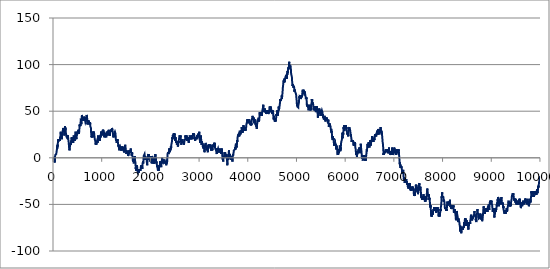
| Category | Series 0 |
|---|---|
| 0.0 | -1 |
| 1.0 | 0 |
| 2.0 | 1 |
| 3.0 | 2 |
| 4.0 | 1 |
| 5.0 | 0 |
| 6.0 | -1 |
| 7.0 | 0 |
| 8.0 | -1 |
| 9.0 | -2 |
| 10.0 | -3 |
| 11.0 | -2 |
| 12.0 | -3 |
| 13.0 | -4 |
| 14.0 | -3 |
| 15.0 | -4 |
| 16.0 | -5 |
| 17.0 | -4 |
| 18.0 | -3 |
| 19.0 | -2 |
| 20.0 | -1 |
| 21.0 | 0 |
| 22.0 | 1 |
| 23.0 | 2 |
| 24.0 | 3 |
| 25.0 | 2 |
| 26.0 | 3 |
| 27.0 | 4 |
| 28.0 | 3 |
| 29.0 | 4 |
| 30.0 | 3 |
| 31.0 | 4 |
| 32.0 | 3 |
| 33.0 | 4 |
| 34.0 | 3 |
| 35.0 | 2 |
| 36.0 | 3 |
| 37.0 | 2 |
| 38.0 | 3 |
| 39.0 | 4 |
| 40.0 | 3 |
| 41.0 | 2 |
| 42.0 | 3 |
| 43.0 | 2 |
| 44.0 | 3 |
| 45.0 | 4 |
| 46.0 | 5 |
| 47.0 | 4 |
| 48.0 | 3 |
| 49.0 | 4 |
| 50.0 | 5 |
| 51.0 | 6 |
| 52.0 | 5 |
| 53.0 | 6 |
| 54.0 | 7 |
| 55.0 | 6 |
| 56.0 | 7 |
| 57.0 | 8 |
| 58.0 | 9 |
| 59.0 | 8 |
| 60.0 | 9 |
| 61.0 | 10 |
| 62.0 | 11 |
| 63.0 | 12 |
| 64.0 | 11 |
| 65.0 | 10 |
| 66.0 | 9 |
| 67.0 | 10 |
| 68.0 | 11 |
| 69.0 | 12 |
| 70.0 | 13 |
| 71.0 | 14 |
| 72.0 | 13 |
| 73.0 | 12 |
| 74.0 | 11 |
| 75.0 | 12 |
| 76.0 | 13 |
| 77.0 | 14 |
| 78.0 | 15 |
| 79.0 | 16 |
| 80.0 | 17 |
| 81.0 | 18 |
| 82.0 | 17 |
| 83.0 | 16 |
| 84.0 | 17 |
| 85.0 | 18 |
| 86.0 | 19 |
| 87.0 | 20 |
| 88.0 | 19 |
| 89.0 | 18 |
| 90.0 | 17 |
| 91.0 | 18 |
| 92.0 | 19 |
| 93.0 | 18 |
| 94.0 | 19 |
| 95.0 | 18 |
| 96.0 | 17 |
| 97.0 | 18 |
| 98.0 | 19 |
| 99.0 | 18 |
| 100.0 | 19 |
| 101.0 | 20 |
| 102.0 | 19 |
| 103.0 | 18 |
| 104.0 | 19 |
| 105.0 | 18 |
| 106.0 | 17 |
| 107.0 | 18 |
| 108.0 | 17 |
| 109.0 | 18 |
| 110.0 | 19 |
| 111.0 | 18 |
| 112.0 | 17 |
| 113.0 | 18 |
| 114.0 | 19 |
| 115.0 | 20 |
| 116.0 | 21 |
| 117.0 | 20 |
| 118.0 | 19 |
| 119.0 | 20 |
| 120.0 | 19 |
| 121.0 | 18 |
| 122.0 | 19 |
| 123.0 | 20 |
| 124.0 | 21 |
| 125.0 | 22 |
| 126.0 | 23 |
| 127.0 | 22 |
| 128.0 | 21 |
| 129.0 | 22 |
| 130.0 | 23 |
| 131.0 | 22 |
| 132.0 | 23 |
| 133.0 | 24 |
| 134.0 | 25 |
| 135.0 | 26 |
| 136.0 | 27 |
| 137.0 | 28 |
| 138.0 | 29 |
| 139.0 | 28 |
| 140.0 | 27 |
| 141.0 | 26 |
| 142.0 | 25 |
| 143.0 | 24 |
| 144.0 | 23 |
| 145.0 | 24 |
| 146.0 | 25 |
| 147.0 | 24 |
| 148.0 | 23 |
| 149.0 | 24 |
| 150.0 | 25 |
| 151.0 | 26 |
| 152.0 | 25 |
| 153.0 | 24 |
| 154.0 | 25 |
| 155.0 | 24 |
| 156.0 | 25 |
| 157.0 | 24 |
| 158.0 | 23 |
| 159.0 | 22 |
| 160.0 | 21 |
| 161.0 | 22 |
| 162.0 | 21 |
| 163.0 | 20 |
| 164.0 | 21 |
| 165.0 | 22 |
| 166.0 | 23 |
| 167.0 | 24 |
| 168.0 | 25 |
| 169.0 | 24 |
| 170.0 | 25 |
| 171.0 | 24 |
| 172.0 | 23 |
| 173.0 | 24 |
| 174.0 | 25 |
| 175.0 | 26 |
| 176.0 | 27 |
| 177.0 | 28 |
| 178.0 | 29 |
| 179.0 | 28 |
| 180.0 | 29 |
| 181.0 | 28 |
| 182.0 | 29 |
| 183.0 | 30 |
| 184.0 | 31 |
| 185.0 | 32 |
| 186.0 | 33 |
| 187.0 | 32 |
| 188.0 | 33 |
| 189.0 | 32 |
| 190.0 | 33 |
| 191.0 | 32 |
| 192.0 | 31 |
| 193.0 | 30 |
| 194.0 | 29 |
| 195.0 | 30 |
| 196.0 | 31 |
| 197.0 | 32 |
| 198.0 | 33 |
| 199.0 | 32 |
| 200.0 | 33 |
| 201.0 | 32 |
| 202.0 | 33 |
| 203.0 | 32 |
| 204.0 | 31 |
| 205.0 | 30 |
| 206.0 | 29 |
| 207.0 | 28 |
| 208.0 | 27 |
| 209.0 | 26 |
| 210.0 | 27 |
| 211.0 | 26 |
| 212.0 | 25 |
| 213.0 | 24 |
| 214.0 | 25 |
| 215.0 | 26 |
| 216.0 | 27 |
| 217.0 | 26 |
| 218.0 | 27 |
| 219.0 | 28 |
| 220.0 | 27 |
| 221.0 | 28 |
| 222.0 | 29 |
| 223.0 | 30 |
| 224.0 | 31 |
| 225.0 | 32 |
| 226.0 | 33 |
| 227.0 | 34 |
| 228.0 | 33 |
| 229.0 | 32 |
| 230.0 | 31 |
| 231.0 | 30 |
| 232.0 | 31 |
| 233.0 | 32 |
| 234.0 | 33 |
| 235.0 | 32 |
| 236.0 | 31 |
| 237.0 | 32 |
| 238.0 | 31 |
| 239.0 | 30 |
| 240.0 | 29 |
| 241.0 | 28 |
| 242.0 | 29 |
| 243.0 | 28 |
| 244.0 | 27 |
| 245.0 | 26 |
| 246.0 | 27 |
| 247.0 | 26 |
| 248.0 | 27 |
| 249.0 | 26 |
| 250.0 | 27 |
| 251.0 | 26 |
| 252.0 | 25 |
| 253.0 | 24 |
| 254.0 | 23 |
| 255.0 | 24 |
| 256.0 | 25 |
| 257.0 | 24 |
| 258.0 | 25 |
| 259.0 | 24 |
| 260.0 | 25 |
| 261.0 | 24 |
| 262.0 | 23 |
| 263.0 | 22 |
| 264.0 | 23 |
| 265.0 | 24 |
| 266.0 | 23 |
| 267.0 | 24 |
| 268.0 | 23 |
| 269.0 | 24 |
| 270.0 | 25 |
| 271.0 | 24 |
| 272.0 | 23 |
| 273.0 | 22 |
| 274.0 | 23 |
| 275.0 | 24 |
| 276.0 | 23 |
| 277.0 | 22 |
| 278.0 | 21 |
| 279.0 | 20 |
| 280.0 | 21 |
| 281.0 | 22 |
| 282.0 | 21 |
| 283.0 | 22 |
| 284.0 | 23 |
| 285.0 | 22 |
| 286.0 | 23 |
| 287.0 | 24 |
| 288.0 | 23 |
| 289.0 | 22 |
| 290.0 | 23 |
| 291.0 | 22 |
| 292.0 | 21 |
| 293.0 | 20 |
| 294.0 | 21 |
| 295.0 | 20 |
| 296.0 | 19 |
| 297.0 | 18 |
| 298.0 | 19 |
| 299.0 | 18 |
| 300.0 | 17 |
| 301.0 | 18 |
| 302.0 | 17 |
| 303.0 | 16 |
| 304.0 | 15 |
| 305.0 | 14 |
| 306.0 | 15 |
| 307.0 | 14 |
| 308.0 | 13 |
| 309.0 | 12 |
| 310.0 | 11 |
| 311.0 | 10 |
| 312.0 | 11 |
| 313.0 | 10 |
| 314.0 | 11 |
| 315.0 | 10 |
| 316.0 | 9 |
| 317.0 | 8 |
| 318.0 | 9 |
| 319.0 | 8 |
| 320.0 | 7 |
| 321.0 | 8 |
| 322.0 | 9 |
| 323.0 | 10 |
| 324.0 | 9 |
| 325.0 | 10 |
| 326.0 | 11 |
| 327.0 | 12 |
| 328.0 | 11 |
| 329.0 | 12 |
| 330.0 | 13 |
| 331.0 | 12 |
| 332.0 | 13 |
| 333.0 | 14 |
| 334.0 | 15 |
| 335.0 | 14 |
| 336.0 | 13 |
| 337.0 | 14 |
| 338.0 | 13 |
| 339.0 | 14 |
| 340.0 | 15 |
| 341.0 | 16 |
| 342.0 | 15 |
| 343.0 | 14 |
| 344.0 | 15 |
| 345.0 | 14 |
| 346.0 | 15 |
| 347.0 | 16 |
| 348.0 | 17 |
| 349.0 | 18 |
| 350.0 | 19 |
| 351.0 | 18 |
| 352.0 | 17 |
| 353.0 | 18 |
| 354.0 | 17 |
| 355.0 | 18 |
| 356.0 | 17 |
| 357.0 | 18 |
| 358.0 | 19 |
| 359.0 | 20 |
| 360.0 | 21 |
| 361.0 | 22 |
| 362.0 | 23 |
| 363.0 | 22 |
| 364.0 | 21 |
| 365.0 | 22 |
| 366.0 | 21 |
| 367.0 | 20 |
| 368.0 | 21 |
| 369.0 | 22 |
| 370.0 | 21 |
| 371.0 | 22 |
| 372.0 | 23 |
| 373.0 | 22 |
| 374.0 | 23 |
| 375.0 | 22 |
| 376.0 | 21 |
| 377.0 | 20 |
| 378.0 | 19 |
| 379.0 | 20 |
| 380.0 | 19 |
| 381.0 | 18 |
| 382.0 | 19 |
| 383.0 | 18 |
| 384.0 | 17 |
| 385.0 | 18 |
| 386.0 | 17 |
| 387.0 | 18 |
| 388.0 | 17 |
| 389.0 | 18 |
| 390.0 | 19 |
| 391.0 | 18 |
| 392.0 | 17 |
| 393.0 | 16 |
| 394.0 | 17 |
| 395.0 | 18 |
| 396.0 | 19 |
| 397.0 | 20 |
| 398.0 | 21 |
| 399.0 | 20 |
| 400.0 | 21 |
| 401.0 | 22 |
| 402.0 | 23 |
| 403.0 | 22 |
| 404.0 | 23 |
| 405.0 | 24 |
| 406.0 | 25 |
| 407.0 | 24 |
| 408.0 | 23 |
| 409.0 | 24 |
| 410.0 | 23 |
| 411.0 | 22 |
| 412.0 | 21 |
| 413.0 | 22 |
| 414.0 | 21 |
| 415.0 | 20 |
| 416.0 | 19 |
| 417.0 | 18 |
| 418.0 | 19 |
| 419.0 | 20 |
| 420.0 | 19 |
| 421.0 | 18 |
| 422.0 | 19 |
| 423.0 | 20 |
| 424.0 | 19 |
| 425.0 | 20 |
| 426.0 | 21 |
| 427.0 | 22 |
| 428.0 | 23 |
| 429.0 | 22 |
| 430.0 | 21 |
| 431.0 | 22 |
| 432.0 | 21 |
| 433.0 | 22 |
| 434.0 | 23 |
| 435.0 | 22 |
| 436.0 | 23 |
| 437.0 | 24 |
| 438.0 | 25 |
| 439.0 | 26 |
| 440.0 | 27 |
| 441.0 | 26 |
| 442.0 | 27 |
| 443.0 | 28 |
| 444.0 | 29 |
| 445.0 | 28 |
| 446.0 | 27 |
| 447.0 | 26 |
| 448.0 | 25 |
| 449.0 | 24 |
| 450.0 | 23 |
| 451.0 | 24 |
| 452.0 | 23 |
| 453.0 | 22 |
| 454.0 | 23 |
| 455.0 | 22 |
| 456.0 | 23 |
| 457.0 | 22 |
| 458.0 | 21 |
| 459.0 | 20 |
| 460.0 | 21 |
| 461.0 | 22 |
| 462.0 | 23 |
| 463.0 | 24 |
| 464.0 | 25 |
| 465.0 | 26 |
| 466.0 | 27 |
| 467.0 | 26 |
| 468.0 | 27 |
| 469.0 | 28 |
| 470.0 | 27 |
| 471.0 | 28 |
| 472.0 | 27 |
| 473.0 | 28 |
| 474.0 | 29 |
| 475.0 | 28 |
| 476.0 | 29 |
| 477.0 | 28 |
| 478.0 | 29 |
| 479.0 | 28 |
| 480.0 | 27 |
| 481.0 | 26 |
| 482.0 | 27 |
| 483.0 | 26 |
| 484.0 | 25 |
| 485.0 | 26 |
| 486.0 | 27 |
| 487.0 | 26 |
| 488.0 | 25 |
| 489.0 | 26 |
| 490.0 | 27 |
| 491.0 | 26 |
| 492.0 | 27 |
| 493.0 | 28 |
| 494.0 | 27 |
| 495.0 | 28 |
| 496.0 | 29 |
| 497.0 | 28 |
| 498.0 | 29 |
| 499.0 | 30 |
| 500.0 | 29 |
| 501.0 | 28 |
| 502.0 | 27 |
| 503.0 | 26 |
| 504.0 | 27 |
| 505.0 | 26 |
| 506.0 | 27 |
| 507.0 | 28 |
| 508.0 | 27 |
| 509.0 | 26 |
| 510.0 | 25 |
| 511.0 | 26 |
| 512.0 | 27 |
| 513.0 | 26 |
| 514.0 | 27 |
| 515.0 | 26 |
| 516.0 | 27 |
| 517.0 | 28 |
| 518.0 | 29 |
| 519.0 | 30 |
| 520.0 | 31 |
| 521.0 | 30 |
| 522.0 | 31 |
| 523.0 | 32 |
| 524.0 | 33 |
| 525.0 | 34 |
| 526.0 | 35 |
| 527.0 | 36 |
| 528.0 | 35 |
| 529.0 | 34 |
| 530.0 | 33 |
| 531.0 | 34 |
| 532.0 | 35 |
| 533.0 | 36 |
| 534.0 | 37 |
| 535.0 | 36 |
| 536.0 | 35 |
| 537.0 | 36 |
| 538.0 | 35 |
| 539.0 | 36 |
| 540.0 | 35 |
| 541.0 | 34 |
| 542.0 | 35 |
| 543.0 | 36 |
| 544.0 | 37 |
| 545.0 | 38 |
| 546.0 | 39 |
| 547.0 | 38 |
| 548.0 | 39 |
| 549.0 | 40 |
| 550.0 | 41 |
| 551.0 | 42 |
| 552.0 | 43 |
| 553.0 | 42 |
| 554.0 | 41 |
| 555.0 | 40 |
| 556.0 | 39 |
| 557.0 | 40 |
| 558.0 | 39 |
| 559.0 | 38 |
| 560.0 | 37 |
| 561.0 | 36 |
| 562.0 | 37 |
| 563.0 | 38 |
| 564.0 | 37 |
| 565.0 | 38 |
| 566.0 | 39 |
| 567.0 | 40 |
| 568.0 | 41 |
| 569.0 | 42 |
| 570.0 | 43 |
| 571.0 | 44 |
| 572.0 | 45 |
| 573.0 | 46 |
| 574.0 | 47 |
| 575.0 | 46 |
| 576.0 | 45 |
| 577.0 | 44 |
| 578.0 | 43 |
| 579.0 | 44 |
| 580.0 | 43 |
| 581.0 | 44 |
| 582.0 | 43 |
| 583.0 | 42 |
| 584.0 | 41 |
| 585.0 | 42 |
| 586.0 | 43 |
| 587.0 | 42 |
| 588.0 | 43 |
| 589.0 | 42 |
| 590.0 | 41 |
| 591.0 | 42 |
| 592.0 | 41 |
| 593.0 | 40 |
| 594.0 | 41 |
| 595.0 | 40 |
| 596.0 | 39 |
| 597.0 | 40 |
| 598.0 | 41 |
| 599.0 | 42 |
| 600.0 | 41 |
| 601.0 | 40 |
| 602.0 | 41 |
| 603.0 | 42 |
| 604.0 | 41 |
| 605.0 | 42 |
| 606.0 | 41 |
| 607.0 | 42 |
| 608.0 | 43 |
| 609.0 | 44 |
| 610.0 | 43 |
| 611.0 | 44 |
| 612.0 | 45 |
| 613.0 | 44 |
| 614.0 | 45 |
| 615.0 | 44 |
| 616.0 | 43 |
| 617.0 | 42 |
| 618.0 | 43 |
| 619.0 | 44 |
| 620.0 | 43 |
| 621.0 | 44 |
| 622.0 | 45 |
| 623.0 | 44 |
| 624.0 | 43 |
| 625.0 | 42 |
| 626.0 | 41 |
| 627.0 | 42 |
| 628.0 | 43 |
| 629.0 | 42 |
| 630.0 | 41 |
| 631.0 | 42 |
| 632.0 | 43 |
| 633.0 | 42 |
| 634.0 | 43 |
| 635.0 | 42 |
| 636.0 | 41 |
| 637.0 | 40 |
| 638.0 | 41 |
| 639.0 | 40 |
| 640.0 | 39 |
| 641.0 | 40 |
| 642.0 | 41 |
| 643.0 | 40 |
| 644.0 | 39 |
| 645.0 | 38 |
| 646.0 | 37 |
| 647.0 | 38 |
| 648.0 | 39 |
| 649.0 | 38 |
| 650.0 | 39 |
| 651.0 | 38 |
| 652.0 | 37 |
| 653.0 | 38 |
| 654.0 | 37 |
| 655.0 | 38 |
| 656.0 | 39 |
| 657.0 | 38 |
| 658.0 | 39 |
| 659.0 | 40 |
| 660.0 | 41 |
| 661.0 | 42 |
| 662.0 | 41 |
| 663.0 | 42 |
| 664.0 | 43 |
| 665.0 | 44 |
| 666.0 | 43 |
| 667.0 | 44 |
| 668.0 | 45 |
| 669.0 | 44 |
| 670.0 | 45 |
| 671.0 | 46 |
| 672.0 | 47 |
| 673.0 | 46 |
| 674.0 | 47 |
| 675.0 | 46 |
| 676.0 | 45 |
| 677.0 | 44 |
| 678.0 | 43 |
| 679.0 | 44 |
| 680.0 | 43 |
| 681.0 | 42 |
| 682.0 | 41 |
| 683.0 | 40 |
| 684.0 | 39 |
| 685.0 | 38 |
| 686.0 | 37 |
| 687.0 | 38 |
| 688.0 | 37 |
| 689.0 | 36 |
| 690.0 | 37 |
| 691.0 | 38 |
| 692.0 | 37 |
| 693.0 | 38 |
| 694.0 | 37 |
| 695.0 | 36 |
| 696.0 | 37 |
| 697.0 | 38 |
| 698.0 | 39 |
| 699.0 | 40 |
| 700.0 | 41 |
| 701.0 | 40 |
| 702.0 | 39 |
| 703.0 | 38 |
| 704.0 | 37 |
| 705.0 | 38 |
| 706.0 | 39 |
| 707.0 | 38 |
| 708.0 | 37 |
| 709.0 | 38 |
| 710.0 | 39 |
| 711.0 | 38 |
| 712.0 | 37 |
| 713.0 | 38 |
| 714.0 | 39 |
| 715.0 | 40 |
| 716.0 | 39 |
| 717.0 | 38 |
| 718.0 | 37 |
| 719.0 | 38 |
| 720.0 | 37 |
| 721.0 | 36 |
| 722.0 | 37 |
| 723.0 | 38 |
| 724.0 | 39 |
| 725.0 | 38 |
| 726.0 | 37 |
| 727.0 | 36 |
| 728.0 | 37 |
| 729.0 | 36 |
| 730.0 | 35 |
| 731.0 | 36 |
| 732.0 | 35 |
| 733.0 | 36 |
| 734.0 | 37 |
| 735.0 | 36 |
| 736.0 | 35 |
| 737.0 | 36 |
| 738.0 | 35 |
| 739.0 | 36 |
| 740.0 | 37 |
| 741.0 | 38 |
| 742.0 | 37 |
| 743.0 | 36 |
| 744.0 | 35 |
| 745.0 | 34 |
| 746.0 | 33 |
| 747.0 | 34 |
| 748.0 | 33 |
| 749.0 | 34 |
| 750.0 | 35 |
| 751.0 | 34 |
| 752.0 | 35 |
| 753.0 | 34 |
| 754.0 | 35 |
| 755.0 | 34 |
| 756.0 | 33 |
| 757.0 | 32 |
| 758.0 | 31 |
| 759.0 | 30 |
| 760.0 | 29 |
| 761.0 | 28 |
| 762.0 | 27 |
| 763.0 | 26 |
| 764.0 | 27 |
| 765.0 | 26 |
| 766.0 | 27 |
| 767.0 | 26 |
| 768.0 | 25 |
| 769.0 | 24 |
| 770.0 | 23 |
| 771.0 | 22 |
| 772.0 | 23 |
| 773.0 | 24 |
| 774.0 | 25 |
| 775.0 | 24 |
| 776.0 | 23 |
| 777.0 | 24 |
| 778.0 | 23 |
| 779.0 | 24 |
| 780.0 | 25 |
| 781.0 | 24 |
| 782.0 | 23 |
| 783.0 | 24 |
| 784.0 | 23 |
| 785.0 | 22 |
| 786.0 | 23 |
| 787.0 | 24 |
| 788.0 | 23 |
| 789.0 | 24 |
| 790.0 | 23 |
| 791.0 | 24 |
| 792.0 | 23 |
| 793.0 | 22 |
| 794.0 | 23 |
| 795.0 | 22 |
| 796.0 | 23 |
| 797.0 | 24 |
| 798.0 | 25 |
| 799.0 | 26 |
| 800.0 | 27 |
| 801.0 | 28 |
| 802.0 | 27 |
| 803.0 | 26 |
| 804.0 | 27 |
| 805.0 | 28 |
| 806.0 | 27 |
| 807.0 | 26 |
| 808.0 | 27 |
| 809.0 | 26 |
| 810.0 | 27 |
| 811.0 | 26 |
| 812.0 | 25 |
| 813.0 | 26 |
| 814.0 | 27 |
| 815.0 | 28 |
| 816.0 | 29 |
| 817.0 | 28 |
| 818.0 | 29 |
| 819.0 | 28 |
| 820.0 | 29 |
| 821.0 | 28 |
| 822.0 | 27 |
| 823.0 | 28 |
| 824.0 | 27 |
| 825.0 | 26 |
| 826.0 | 25 |
| 827.0 | 24 |
| 828.0 | 23 |
| 829.0 | 24 |
| 830.0 | 23 |
| 831.0 | 24 |
| 832.0 | 23 |
| 833.0 | 22 |
| 834.0 | 23 |
| 835.0 | 22 |
| 836.0 | 21 |
| 837.0 | 20 |
| 838.0 | 19 |
| 839.0 | 20 |
| 840.0 | 21 |
| 841.0 | 20 |
| 842.0 | 19 |
| 843.0 | 20 |
| 844.0 | 19 |
| 845.0 | 20 |
| 846.0 | 19 |
| 847.0 | 18 |
| 848.0 | 17 |
| 849.0 | 18 |
| 850.0 | 19 |
| 851.0 | 18 |
| 852.0 | 17 |
| 853.0 | 16 |
| 854.0 | 17 |
| 855.0 | 16 |
| 856.0 | 15 |
| 857.0 | 14 |
| 858.0 | 15 |
| 859.0 | 16 |
| 860.0 | 15 |
| 861.0 | 16 |
| 862.0 | 15 |
| 863.0 | 14 |
| 864.0 | 15 |
| 865.0 | 16 |
| 866.0 | 15 |
| 867.0 | 14 |
| 868.0 | 15 |
| 869.0 | 14 |
| 870.0 | 15 |
| 871.0 | 16 |
| 872.0 | 15 |
| 873.0 | 16 |
| 874.0 | 15 |
| 875.0 | 16 |
| 876.0 | 15 |
| 877.0 | 16 |
| 878.0 | 17 |
| 879.0 | 16 |
| 880.0 | 17 |
| 881.0 | 16 |
| 882.0 | 17 |
| 883.0 | 18 |
| 884.0 | 19 |
| 885.0 | 18 |
| 886.0 | 17 |
| 887.0 | 18 |
| 888.0 | 19 |
| 889.0 | 18 |
| 890.0 | 19 |
| 891.0 | 18 |
| 892.0 | 19 |
| 893.0 | 18 |
| 894.0 | 17 |
| 895.0 | 16 |
| 896.0 | 17 |
| 897.0 | 18 |
| 898.0 | 19 |
| 899.0 | 20 |
| 900.0 | 21 |
| 901.0 | 22 |
| 902.0 | 23 |
| 903.0 | 24 |
| 904.0 | 23 |
| 905.0 | 22 |
| 906.0 | 23 |
| 907.0 | 22 |
| 908.0 | 23 |
| 909.0 | 22 |
| 910.0 | 21 |
| 911.0 | 22 |
| 912.0 | 21 |
| 913.0 | 20 |
| 914.0 | 21 |
| 915.0 | 22 |
| 916.0 | 23 |
| 917.0 | 22 |
| 918.0 | 21 |
| 919.0 | 22 |
| 920.0 | 21 |
| 921.0 | 20 |
| 922.0 | 21 |
| 923.0 | 20 |
| 924.0 | 19 |
| 925.0 | 20 |
| 926.0 | 19 |
| 927.0 | 18 |
| 928.0 | 17 |
| 929.0 | 18 |
| 930.0 | 19 |
| 931.0 | 20 |
| 932.0 | 21 |
| 933.0 | 20 |
| 934.0 | 21 |
| 935.0 | 20 |
| 936.0 | 19 |
| 937.0 | 18 |
| 938.0 | 19 |
| 939.0 | 20 |
| 940.0 | 21 |
| 941.0 | 22 |
| 942.0 | 21 |
| 943.0 | 20 |
| 944.0 | 21 |
| 945.0 | 20 |
| 946.0 | 21 |
| 947.0 | 22 |
| 948.0 | 23 |
| 949.0 | 24 |
| 950.0 | 23 |
| 951.0 | 22 |
| 952.0 | 23 |
| 953.0 | 24 |
| 954.0 | 25 |
| 955.0 | 24 |
| 956.0 | 23 |
| 957.0 | 22 |
| 958.0 | 23 |
| 959.0 | 24 |
| 960.0 | 23 |
| 961.0 | 24 |
| 962.0 | 25 |
| 963.0 | 26 |
| 964.0 | 27 |
| 965.0 | 26 |
| 966.0 | 27 |
| 967.0 | 28 |
| 968.0 | 27 |
| 969.0 | 28 |
| 970.0 | 27 |
| 971.0 | 26 |
| 972.0 | 27 |
| 973.0 | 28 |
| 974.0 | 29 |
| 975.0 | 28 |
| 976.0 | 27 |
| 977.0 | 28 |
| 978.0 | 27 |
| 979.0 | 28 |
| 980.0 | 27 |
| 981.0 | 26 |
| 982.0 | 25 |
| 983.0 | 26 |
| 984.0 | 25 |
| 985.0 | 24 |
| 986.0 | 23 |
| 987.0 | 24 |
| 988.0 | 23 |
| 989.0 | 24 |
| 990.0 | 23 |
| 991.0 | 24 |
| 992.0 | 25 |
| 993.0 | 26 |
| 994.0 | 25 |
| 995.0 | 26 |
| 996.0 | 27 |
| 997.0 | 28 |
| 998.0 | 27 |
| 999.0 | 28 |
| 1000.0 | 29 |
| 1001.0 | 30 |
| 1002.0 | 31 |
| 1003.0 | 30 |
| 1004.0 | 29 |
| 1005.0 | 30 |
| 1006.0 | 31 |
| 1007.0 | 30 |
| 1008.0 | 29 |
| 1009.0 | 28 |
| 1010.0 | 29 |
| 1011.0 | 30 |
| 1012.0 | 29 |
| 1013.0 | 28 |
| 1014.0 | 27 |
| 1015.0 | 28 |
| 1016.0 | 27 |
| 1017.0 | 28 |
| 1018.0 | 27 |
| 1019.0 | 26 |
| 1020.0 | 25 |
| 1021.0 | 26 |
| 1022.0 | 27 |
| 1023.0 | 28 |
| 1024.0 | 27 |
| 1025.0 | 26 |
| 1026.0 | 25 |
| 1027.0 | 26 |
| 1028.0 | 25 |
| 1029.0 | 24 |
| 1030.0 | 23 |
| 1031.0 | 22 |
| 1032.0 | 23 |
| 1033.0 | 22 |
| 1034.0 | 23 |
| 1035.0 | 24 |
| 1036.0 | 23 |
| 1037.0 | 24 |
| 1038.0 | 23 |
| 1039.0 | 24 |
| 1040.0 | 25 |
| 1041.0 | 24 |
| 1042.0 | 25 |
| 1043.0 | 24 |
| 1044.0 | 25 |
| 1045.0 | 26 |
| 1046.0 | 27 |
| 1047.0 | 26 |
| 1048.0 | 25 |
| 1049.0 | 24 |
| 1050.0 | 23 |
| 1051.0 | 22 |
| 1052.0 | 23 |
| 1053.0 | 24 |
| 1054.0 | 25 |
| 1055.0 | 24 |
| 1056.0 | 25 |
| 1057.0 | 26 |
| 1058.0 | 25 |
| 1059.0 | 26 |
| 1060.0 | 25 |
| 1061.0 | 24 |
| 1062.0 | 25 |
| 1063.0 | 24 |
| 1064.0 | 25 |
| 1065.0 | 24 |
| 1066.0 | 25 |
| 1067.0 | 24 |
| 1068.0 | 25 |
| 1069.0 | 24 |
| 1070.0 | 23 |
| 1071.0 | 22 |
| 1072.0 | 23 |
| 1073.0 | 22 |
| 1074.0 | 21 |
| 1075.0 | 22 |
| 1076.0 | 23 |
| 1077.0 | 24 |
| 1078.0 | 25 |
| 1079.0 | 26 |
| 1080.0 | 27 |
| 1081.0 | 28 |
| 1082.0 | 29 |
| 1083.0 | 28 |
| 1084.0 | 29 |
| 1085.0 | 28 |
| 1086.0 | 27 |
| 1087.0 | 28 |
| 1088.0 | 27 |
| 1089.0 | 26 |
| 1090.0 | 25 |
| 1091.0 | 24 |
| 1092.0 | 23 |
| 1093.0 | 24 |
| 1094.0 | 25 |
| 1095.0 | 26 |
| 1096.0 | 27 |
| 1097.0 | 28 |
| 1098.0 | 27 |
| 1099.0 | 26 |
| 1100.0 | 27 |
| 1101.0 | 26 |
| 1102.0 | 27 |
| 1103.0 | 28 |
| 1104.0 | 27 |
| 1105.0 | 26 |
| 1106.0 | 27 |
| 1107.0 | 28 |
| 1108.0 | 29 |
| 1109.0 | 28 |
| 1110.0 | 27 |
| 1111.0 | 26 |
| 1112.0 | 27 |
| 1113.0 | 26 |
| 1114.0 | 27 |
| 1115.0 | 28 |
| 1116.0 | 27 |
| 1117.0 | 28 |
| 1118.0 | 29 |
| 1119.0 | 28 |
| 1120.0 | 29 |
| 1121.0 | 30 |
| 1122.0 | 29 |
| 1123.0 | 28 |
| 1124.0 | 27 |
| 1125.0 | 28 |
| 1126.0 | 27 |
| 1127.0 | 26 |
| 1128.0 | 27 |
| 1129.0 | 26 |
| 1130.0 | 25 |
| 1131.0 | 26 |
| 1132.0 | 25 |
| 1133.0 | 24 |
| 1134.0 | 25 |
| 1135.0 | 24 |
| 1136.0 | 25 |
| 1137.0 | 24 |
| 1138.0 | 25 |
| 1139.0 | 26 |
| 1140.0 | 25 |
| 1141.0 | 26 |
| 1142.0 | 25 |
| 1143.0 | 24 |
| 1144.0 | 25 |
| 1145.0 | 26 |
| 1146.0 | 25 |
| 1147.0 | 26 |
| 1148.0 | 25 |
| 1149.0 | 24 |
| 1150.0 | 25 |
| 1151.0 | 26 |
| 1152.0 | 27 |
| 1153.0 | 28 |
| 1154.0 | 29 |
| 1155.0 | 30 |
| 1156.0 | 31 |
| 1157.0 | 30 |
| 1158.0 | 29 |
| 1159.0 | 28 |
| 1160.0 | 27 |
| 1161.0 | 28 |
| 1162.0 | 29 |
| 1163.0 | 30 |
| 1164.0 | 29 |
| 1165.0 | 30 |
| 1166.0 | 29 |
| 1167.0 | 30 |
| 1168.0 | 31 |
| 1169.0 | 30 |
| 1170.0 | 29 |
| 1171.0 | 30 |
| 1172.0 | 29 |
| 1173.0 | 28 |
| 1174.0 | 29 |
| 1175.0 | 30 |
| 1176.0 | 31 |
| 1177.0 | 30 |
| 1178.0 | 31 |
| 1179.0 | 30 |
| 1180.0 | 29 |
| 1181.0 | 28 |
| 1182.0 | 29 |
| 1183.0 | 28 |
| 1184.0 | 27 |
| 1185.0 | 28 |
| 1186.0 | 29 |
| 1187.0 | 30 |
| 1188.0 | 31 |
| 1189.0 | 32 |
| 1190.0 | 31 |
| 1191.0 | 32 |
| 1192.0 | 33 |
| 1193.0 | 32 |
| 1194.0 | 31 |
| 1195.0 | 32 |
| 1196.0 | 33 |
| 1197.0 | 32 |
| 1198.0 | 33 |
| 1199.0 | 32 |
| 1200.0 | 31 |
| 1201.0 | 30 |
| 1202.0 | 31 |
| 1203.0 | 30 |
| 1204.0 | 29 |
| 1205.0 | 28 |
| 1206.0 | 29 |
| 1207.0 | 28 |
| 1208.0 | 27 |
| 1209.0 | 26 |
| 1210.0 | 27 |
| 1211.0 | 26 |
| 1212.0 | 25 |
| 1213.0 | 24 |
| 1214.0 | 23 |
| 1215.0 | 24 |
| 1216.0 | 23 |
| 1217.0 | 24 |
| 1218.0 | 25 |
| 1219.0 | 24 |
| 1220.0 | 23 |
| 1221.0 | 22 |
| 1222.0 | 23 |
| 1223.0 | 24 |
| 1224.0 | 25 |
| 1225.0 | 26 |
| 1226.0 | 25 |
| 1227.0 | 24 |
| 1228.0 | 23 |
| 1229.0 | 22 |
| 1230.0 | 23 |
| 1231.0 | 24 |
| 1232.0 | 25 |
| 1233.0 | 24 |
| 1234.0 | 25 |
| 1235.0 | 26 |
| 1236.0 | 27 |
| 1237.0 | 26 |
| 1238.0 | 27 |
| 1239.0 | 26 |
| 1240.0 | 25 |
| 1241.0 | 26 |
| 1242.0 | 27 |
| 1243.0 | 26 |
| 1244.0 | 25 |
| 1245.0 | 26 |
| 1246.0 | 25 |
| 1247.0 | 26 |
| 1248.0 | 25 |
| 1249.0 | 26 |
| 1250.0 | 27 |
| 1251.0 | 28 |
| 1252.0 | 27 |
| 1253.0 | 28 |
| 1254.0 | 27 |
| 1255.0 | 28 |
| 1256.0 | 29 |
| 1257.0 | 28 |
| 1258.0 | 29 |
| 1259.0 | 28 |
| 1260.0 | 29 |
| 1261.0 | 28 |
| 1262.0 | 27 |
| 1263.0 | 26 |
| 1264.0 | 25 |
| 1265.0 | 24 |
| 1266.0 | 23 |
| 1267.0 | 22 |
| 1268.0 | 21 |
| 1269.0 | 20 |
| 1270.0 | 21 |
| 1271.0 | 20 |
| 1272.0 | 19 |
| 1273.0 | 20 |
| 1274.0 | 19 |
| 1275.0 | 18 |
| 1276.0 | 17 |
| 1277.0 | 18 |
| 1278.0 | 19 |
| 1279.0 | 20 |
| 1280.0 | 19 |
| 1281.0 | 18 |
| 1282.0 | 17 |
| 1283.0 | 18 |
| 1284.0 | 19 |
| 1285.0 | 18 |
| 1286.0 | 17 |
| 1287.0 | 16 |
| 1288.0 | 15 |
| 1289.0 | 16 |
| 1290.0 | 17 |
| 1291.0 | 16 |
| 1292.0 | 17 |
| 1293.0 | 16 |
| 1294.0 | 17 |
| 1295.0 | 18 |
| 1296.0 | 17 |
| 1297.0 | 18 |
| 1298.0 | 17 |
| 1299.0 | 18 |
| 1300.0 | 17 |
| 1301.0 | 18 |
| 1302.0 | 19 |
| 1303.0 | 18 |
| 1304.0 | 19 |
| 1305.0 | 20 |
| 1306.0 | 21 |
| 1307.0 | 20 |
| 1308.0 | 19 |
| 1309.0 | 18 |
| 1310.0 | 19 |
| 1311.0 | 18 |
| 1312.0 | 17 |
| 1313.0 | 18 |
| 1314.0 | 17 |
| 1315.0 | 16 |
| 1316.0 | 15 |
| 1317.0 | 14 |
| 1318.0 | 13 |
| 1319.0 | 14 |
| 1320.0 | 13 |
| 1321.0 | 14 |
| 1322.0 | 13 |
| 1323.0 | 14 |
| 1324.0 | 13 |
| 1325.0 | 12 |
| 1326.0 | 13 |
| 1327.0 | 14 |
| 1328.0 | 13 |
| 1329.0 | 12 |
| 1330.0 | 13 |
| 1331.0 | 12 |
| 1332.0 | 13 |
| 1333.0 | 12 |
| 1334.0 | 11 |
| 1335.0 | 10 |
| 1336.0 | 11 |
| 1337.0 | 12 |
| 1338.0 | 11 |
| 1339.0 | 10 |
| 1340.0 | 9 |
| 1341.0 | 8 |
| 1342.0 | 7 |
| 1343.0 | 8 |
| 1344.0 | 9 |
| 1345.0 | 10 |
| 1346.0 | 11 |
| 1347.0 | 10 |
| 1348.0 | 9 |
| 1349.0 | 10 |
| 1350.0 | 9 |
| 1351.0 | 10 |
| 1352.0 | 11 |
| 1353.0 | 10 |
| 1354.0 | 9 |
| 1355.0 | 10 |
| 1356.0 | 9 |
| 1357.0 | 10 |
| 1358.0 | 11 |
| 1359.0 | 12 |
| 1360.0 | 13 |
| 1361.0 | 12 |
| 1362.0 | 13 |
| 1363.0 | 12 |
| 1364.0 | 13 |
| 1365.0 | 12 |
| 1366.0 | 11 |
| 1367.0 | 12 |
| 1368.0 | 11 |
| 1369.0 | 12 |
| 1370.0 | 11 |
| 1371.0 | 10 |
| 1372.0 | 11 |
| 1373.0 | 10 |
| 1374.0 | 9 |
| 1375.0 | 8 |
| 1376.0 | 9 |
| 1377.0 | 10 |
| 1378.0 | 11 |
| 1379.0 | 10 |
| 1380.0 | 9 |
| 1381.0 | 10 |
| 1382.0 | 9 |
| 1383.0 | 8 |
| 1384.0 | 7 |
| 1385.0 | 8 |
| 1386.0 | 9 |
| 1387.0 | 10 |
| 1388.0 | 11 |
| 1389.0 | 12 |
| 1390.0 | 11 |
| 1391.0 | 10 |
| 1392.0 | 9 |
| 1393.0 | 8 |
| 1394.0 | 9 |
| 1395.0 | 10 |
| 1396.0 | 11 |
| 1397.0 | 12 |
| 1398.0 | 11 |
| 1399.0 | 12 |
| 1400.0 | 11 |
| 1401.0 | 10 |
| 1402.0 | 11 |
| 1403.0 | 10 |
| 1404.0 | 11 |
| 1405.0 | 10 |
| 1406.0 | 9 |
| 1407.0 | 8 |
| 1408.0 | 9 |
| 1409.0 | 10 |
| 1410.0 | 11 |
| 1411.0 | 12 |
| 1412.0 | 13 |
| 1413.0 | 12 |
| 1414.0 | 11 |
| 1415.0 | 12 |
| 1416.0 | 11 |
| 1417.0 | 12 |
| 1418.0 | 11 |
| 1419.0 | 10 |
| 1420.0 | 11 |
| 1421.0 | 10 |
| 1422.0 | 9 |
| 1423.0 | 10 |
| 1424.0 | 11 |
| 1425.0 | 10 |
| 1426.0 | 9 |
| 1427.0 | 10 |
| 1428.0 | 9 |
| 1429.0 | 10 |
| 1430.0 | 9 |
| 1431.0 | 10 |
| 1432.0 | 9 |
| 1433.0 | 8 |
| 1434.0 | 7 |
| 1435.0 | 6 |
| 1436.0 | 7 |
| 1437.0 | 8 |
| 1438.0 | 7 |
| 1439.0 | 8 |
| 1440.0 | 7 |
| 1441.0 | 6 |
| 1442.0 | 7 |
| 1443.0 | 6 |
| 1444.0 | 7 |
| 1445.0 | 8 |
| 1446.0 | 9 |
| 1447.0 | 8 |
| 1448.0 | 7 |
| 1449.0 | 8 |
| 1450.0 | 9 |
| 1451.0 | 10 |
| 1452.0 | 11 |
| 1453.0 | 10 |
| 1454.0 | 11 |
| 1455.0 | 10 |
| 1456.0 | 11 |
| 1457.0 | 12 |
| 1458.0 | 13 |
| 1459.0 | 12 |
| 1460.0 | 13 |
| 1461.0 | 14 |
| 1462.0 | 15 |
| 1463.0 | 14 |
| 1464.0 | 13 |
| 1465.0 | 12 |
| 1466.0 | 11 |
| 1467.0 | 12 |
| 1468.0 | 13 |
| 1469.0 | 12 |
| 1470.0 | 11 |
| 1471.0 | 12 |
| 1472.0 | 11 |
| 1473.0 | 10 |
| 1474.0 | 9 |
| 1475.0 | 8 |
| 1476.0 | 7 |
| 1477.0 | 8 |
| 1478.0 | 9 |
| 1479.0 | 8 |
| 1480.0 | 9 |
| 1481.0 | 8 |
| 1482.0 | 7 |
| 1483.0 | 6 |
| 1484.0 | 5 |
| 1485.0 | 4 |
| 1486.0 | 5 |
| 1487.0 | 6 |
| 1488.0 | 5 |
| 1489.0 | 6 |
| 1490.0 | 7 |
| 1491.0 | 8 |
| 1492.0 | 7 |
| 1493.0 | 8 |
| 1494.0 | 7 |
| 1495.0 | 8 |
| 1496.0 | 9 |
| 1497.0 | 8 |
| 1498.0 | 7 |
| 1499.0 | 6 |
| 1500.0 | 7 |
| 1501.0 | 6 |
| 1502.0 | 5 |
| 1503.0 | 4 |
| 1504.0 | 5 |
| 1505.0 | 6 |
| 1506.0 | 5 |
| 1507.0 | 4 |
| 1508.0 | 5 |
| 1509.0 | 4 |
| 1510.0 | 3 |
| 1511.0 | 4 |
| 1512.0 | 5 |
| 1513.0 | 4 |
| 1514.0 | 5 |
| 1515.0 | 6 |
| 1516.0 | 7 |
| 1517.0 | 6 |
| 1518.0 | 5 |
| 1519.0 | 4 |
| 1520.0 | 3 |
| 1521.0 | 2 |
| 1522.0 | 3 |
| 1523.0 | 2 |
| 1524.0 | 3 |
| 1525.0 | 2 |
| 1526.0 | 3 |
| 1527.0 | 2 |
| 1528.0 | 3 |
| 1529.0 | 2 |
| 1530.0 | 3 |
| 1531.0 | 2 |
| 1532.0 | 3 |
| 1533.0 | 2 |
| 1534.0 | 3 |
| 1535.0 | 2 |
| 1536.0 | 3 |
| 1537.0 | 4 |
| 1538.0 | 5 |
| 1539.0 | 4 |
| 1540.0 | 5 |
| 1541.0 | 6 |
| 1542.0 | 7 |
| 1543.0 | 8 |
| 1544.0 | 9 |
| 1545.0 | 8 |
| 1546.0 | 7 |
| 1547.0 | 6 |
| 1548.0 | 7 |
| 1549.0 | 6 |
| 1550.0 | 7 |
| 1551.0 | 6 |
| 1552.0 | 5 |
| 1553.0 | 6 |
| 1554.0 | 7 |
| 1555.0 | 8 |
| 1556.0 | 7 |
| 1557.0 | 6 |
| 1558.0 | 5 |
| 1559.0 | 6 |
| 1560.0 | 5 |
| 1561.0 | 6 |
| 1562.0 | 5 |
| 1563.0 | 6 |
| 1564.0 | 7 |
| 1565.0 | 6 |
| 1566.0 | 7 |
| 1567.0 | 8 |
| 1568.0 | 7 |
| 1569.0 | 6 |
| 1570.0 | 5 |
| 1571.0 | 6 |
| 1572.0 | 7 |
| 1573.0 | 8 |
| 1574.0 | 9 |
| 1575.0 | 10 |
| 1576.0 | 9 |
| 1577.0 | 8 |
| 1578.0 | 7 |
| 1579.0 | 8 |
| 1580.0 | 7 |
| 1581.0 | 6 |
| 1582.0 | 5 |
| 1583.0 | 6 |
| 1584.0 | 5 |
| 1585.0 | 6 |
| 1586.0 | 7 |
| 1587.0 | 6 |
| 1588.0 | 7 |
| 1589.0 | 6 |
| 1590.0 | 5 |
| 1591.0 | 6 |
| 1592.0 | 5 |
| 1593.0 | 4 |
| 1594.0 | 3 |
| 1595.0 | 2 |
| 1596.0 | 1 |
| 1597.0 | 2 |
| 1598.0 | 3 |
| 1599.0 | 4 |
| 1600.0 | 5 |
| 1601.0 | 4 |
| 1602.0 | 5 |
| 1603.0 | 6 |
| 1604.0 | 5 |
| 1605.0 | 6 |
| 1606.0 | 5 |
| 1607.0 | 4 |
| 1608.0 | 3 |
| 1609.0 | 2 |
| 1610.0 | 1 |
| 1611.0 | 2 |
| 1612.0 | 1 |
| 1613.0 | 2 |
| 1614.0 | 1 |
| 1615.0 | 0 |
| 1616.0 | -1 |
| 1617.0 | -2 |
| 1618.0 | -3 |
| 1619.0 | -2 |
| 1620.0 | -3 |
| 1621.0 | -4 |
| 1622.0 | -3 |
| 1623.0 | -4 |
| 1624.0 | -5 |
| 1625.0 | -4 |
| 1626.0 | -5 |
| 1627.0 | -4 |
| 1628.0 | -3 |
| 1629.0 | -2 |
| 1630.0 | -3 |
| 1631.0 | -4 |
| 1632.0 | -5 |
| 1633.0 | -4 |
| 1634.0 | -5 |
| 1635.0 | -4 |
| 1636.0 | -5 |
| 1637.0 | -4 |
| 1638.0 | -5 |
| 1639.0 | -6 |
| 1640.0 | -7 |
| 1641.0 | -6 |
| 1642.0 | -5 |
| 1643.0 | -4 |
| 1644.0 | -3 |
| 1645.0 | -2 |
| 1646.0 | -3 |
| 1647.0 | -2 |
| 1648.0 | -1 |
| 1649.0 | 0 |
| 1650.0 | -1 |
| 1651.0 | -2 |
| 1652.0 | -1 |
| 1653.0 | 0 |
| 1654.0 | 1 |
| 1655.0 | 2 |
| 1656.0 | 1 |
| 1657.0 | 0 |
| 1658.0 | -1 |
| 1659.0 | -2 |
| 1660.0 | -1 |
| 1661.0 | -2 |
| 1662.0 | -1 |
| 1663.0 | -2 |
| 1664.0 | -1 |
| 1665.0 | -2 |
| 1666.0 | -3 |
| 1667.0 | -2 |
| 1668.0 | -3 |
| 1669.0 | -4 |
| 1670.0 | -3 |
| 1671.0 | -4 |
| 1672.0 | -5 |
| 1673.0 | -6 |
| 1674.0 | -7 |
| 1675.0 | -8 |
| 1676.0 | -9 |
| 1677.0 | -10 |
| 1678.0 | -11 |
| 1679.0 | -12 |
| 1680.0 | -11 |
| 1681.0 | -10 |
| 1682.0 | -11 |
| 1683.0 | -12 |
| 1684.0 | -11 |
| 1685.0 | -12 |
| 1686.0 | -13 |
| 1687.0 | -14 |
| 1688.0 | -15 |
| 1689.0 | -14 |
| 1690.0 | -13 |
| 1691.0 | -12 |
| 1692.0 | -11 |
| 1693.0 | -12 |
| 1694.0 | -11 |
| 1695.0 | -10 |
| 1696.0 | -11 |
| 1697.0 | -10 |
| 1698.0 | -11 |
| 1699.0 | -10 |
| 1700.0 | -11 |
| 1701.0 | -10 |
| 1702.0 | -9 |
| 1703.0 | -10 |
| 1704.0 | -9 |
| 1705.0 | -8 |
| 1706.0 | -9 |
| 1707.0 | -10 |
| 1708.0 | -11 |
| 1709.0 | -12 |
| 1710.0 | -13 |
| 1711.0 | -12 |
| 1712.0 | -13 |
| 1713.0 | -14 |
| 1714.0 | -15 |
| 1715.0 | -14 |
| 1716.0 | -13 |
| 1717.0 | -14 |
| 1718.0 | -13 |
| 1719.0 | -14 |
| 1720.0 | -15 |
| 1721.0 | -14 |
| 1722.0 | -15 |
| 1723.0 | -16 |
| 1724.0 | -15 |
| 1725.0 | -16 |
| 1726.0 | -17 |
| 1727.0 | -16 |
| 1728.0 | -17 |
| 1729.0 | -16 |
| 1730.0 | -17 |
| 1731.0 | -16 |
| 1732.0 | -17 |
| 1733.0 | -16 |
| 1734.0 | -17 |
| 1735.0 | -16 |
| 1736.0 | -15 |
| 1737.0 | -14 |
| 1738.0 | -15 |
| 1739.0 | -16 |
| 1740.0 | -17 |
| 1741.0 | -16 |
| 1742.0 | -17 |
| 1743.0 | -16 |
| 1744.0 | -15 |
| 1745.0 | -14 |
| 1746.0 | -13 |
| 1747.0 | -12 |
| 1748.0 | -11 |
| 1749.0 | -12 |
| 1750.0 | -13 |
| 1751.0 | -14 |
| 1752.0 | -15 |
| 1753.0 | -14 |
| 1754.0 | -13 |
| 1755.0 | -12 |
| 1756.0 | -13 |
| 1757.0 | -12 |
| 1758.0 | -13 |
| 1759.0 | -14 |
| 1760.0 | -13 |
| 1761.0 | -14 |
| 1762.0 | -13 |
| 1763.0 | -12 |
| 1764.0 | -13 |
| 1765.0 | -12 |
| 1766.0 | -13 |
| 1767.0 | -12 |
| 1768.0 | -11 |
| 1769.0 | -12 |
| 1770.0 | -13 |
| 1771.0 | -14 |
| 1772.0 | -13 |
| 1773.0 | -14 |
| 1774.0 | -15 |
| 1775.0 | -14 |
| 1776.0 | -15 |
| 1777.0 | -14 |
| 1778.0 | -13 |
| 1779.0 | -12 |
| 1780.0 | -11 |
| 1781.0 | -10 |
| 1782.0 | -9 |
| 1783.0 | -10 |
| 1784.0 | -9 |
| 1785.0 | -10 |
| 1786.0 | -11 |
| 1787.0 | -10 |
| 1788.0 | -9 |
| 1789.0 | -8 |
| 1790.0 | -7 |
| 1791.0 | -8 |
| 1792.0 | -9 |
| 1793.0 | -8 |
| 1794.0 | -9 |
| 1795.0 | -8 |
| 1796.0 | -9 |
| 1797.0 | -8 |
| 1798.0 | -9 |
| 1799.0 | -10 |
| 1800.0 | -11 |
| 1801.0 | -12 |
| 1802.0 | -11 |
| 1803.0 | -12 |
| 1804.0 | -11 |
| 1805.0 | -10 |
| 1806.0 | -9 |
| 1807.0 | -10 |
| 1808.0 | -9 |
| 1809.0 | -10 |
| 1810.0 | -11 |
| 1811.0 | -10 |
| 1812.0 | -11 |
| 1813.0 | -12 |
| 1814.0 | -11 |
| 1815.0 | -10 |
| 1816.0 | -9 |
| 1817.0 | -8 |
| 1818.0 | -7 |
| 1819.0 | -6 |
| 1820.0 | -5 |
| 1821.0 | -6 |
| 1822.0 | -7 |
| 1823.0 | -6 |
| 1824.0 | -5 |
| 1825.0 | -6 |
| 1826.0 | -5 |
| 1827.0 | -4 |
| 1828.0 | -5 |
| 1829.0 | -4 |
| 1830.0 | -5 |
| 1831.0 | -6 |
| 1832.0 | -5 |
| 1833.0 | -6 |
| 1834.0 | -5 |
| 1835.0 | -4 |
| 1836.0 | -3 |
| 1837.0 | -2 |
| 1838.0 | -1 |
| 1839.0 | 0 |
| 1840.0 | 1 |
| 1841.0 | 2 |
| 1842.0 | 1 |
| 1843.0 | 2 |
| 1844.0 | 3 |
| 1845.0 | 2 |
| 1846.0 | 1 |
| 1847.0 | 2 |
| 1848.0 | 1 |
| 1849.0 | 2 |
| 1850.0 | 3 |
| 1851.0 | 2 |
| 1852.0 | 1 |
| 1853.0 | 2 |
| 1854.0 | 3 |
| 1855.0 | 2 |
| 1856.0 | 1 |
| 1857.0 | 2 |
| 1858.0 | 3 |
| 1859.0 | 4 |
| 1860.0 | 5 |
| 1861.0 | 4 |
| 1862.0 | 3 |
| 1863.0 | 2 |
| 1864.0 | 1 |
| 1865.0 | 0 |
| 1866.0 | -1 |
| 1867.0 | 0 |
| 1868.0 | -1 |
| 1869.0 | -2 |
| 1870.0 | -1 |
| 1871.0 | 0 |
| 1872.0 | 1 |
| 1873.0 | 0 |
| 1874.0 | 1 |
| 1875.0 | 2 |
| 1876.0 | 1 |
| 1877.0 | 0 |
| 1878.0 | 1 |
| 1879.0 | 0 |
| 1880.0 | -1 |
| 1881.0 | 0 |
| 1882.0 | -1 |
| 1883.0 | -2 |
| 1884.0 | -3 |
| 1885.0 | -2 |
| 1886.0 | -1 |
| 1887.0 | -2 |
| 1888.0 | -1 |
| 1889.0 | 0 |
| 1890.0 | 1 |
| 1891.0 | 0 |
| 1892.0 | 1 |
| 1893.0 | 0 |
| 1894.0 | -1 |
| 1895.0 | 0 |
| 1896.0 | 1 |
| 1897.0 | 0 |
| 1898.0 | -1 |
| 1899.0 | 0 |
| 1900.0 | -1 |
| 1901.0 | -2 |
| 1902.0 | -3 |
| 1903.0 | -2 |
| 1904.0 | -3 |
| 1905.0 | -4 |
| 1906.0 | -3 |
| 1907.0 | -4 |
| 1908.0 | -5 |
| 1909.0 | -6 |
| 1910.0 | -5 |
| 1911.0 | -6 |
| 1912.0 | -7 |
| 1913.0 | -8 |
| 1914.0 | -7 |
| 1915.0 | -6 |
| 1916.0 | -5 |
| 1917.0 | -6 |
| 1918.0 | -5 |
| 1919.0 | -4 |
| 1920.0 | -3 |
| 1921.0 | -2 |
| 1922.0 | -1 |
| 1923.0 | 0 |
| 1924.0 | -1 |
| 1925.0 | -2 |
| 1926.0 | -1 |
| 1927.0 | -2 |
| 1928.0 | -1 |
| 1929.0 | 0 |
| 1930.0 | 1 |
| 1931.0 | 2 |
| 1932.0 | 1 |
| 1933.0 | 2 |
| 1934.0 | 3 |
| 1935.0 | 4 |
| 1936.0 | 3 |
| 1937.0 | 2 |
| 1938.0 | 3 |
| 1939.0 | 2 |
| 1940.0 | 3 |
| 1941.0 | 2 |
| 1942.0 | 1 |
| 1943.0 | 2 |
| 1944.0 | 3 |
| 1945.0 | 2 |
| 1946.0 | 3 |
| 1947.0 | 4 |
| 1948.0 | 5 |
| 1949.0 | 4 |
| 1950.0 | 3 |
| 1951.0 | 2 |
| 1952.0 | 1 |
| 1953.0 | 2 |
| 1954.0 | 3 |
| 1955.0 | 2 |
| 1956.0 | 3 |
| 1957.0 | 2 |
| 1958.0 | 1 |
| 1959.0 | 0 |
| 1960.0 | 1 |
| 1961.0 | 0 |
| 1962.0 | 1 |
| 1963.0 | 2 |
| 1964.0 | 1 |
| 1965.0 | 0 |
| 1966.0 | 1 |
| 1967.0 | 2 |
| 1968.0 | 1 |
| 1969.0 | 0 |
| 1970.0 | -1 |
| 1971.0 | -2 |
| 1972.0 | -3 |
| 1973.0 | -2 |
| 1974.0 | -3 |
| 1975.0 | -4 |
| 1976.0 | -3 |
| 1977.0 | -2 |
| 1978.0 | -1 |
| 1979.0 | -2 |
| 1980.0 | -3 |
| 1981.0 | -2 |
| 1982.0 | -3 |
| 1983.0 | -2 |
| 1984.0 | -3 |
| 1985.0 | -2 |
| 1986.0 | -3 |
| 1987.0 | -2 |
| 1988.0 | -3 |
| 1989.0 | -4 |
| 1990.0 | -3 |
| 1991.0 | -2 |
| 1992.0 | -1 |
| 1993.0 | -2 |
| 1994.0 | -3 |
| 1995.0 | -2 |
| 1996.0 | -3 |
| 1997.0 | -2 |
| 1998.0 | -1 |
| 1999.0 | -2 |
| 2000.0 | -1 |
| 2001.0 | -2 |
| 2002.0 | -3 |
| 2003.0 | -4 |
| 2004.0 | -5 |
| 2005.0 | -6 |
| 2006.0 | -5 |
| 2007.0 | -4 |
| 2008.0 | -3 |
| 2009.0 | -2 |
| 2010.0 | -1 |
| 2011.0 | 0 |
| 2012.0 | 1 |
| 2013.0 | 2 |
| 2014.0 | 1 |
| 2015.0 | 2 |
| 2016.0 | 3 |
| 2017.0 | 2 |
| 2018.0 | 1 |
| 2019.0 | 0 |
| 2020.0 | 1 |
| 2021.0 | 0 |
| 2022.0 | -1 |
| 2023.0 | -2 |
| 2024.0 | -3 |
| 2025.0 | -2 |
| 2026.0 | -3 |
| 2027.0 | -2 |
| 2028.0 | -1 |
| 2029.0 | -2 |
| 2030.0 | -1 |
| 2031.0 | 0 |
| 2032.0 | -1 |
| 2033.0 | -2 |
| 2034.0 | -3 |
| 2035.0 | -4 |
| 2036.0 | -3 |
| 2037.0 | -4 |
| 2038.0 | -3 |
| 2039.0 | -4 |
| 2040.0 | -5 |
| 2041.0 | -6 |
| 2042.0 | -5 |
| 2043.0 | -4 |
| 2044.0 | -5 |
| 2045.0 | -6 |
| 2046.0 | -7 |
| 2047.0 | -6 |
| 2048.0 | -5 |
| 2049.0 | -4 |
| 2050.0 | -5 |
| 2051.0 | -6 |
| 2052.0 | -5 |
| 2053.0 | -4 |
| 2054.0 | -3 |
| 2055.0 | -4 |
| 2056.0 | -3 |
| 2057.0 | -2 |
| 2058.0 | -1 |
| 2059.0 | -2 |
| 2060.0 | -1 |
| 2061.0 | 0 |
| 2062.0 | -1 |
| 2063.0 | 0 |
| 2064.0 | -1 |
| 2065.0 | -2 |
| 2066.0 | -1 |
| 2067.0 | -2 |
| 2068.0 | -1 |
| 2069.0 | 0 |
| 2070.0 | 1 |
| 2071.0 | 2 |
| 2072.0 | 1 |
| 2073.0 | 2 |
| 2074.0 | 3 |
| 2075.0 | 2 |
| 2076.0 | 1 |
| 2077.0 | 0 |
| 2078.0 | 1 |
| 2079.0 | 2 |
| 2080.0 | 3 |
| 2081.0 | 4 |
| 2082.0 | 3 |
| 2083.0 | 2 |
| 2084.0 | 1 |
| 2085.0 | 0 |
| 2086.0 | -1 |
| 2087.0 | -2 |
| 2088.0 | -1 |
| 2089.0 | -2 |
| 2090.0 | -1 |
| 2091.0 | 0 |
| 2092.0 | -1 |
| 2093.0 | -2 |
| 2094.0 | -3 |
| 2095.0 | -2 |
| 2096.0 | -3 |
| 2097.0 | -4 |
| 2098.0 | -5 |
| 2099.0 | -6 |
| 2100.0 | -7 |
| 2101.0 | -6 |
| 2102.0 | -5 |
| 2103.0 | -6 |
| 2104.0 | -5 |
| 2105.0 | -4 |
| 2106.0 | -5 |
| 2107.0 | -6 |
| 2108.0 | -7 |
| 2109.0 | -6 |
| 2110.0 | -5 |
| 2111.0 | -6 |
| 2112.0 | -7 |
| 2113.0 | -6 |
| 2114.0 | -7 |
| 2115.0 | -8 |
| 2116.0 | -9 |
| 2117.0 | -10 |
| 2118.0 | -11 |
| 2119.0 | -10 |
| 2120.0 | -9 |
| 2121.0 | -10 |
| 2122.0 | -9 |
| 2123.0 | -8 |
| 2124.0 | -9 |
| 2125.0 | -10 |
| 2126.0 | -9 |
| 2127.0 | -10 |
| 2128.0 | -11 |
| 2129.0 | -12 |
| 2130.0 | -13 |
| 2131.0 | -12 |
| 2132.0 | -11 |
| 2133.0 | -12 |
| 2134.0 | -13 |
| 2135.0 | -14 |
| 2136.0 | -13 |
| 2137.0 | -14 |
| 2138.0 | -13 |
| 2139.0 | -12 |
| 2140.0 | -13 |
| 2141.0 | -14 |
| 2142.0 | -13 |
| 2143.0 | -12 |
| 2144.0 | -13 |
| 2145.0 | -14 |
| 2146.0 | -15 |
| 2147.0 | -14 |
| 2148.0 | -15 |
| 2149.0 | -14 |
| 2150.0 | -13 |
| 2151.0 | -12 |
| 2152.0 | -11 |
| 2153.0 | -10 |
| 2154.0 | -11 |
| 2155.0 | -12 |
| 2156.0 | -11 |
| 2157.0 | -12 |
| 2158.0 | -11 |
| 2159.0 | -10 |
| 2160.0 | -9 |
| 2161.0 | -8 |
| 2162.0 | -9 |
| 2163.0 | -10 |
| 2164.0 | -9 |
| 2165.0 | -10 |
| 2166.0 | -9 |
| 2167.0 | -10 |
| 2168.0 | -9 |
| 2169.0 | -10 |
| 2170.0 | -9 |
| 2171.0 | -10 |
| 2172.0 | -9 |
| 2173.0 | -8 |
| 2174.0 | -7 |
| 2175.0 | -6 |
| 2176.0 | -5 |
| 2177.0 | -6 |
| 2178.0 | -5 |
| 2179.0 | -4 |
| 2180.0 | -5 |
| 2181.0 | -6 |
| 2182.0 | -5 |
| 2183.0 | -4 |
| 2184.0 | -5 |
| 2185.0 | -6 |
| 2186.0 | -7 |
| 2187.0 | -6 |
| 2188.0 | -5 |
| 2189.0 | -6 |
| 2190.0 | -7 |
| 2191.0 | -8 |
| 2192.0 | -7 |
| 2193.0 | -8 |
| 2194.0 | -7 |
| 2195.0 | -8 |
| 2196.0 | -9 |
| 2197.0 | -8 |
| 2198.0 | -9 |
| 2199.0 | -8 |
| 2200.0 | -9 |
| 2201.0 | -10 |
| 2202.0 | -9 |
| 2203.0 | -8 |
| 2204.0 | -7 |
| 2205.0 | -8 |
| 2206.0 | -7 |
| 2207.0 | -6 |
| 2208.0 | -5 |
| 2209.0 | -6 |
| 2210.0 | -5 |
| 2211.0 | -4 |
| 2212.0 | -5 |
| 2213.0 | -4 |
| 2214.0 | -5 |
| 2215.0 | -4 |
| 2216.0 | -3 |
| 2217.0 | -2 |
| 2218.0 | -1 |
| 2219.0 | 0 |
| 2220.0 | 1 |
| 2221.0 | 0 |
| 2222.0 | -1 |
| 2223.0 | -2 |
| 2224.0 | -1 |
| 2225.0 | -2 |
| 2226.0 | -3 |
| 2227.0 | -4 |
| 2228.0 | -5 |
| 2229.0 | -4 |
| 2230.0 | -5 |
| 2231.0 | -6 |
| 2232.0 | -5 |
| 2233.0 | -4 |
| 2234.0 | -3 |
| 2235.0 | -2 |
| 2236.0 | -1 |
| 2237.0 | -2 |
| 2238.0 | -1 |
| 2239.0 | -2 |
| 2240.0 | -3 |
| 2241.0 | -2 |
| 2242.0 | -3 |
| 2243.0 | -2 |
| 2244.0 | -1 |
| 2245.0 | -2 |
| 2246.0 | -1 |
| 2247.0 | -2 |
| 2248.0 | -3 |
| 2249.0 | -4 |
| 2250.0 | -5 |
| 2251.0 | -4 |
| 2252.0 | -5 |
| 2253.0 | -4 |
| 2254.0 | -3 |
| 2255.0 | -4 |
| 2256.0 | -3 |
| 2257.0 | -2 |
| 2258.0 | -1 |
| 2259.0 | -2 |
| 2260.0 | -3 |
| 2261.0 | -4 |
| 2262.0 | -3 |
| 2263.0 | -4 |
| 2264.0 | -3 |
| 2265.0 | -2 |
| 2266.0 | -3 |
| 2267.0 | -4 |
| 2268.0 | -3 |
| 2269.0 | -4 |
| 2270.0 | -3 |
| 2271.0 | -4 |
| 2272.0 | -3 |
| 2273.0 | -4 |
| 2274.0 | -3 |
| 2275.0 | -4 |
| 2276.0 | -5 |
| 2277.0 | -6 |
| 2278.0 | -5 |
| 2279.0 | -6 |
| 2280.0 | -5 |
| 2281.0 | -4 |
| 2282.0 | -5 |
| 2283.0 | -4 |
| 2284.0 | -5 |
| 2285.0 | -4 |
| 2286.0 | -3 |
| 2287.0 | -4 |
| 2288.0 | -5 |
| 2289.0 | -6 |
| 2290.0 | -7 |
| 2291.0 | -6 |
| 2292.0 | -7 |
| 2293.0 | -6 |
| 2294.0 | -7 |
| 2295.0 | -6 |
| 2296.0 | -7 |
| 2297.0 | -6 |
| 2298.0 | -5 |
| 2299.0 | -4 |
| 2300.0 | -5 |
| 2301.0 | -6 |
| 2302.0 | -7 |
| 2303.0 | -6 |
| 2304.0 | -7 |
| 2305.0 | -8 |
| 2306.0 | -7 |
| 2307.0 | -6 |
| 2308.0 | -7 |
| 2309.0 | -6 |
| 2310.0 | -5 |
| 2311.0 | -6 |
| 2312.0 | -7 |
| 2313.0 | -6 |
| 2314.0 | -5 |
| 2315.0 | -4 |
| 2316.0 | -3 |
| 2317.0 | -2 |
| 2318.0 | -3 |
| 2319.0 | -4 |
| 2320.0 | -5 |
| 2321.0 | -6 |
| 2322.0 | -5 |
| 2323.0 | -4 |
| 2324.0 | -3 |
| 2325.0 | -2 |
| 2326.0 | -1 |
| 2327.0 | 0 |
| 2328.0 | 1 |
| 2329.0 | 2 |
| 2330.0 | 3 |
| 2331.0 | 4 |
| 2332.0 | 3 |
| 2333.0 | 4 |
| 2334.0 | 3 |
| 2335.0 | 4 |
| 2336.0 | 3 |
| 2337.0 | 4 |
| 2338.0 | 5 |
| 2339.0 | 4 |
| 2340.0 | 5 |
| 2341.0 | 4 |
| 2342.0 | 5 |
| 2343.0 | 6 |
| 2344.0 | 7 |
| 2345.0 | 6 |
| 2346.0 | 5 |
| 2347.0 | 6 |
| 2348.0 | 5 |
| 2349.0 | 6 |
| 2350.0 | 5 |
| 2351.0 | 4 |
| 2352.0 | 3 |
| 2353.0 | 4 |
| 2354.0 | 5 |
| 2355.0 | 6 |
| 2356.0 | 5 |
| 2357.0 | 6 |
| 2358.0 | 7 |
| 2359.0 | 6 |
| 2360.0 | 5 |
| 2361.0 | 6 |
| 2362.0 | 7 |
| 2363.0 | 6 |
| 2364.0 | 7 |
| 2365.0 | 8 |
| 2366.0 | 9 |
| 2367.0 | 10 |
| 2368.0 | 9 |
| 2369.0 | 10 |
| 2370.0 | 11 |
| 2371.0 | 10 |
| 2372.0 | 9 |
| 2373.0 | 8 |
| 2374.0 | 9 |
| 2375.0 | 10 |
| 2376.0 | 9 |
| 2377.0 | 8 |
| 2378.0 | 7 |
| 2379.0 | 6 |
| 2380.0 | 7 |
| 2381.0 | 8 |
| 2382.0 | 9 |
| 2383.0 | 8 |
| 2384.0 | 7 |
| 2385.0 | 8 |
| 2386.0 | 9 |
| 2387.0 | 10 |
| 2388.0 | 9 |
| 2389.0 | 8 |
| 2390.0 | 7 |
| 2391.0 | 8 |
| 2392.0 | 7 |
| 2393.0 | 8 |
| 2394.0 | 9 |
| 2395.0 | 10 |
| 2396.0 | 11 |
| 2397.0 | 10 |
| 2398.0 | 11 |
| 2399.0 | 12 |
| 2400.0 | 13 |
| 2401.0 | 12 |
| 2402.0 | 11 |
| 2403.0 | 10 |
| 2404.0 | 11 |
| 2405.0 | 10 |
| 2406.0 | 11 |
| 2407.0 | 12 |
| 2408.0 | 13 |
| 2409.0 | 14 |
| 2410.0 | 13 |
| 2411.0 | 14 |
| 2412.0 | 15 |
| 2413.0 | 14 |
| 2414.0 | 13 |
| 2415.0 | 14 |
| 2416.0 | 15 |
| 2417.0 | 16 |
| 2418.0 | 15 |
| 2419.0 | 16 |
| 2420.0 | 17 |
| 2421.0 | 16 |
| 2422.0 | 17 |
| 2423.0 | 18 |
| 2424.0 | 17 |
| 2425.0 | 18 |
| 2426.0 | 19 |
| 2427.0 | 20 |
| 2428.0 | 21 |
| 2429.0 | 22 |
| 2430.0 | 21 |
| 2431.0 | 22 |
| 2432.0 | 21 |
| 2433.0 | 20 |
| 2434.0 | 19 |
| 2435.0 | 20 |
| 2436.0 | 21 |
| 2437.0 | 22 |
| 2438.0 | 23 |
| 2439.0 | 24 |
| 2440.0 | 23 |
| 2441.0 | 24 |
| 2442.0 | 23 |
| 2443.0 | 24 |
| 2444.0 | 23 |
| 2445.0 | 24 |
| 2446.0 | 23 |
| 2447.0 | 22 |
| 2448.0 | 23 |
| 2449.0 | 24 |
| 2450.0 | 25 |
| 2451.0 | 24 |
| 2452.0 | 25 |
| 2453.0 | 26 |
| 2454.0 | 27 |
| 2455.0 | 26 |
| 2456.0 | 27 |
| 2457.0 | 26 |
| 2458.0 | 25 |
| 2459.0 | 26 |
| 2460.0 | 27 |
| 2461.0 | 26 |
| 2462.0 | 25 |
| 2463.0 | 24 |
| 2464.0 | 25 |
| 2465.0 | 26 |
| 2466.0 | 27 |
| 2467.0 | 26 |
| 2468.0 | 25 |
| 2469.0 | 24 |
| 2470.0 | 25 |
| 2471.0 | 24 |
| 2472.0 | 25 |
| 2473.0 | 24 |
| 2474.0 | 23 |
| 2475.0 | 24 |
| 2476.0 | 25 |
| 2477.0 | 26 |
| 2478.0 | 27 |
| 2479.0 | 26 |
| 2480.0 | 25 |
| 2481.0 | 24 |
| 2482.0 | 23 |
| 2483.0 | 22 |
| 2484.0 | 21 |
| 2485.0 | 20 |
| 2486.0 | 19 |
| 2487.0 | 20 |
| 2488.0 | 19 |
| 2489.0 | 18 |
| 2490.0 | 17 |
| 2491.0 | 18 |
| 2492.0 | 19 |
| 2493.0 | 18 |
| 2494.0 | 19 |
| 2495.0 | 20 |
| 2496.0 | 21 |
| 2497.0 | 20 |
| 2498.0 | 21 |
| 2499.0 | 22 |
| 2500.0 | 21 |
| 2501.0 | 20 |
| 2502.0 | 19 |
| 2503.0 | 18 |
| 2504.0 | 17 |
| 2505.0 | 16 |
| 2506.0 | 17 |
| 2507.0 | 18 |
| 2508.0 | 17 |
| 2509.0 | 16 |
| 2510.0 | 17 |
| 2511.0 | 16 |
| 2512.0 | 17 |
| 2513.0 | 18 |
| 2514.0 | 17 |
| 2515.0 | 18 |
| 2516.0 | 19 |
| 2517.0 | 18 |
| 2518.0 | 17 |
| 2519.0 | 18 |
| 2520.0 | 17 |
| 2521.0 | 16 |
| 2522.0 | 15 |
| 2523.0 | 14 |
| 2524.0 | 15 |
| 2525.0 | 16 |
| 2526.0 | 17 |
| 2527.0 | 18 |
| 2528.0 | 17 |
| 2529.0 | 16 |
| 2530.0 | 17 |
| 2531.0 | 16 |
| 2532.0 | 15 |
| 2533.0 | 14 |
| 2534.0 | 15 |
| 2535.0 | 16 |
| 2536.0 | 17 |
| 2537.0 | 16 |
| 2538.0 | 15 |
| 2539.0 | 16 |
| 2540.0 | 15 |
| 2541.0 | 14 |
| 2542.0 | 13 |
| 2543.0 | 12 |
| 2544.0 | 13 |
| 2545.0 | 12 |
| 2546.0 | 11 |
| 2547.0 | 12 |
| 2548.0 | 11 |
| 2549.0 | 12 |
| 2550.0 | 13 |
| 2551.0 | 14 |
| 2552.0 | 13 |
| 2553.0 | 14 |
| 2554.0 | 15 |
| 2555.0 | 16 |
| 2556.0 | 17 |
| 2557.0 | 18 |
| 2558.0 | 19 |
| 2559.0 | 18 |
| 2560.0 | 17 |
| 2561.0 | 16 |
| 2562.0 | 17 |
| 2563.0 | 18 |
| 2564.0 | 19 |
| 2565.0 | 20 |
| 2566.0 | 21 |
| 2567.0 | 20 |
| 2568.0 | 21 |
| 2569.0 | 20 |
| 2570.0 | 21 |
| 2571.0 | 20 |
| 2572.0 | 19 |
| 2573.0 | 20 |
| 2574.0 | 21 |
| 2575.0 | 22 |
| 2576.0 | 23 |
| 2577.0 | 22 |
| 2578.0 | 23 |
| 2579.0 | 24 |
| 2580.0 | 23 |
| 2581.0 | 22 |
| 2582.0 | 23 |
| 2583.0 | 22 |
| 2584.0 | 21 |
| 2585.0 | 22 |
| 2586.0 | 21 |
| 2587.0 | 20 |
| 2588.0 | 21 |
| 2589.0 | 22 |
| 2590.0 | 23 |
| 2591.0 | 22 |
| 2592.0 | 21 |
| 2593.0 | 22 |
| 2594.0 | 21 |
| 2595.0 | 22 |
| 2596.0 | 21 |
| 2597.0 | 22 |
| 2598.0 | 23 |
| 2599.0 | 24 |
| 2600.0 | 25 |
| 2601.0 | 24 |
| 2602.0 | 23 |
| 2603.0 | 22 |
| 2604.0 | 21 |
| 2605.0 | 20 |
| 2606.0 | 19 |
| 2607.0 | 20 |
| 2608.0 | 19 |
| 2609.0 | 18 |
| 2610.0 | 17 |
| 2611.0 | 16 |
| 2612.0 | 15 |
| 2613.0 | 14 |
| 2614.0 | 13 |
| 2615.0 | 14 |
| 2616.0 | 15 |
| 2617.0 | 16 |
| 2618.0 | 15 |
| 2619.0 | 16 |
| 2620.0 | 17 |
| 2621.0 | 18 |
| 2622.0 | 19 |
| 2623.0 | 20 |
| 2624.0 | 19 |
| 2625.0 | 20 |
| 2626.0 | 21 |
| 2627.0 | 20 |
| 2628.0 | 19 |
| 2629.0 | 20 |
| 2630.0 | 19 |
| 2631.0 | 18 |
| 2632.0 | 17 |
| 2633.0 | 18 |
| 2634.0 | 17 |
| 2635.0 | 18 |
| 2636.0 | 19 |
| 2637.0 | 20 |
| 2638.0 | 19 |
| 2639.0 | 18 |
| 2640.0 | 17 |
| 2641.0 | 16 |
| 2642.0 | 15 |
| 2643.0 | 16 |
| 2644.0 | 17 |
| 2645.0 | 18 |
| 2646.0 | 17 |
| 2647.0 | 18 |
| 2648.0 | 19 |
| 2649.0 | 18 |
| 2650.0 | 17 |
| 2651.0 | 16 |
| 2652.0 | 17 |
| 2653.0 | 18 |
| 2654.0 | 17 |
| 2655.0 | 16 |
| 2656.0 | 17 |
| 2657.0 | 16 |
| 2658.0 | 17 |
| 2659.0 | 18 |
| 2660.0 | 17 |
| 2661.0 | 16 |
| 2662.0 | 15 |
| 2663.0 | 16 |
| 2664.0 | 15 |
| 2665.0 | 14 |
| 2666.0 | 15 |
| 2667.0 | 14 |
| 2668.0 | 15 |
| 2669.0 | 14 |
| 2670.0 | 13 |
| 2671.0 | 14 |
| 2672.0 | 15 |
| 2673.0 | 16 |
| 2674.0 | 15 |
| 2675.0 | 16 |
| 2676.0 | 17 |
| 2677.0 | 16 |
| 2678.0 | 17 |
| 2679.0 | 18 |
| 2680.0 | 19 |
| 2681.0 | 18 |
| 2682.0 | 17 |
| 2683.0 | 18 |
| 2684.0 | 17 |
| 2685.0 | 18 |
| 2686.0 | 19 |
| 2687.0 | 18 |
| 2688.0 | 17 |
| 2689.0 | 18 |
| 2690.0 | 19 |
| 2691.0 | 18 |
| 2692.0 | 19 |
| 2693.0 | 20 |
| 2694.0 | 19 |
| 2695.0 | 20 |
| 2696.0 | 21 |
| 2697.0 | 22 |
| 2698.0 | 23 |
| 2699.0 | 24 |
| 2700.0 | 25 |
| 2701.0 | 24 |
| 2702.0 | 23 |
| 2703.0 | 22 |
| 2704.0 | 23 |
| 2705.0 | 24 |
| 2706.0 | 25 |
| 2707.0 | 24 |
| 2708.0 | 25 |
| 2709.0 | 24 |
| 2710.0 | 23 |
| 2711.0 | 22 |
| 2712.0 | 21 |
| 2713.0 | 20 |
| 2714.0 | 19 |
| 2715.0 | 20 |
| 2716.0 | 21 |
| 2717.0 | 22 |
| 2718.0 | 21 |
| 2719.0 | 20 |
| 2720.0 | 21 |
| 2721.0 | 22 |
| 2722.0 | 23 |
| 2723.0 | 24 |
| 2724.0 | 23 |
| 2725.0 | 24 |
| 2726.0 | 23 |
| 2727.0 | 22 |
| 2728.0 | 21 |
| 2729.0 | 20 |
| 2730.0 | 19 |
| 2731.0 | 20 |
| 2732.0 | 19 |
| 2733.0 | 18 |
| 2734.0 | 17 |
| 2735.0 | 18 |
| 2736.0 | 19 |
| 2737.0 | 18 |
| 2738.0 | 19 |
| 2739.0 | 20 |
| 2740.0 | 21 |
| 2741.0 | 20 |
| 2742.0 | 19 |
| 2743.0 | 20 |
| 2744.0 | 21 |
| 2745.0 | 22 |
| 2746.0 | 21 |
| 2747.0 | 22 |
| 2748.0 | 21 |
| 2749.0 | 22 |
| 2750.0 | 21 |
| 2751.0 | 20 |
| 2752.0 | 19 |
| 2753.0 | 20 |
| 2754.0 | 21 |
| 2755.0 | 20 |
| 2756.0 | 19 |
| 2757.0 | 20 |
| 2758.0 | 19 |
| 2759.0 | 20 |
| 2760.0 | 19 |
| 2761.0 | 20 |
| 2762.0 | 19 |
| 2763.0 | 20 |
| 2764.0 | 19 |
| 2765.0 | 18 |
| 2766.0 | 17 |
| 2767.0 | 16 |
| 2768.0 | 17 |
| 2769.0 | 18 |
| 2770.0 | 19 |
| 2771.0 | 20 |
| 2772.0 | 21 |
| 2773.0 | 20 |
| 2774.0 | 21 |
| 2775.0 | 20 |
| 2776.0 | 21 |
| 2777.0 | 22 |
| 2778.0 | 23 |
| 2779.0 | 22 |
| 2780.0 | 21 |
| 2781.0 | 20 |
| 2782.0 | 21 |
| 2783.0 | 22 |
| 2784.0 | 21 |
| 2785.0 | 22 |
| 2786.0 | 23 |
| 2787.0 | 22 |
| 2788.0 | 23 |
| 2789.0 | 24 |
| 2790.0 | 25 |
| 2791.0 | 24 |
| 2792.0 | 23 |
| 2793.0 | 22 |
| 2794.0 | 21 |
| 2795.0 | 22 |
| 2796.0 | 23 |
| 2797.0 | 22 |
| 2798.0 | 21 |
| 2799.0 | 20 |
| 2800.0 | 21 |
| 2801.0 | 20 |
| 2802.0 | 21 |
| 2803.0 | 20 |
| 2804.0 | 19 |
| 2805.0 | 20 |
| 2806.0 | 21 |
| 2807.0 | 22 |
| 2808.0 | 21 |
| 2809.0 | 22 |
| 2810.0 | 21 |
| 2811.0 | 20 |
| 2812.0 | 19 |
| 2813.0 | 20 |
| 2814.0 | 21 |
| 2815.0 | 22 |
| 2816.0 | 21 |
| 2817.0 | 20 |
| 2818.0 | 19 |
| 2819.0 | 20 |
| 2820.0 | 19 |
| 2821.0 | 20 |
| 2822.0 | 21 |
| 2823.0 | 22 |
| 2824.0 | 23 |
| 2825.0 | 22 |
| 2826.0 | 23 |
| 2827.0 | 24 |
| 2828.0 | 25 |
| 2829.0 | 24 |
| 2830.0 | 25 |
| 2831.0 | 24 |
| 2832.0 | 23 |
| 2833.0 | 22 |
| 2834.0 | 23 |
| 2835.0 | 22 |
| 2836.0 | 23 |
| 2837.0 | 24 |
| 2838.0 | 23 |
| 2839.0 | 22 |
| 2840.0 | 21 |
| 2841.0 | 22 |
| 2842.0 | 21 |
| 2843.0 | 20 |
| 2844.0 | 21 |
| 2845.0 | 22 |
| 2846.0 | 21 |
| 2847.0 | 22 |
| 2848.0 | 23 |
| 2849.0 | 24 |
| 2850.0 | 25 |
| 2851.0 | 24 |
| 2852.0 | 23 |
| 2853.0 | 24 |
| 2854.0 | 25 |
| 2855.0 | 24 |
| 2856.0 | 25 |
| 2857.0 | 26 |
| 2858.0 | 25 |
| 2859.0 | 24 |
| 2860.0 | 25 |
| 2861.0 | 26 |
| 2862.0 | 25 |
| 2863.0 | 24 |
| 2864.0 | 25 |
| 2865.0 | 24 |
| 2866.0 | 23 |
| 2867.0 | 24 |
| 2868.0 | 25 |
| 2869.0 | 24 |
| 2870.0 | 23 |
| 2871.0 | 24 |
| 2872.0 | 25 |
| 2873.0 | 26 |
| 2874.0 | 27 |
| 2875.0 | 26 |
| 2876.0 | 27 |
| 2877.0 | 26 |
| 2878.0 | 27 |
| 2879.0 | 26 |
| 2880.0 | 25 |
| 2881.0 | 24 |
| 2882.0 | 23 |
| 2883.0 | 24 |
| 2884.0 | 23 |
| 2885.0 | 22 |
| 2886.0 | 21 |
| 2887.0 | 20 |
| 2888.0 | 21 |
| 2889.0 | 22 |
| 2890.0 | 21 |
| 2891.0 | 22 |
| 2892.0 | 21 |
| 2893.0 | 20 |
| 2894.0 | 19 |
| 2895.0 | 20 |
| 2896.0 | 19 |
| 2897.0 | 18 |
| 2898.0 | 19 |
| 2899.0 | 18 |
| 2900.0 | 19 |
| 2901.0 | 20 |
| 2902.0 | 19 |
| 2903.0 | 20 |
| 2904.0 | 21 |
| 2905.0 | 20 |
| 2906.0 | 19 |
| 2907.0 | 20 |
| 2908.0 | 21 |
| 2909.0 | 20 |
| 2910.0 | 21 |
| 2911.0 | 20 |
| 2912.0 | 21 |
| 2913.0 | 22 |
| 2914.0 | 21 |
| 2915.0 | 20 |
| 2916.0 | 21 |
| 2917.0 | 20 |
| 2918.0 | 21 |
| 2919.0 | 20 |
| 2920.0 | 21 |
| 2921.0 | 20 |
| 2922.0 | 21 |
| 2923.0 | 20 |
| 2924.0 | 19 |
| 2925.0 | 20 |
| 2926.0 | 21 |
| 2927.0 | 20 |
| 2928.0 | 21 |
| 2929.0 | 20 |
| 2930.0 | 21 |
| 2931.0 | 22 |
| 2932.0 | 23 |
| 2933.0 | 22 |
| 2934.0 | 23 |
| 2935.0 | 22 |
| 2936.0 | 21 |
| 2937.0 | 22 |
| 2938.0 | 21 |
| 2939.0 | 20 |
| 2940.0 | 21 |
| 2941.0 | 22 |
| 2942.0 | 23 |
| 2943.0 | 24 |
| 2944.0 | 23 |
| 2945.0 | 22 |
| 2946.0 | 23 |
| 2947.0 | 24 |
| 2948.0 | 23 |
| 2949.0 | 22 |
| 2950.0 | 23 |
| 2951.0 | 22 |
| 2952.0 | 23 |
| 2953.0 | 24 |
| 2954.0 | 23 |
| 2955.0 | 24 |
| 2956.0 | 23 |
| 2957.0 | 24 |
| 2958.0 | 23 |
| 2959.0 | 24 |
| 2960.0 | 23 |
| 2961.0 | 24 |
| 2962.0 | 25 |
| 2963.0 | 24 |
| 2964.0 | 25 |
| 2965.0 | 26 |
| 2966.0 | 25 |
| 2967.0 | 26 |
| 2968.0 | 27 |
| 2969.0 | 26 |
| 2970.0 | 25 |
| 2971.0 | 24 |
| 2972.0 | 25 |
| 2973.0 | 26 |
| 2974.0 | 27 |
| 2975.0 | 26 |
| 2976.0 | 25 |
| 2977.0 | 24 |
| 2978.0 | 25 |
| 2979.0 | 26 |
| 2980.0 | 25 |
| 2981.0 | 26 |
| 2982.0 | 27 |
| 2983.0 | 28 |
| 2984.0 | 27 |
| 2985.0 | 26 |
| 2986.0 | 25 |
| 2987.0 | 24 |
| 2988.0 | 23 |
| 2989.0 | 22 |
| 2990.0 | 21 |
| 2991.0 | 20 |
| 2992.0 | 21 |
| 2993.0 | 20 |
| 2994.0 | 19 |
| 2995.0 | 20 |
| 2996.0 | 19 |
| 2997.0 | 18 |
| 2998.0 | 17 |
| 2999.0 | 18 |
| 3000.0 | 17 |
| 3001.0 | 16 |
| 3002.0 | 17 |
| 3003.0 | 18 |
| 3004.0 | 17 |
| 3005.0 | 18 |
| 3006.0 | 19 |
| 3007.0 | 20 |
| 3008.0 | 19 |
| 3009.0 | 20 |
| 3010.0 | 19 |
| 3011.0 | 20 |
| 3012.0 | 19 |
| 3013.0 | 20 |
| 3014.0 | 21 |
| 3015.0 | 22 |
| 3016.0 | 23 |
| 3017.0 | 24 |
| 3018.0 | 23 |
| 3019.0 | 22 |
| 3020.0 | 21 |
| 3021.0 | 20 |
| 3022.0 | 19 |
| 3023.0 | 20 |
| 3024.0 | 19 |
| 3025.0 | 18 |
| 3026.0 | 17 |
| 3027.0 | 16 |
| 3028.0 | 15 |
| 3029.0 | 14 |
| 3030.0 | 15 |
| 3031.0 | 14 |
| 3032.0 | 15 |
| 3033.0 | 16 |
| 3034.0 | 17 |
| 3035.0 | 18 |
| 3036.0 | 17 |
| 3037.0 | 16 |
| 3038.0 | 17 |
| 3039.0 | 16 |
| 3040.0 | 15 |
| 3041.0 | 16 |
| 3042.0 | 15 |
| 3043.0 | 14 |
| 3044.0 | 15 |
| 3045.0 | 16 |
| 3046.0 | 17 |
| 3047.0 | 16 |
| 3048.0 | 17 |
| 3049.0 | 16 |
| 3050.0 | 17 |
| 3051.0 | 16 |
| 3052.0 | 15 |
| 3053.0 | 14 |
| 3054.0 | 13 |
| 3055.0 | 12 |
| 3056.0 | 13 |
| 3057.0 | 12 |
| 3058.0 | 11 |
| 3059.0 | 12 |
| 3060.0 | 11 |
| 3061.0 | 12 |
| 3062.0 | 11 |
| 3063.0 | 12 |
| 3064.0 | 13 |
| 3065.0 | 12 |
| 3066.0 | 11 |
| 3067.0 | 12 |
| 3068.0 | 13 |
| 3069.0 | 12 |
| 3070.0 | 11 |
| 3071.0 | 10 |
| 3072.0 | 11 |
| 3073.0 | 10 |
| 3074.0 | 11 |
| 3075.0 | 12 |
| 3076.0 | 13 |
| 3077.0 | 14 |
| 3078.0 | 13 |
| 3079.0 | 12 |
| 3080.0 | 11 |
| 3081.0 | 10 |
| 3082.0 | 11 |
| 3083.0 | 10 |
| 3084.0 | 11 |
| 3085.0 | 10 |
| 3086.0 | 9 |
| 3087.0 | 8 |
| 3088.0 | 7 |
| 3089.0 | 6 |
| 3090.0 | 7 |
| 3091.0 | 6 |
| 3092.0 | 7 |
| 3093.0 | 8 |
| 3094.0 | 9 |
| 3095.0 | 10 |
| 3096.0 | 11 |
| 3097.0 | 10 |
| 3098.0 | 9 |
| 3099.0 | 10 |
| 3100.0 | 9 |
| 3101.0 | 10 |
| 3102.0 | 11 |
| 3103.0 | 12 |
| 3104.0 | 13 |
| 3105.0 | 14 |
| 3106.0 | 15 |
| 3107.0 | 14 |
| 3108.0 | 13 |
| 3109.0 | 14 |
| 3110.0 | 15 |
| 3111.0 | 14 |
| 3112.0 | 15 |
| 3113.0 | 14 |
| 3114.0 | 15 |
| 3115.0 | 16 |
| 3116.0 | 15 |
| 3117.0 | 14 |
| 3118.0 | 13 |
| 3119.0 | 14 |
| 3120.0 | 13 |
| 3121.0 | 12 |
| 3122.0 | 13 |
| 3123.0 | 12 |
| 3124.0 | 11 |
| 3125.0 | 10 |
| 3126.0 | 9 |
| 3127.0 | 10 |
| 3128.0 | 11 |
| 3129.0 | 10 |
| 3130.0 | 11 |
| 3131.0 | 10 |
| 3132.0 | 9 |
| 3133.0 | 8 |
| 3134.0 | 9 |
| 3135.0 | 10 |
| 3136.0 | 9 |
| 3137.0 | 10 |
| 3138.0 | 9 |
| 3139.0 | 10 |
| 3140.0 | 9 |
| 3141.0 | 10 |
| 3142.0 | 11 |
| 3143.0 | 12 |
| 3144.0 | 13 |
| 3145.0 | 12 |
| 3146.0 | 11 |
| 3147.0 | 10 |
| 3148.0 | 11 |
| 3149.0 | 10 |
| 3150.0 | 9 |
| 3151.0 | 10 |
| 3152.0 | 9 |
| 3153.0 | 8 |
| 3154.0 | 9 |
| 3155.0 | 8 |
| 3156.0 | 9 |
| 3157.0 | 8 |
| 3158.0 | 7 |
| 3159.0 | 6 |
| 3160.0 | 7 |
| 3161.0 | 8 |
| 3162.0 | 9 |
| 3163.0 | 8 |
| 3164.0 | 9 |
| 3165.0 | 10 |
| 3166.0 | 11 |
| 3167.0 | 12 |
| 3168.0 | 11 |
| 3169.0 | 10 |
| 3170.0 | 11 |
| 3171.0 | 12 |
| 3172.0 | 13 |
| 3173.0 | 14 |
| 3174.0 | 13 |
| 3175.0 | 12 |
| 3176.0 | 13 |
| 3177.0 | 14 |
| 3178.0 | 13 |
| 3179.0 | 14 |
| 3180.0 | 13 |
| 3181.0 | 12 |
| 3182.0 | 11 |
| 3183.0 | 12 |
| 3184.0 | 13 |
| 3185.0 | 14 |
| 3186.0 | 15 |
| 3187.0 | 14 |
| 3188.0 | 13 |
| 3189.0 | 12 |
| 3190.0 | 11 |
| 3191.0 | 12 |
| 3192.0 | 13 |
| 3193.0 | 14 |
| 3194.0 | 15 |
| 3195.0 | 14 |
| 3196.0 | 13 |
| 3197.0 | 12 |
| 3198.0 | 13 |
| 3199.0 | 12 |
| 3200.0 | 13 |
| 3201.0 | 12 |
| 3202.0 | 11 |
| 3203.0 | 12 |
| 3204.0 | 13 |
| 3205.0 | 12 |
| 3206.0 | 13 |
| 3207.0 | 14 |
| 3208.0 | 13 |
| 3209.0 | 12 |
| 3210.0 | 13 |
| 3211.0 | 12 |
| 3212.0 | 13 |
| 3213.0 | 14 |
| 3214.0 | 15 |
| 3215.0 | 14 |
| 3216.0 | 13 |
| 3217.0 | 14 |
| 3218.0 | 13 |
| 3219.0 | 12 |
| 3220.0 | 11 |
| 3221.0 | 10 |
| 3222.0 | 9 |
| 3223.0 | 8 |
| 3224.0 | 7 |
| 3225.0 | 8 |
| 3226.0 | 9 |
| 3227.0 | 10 |
| 3228.0 | 9 |
| 3229.0 | 10 |
| 3230.0 | 9 |
| 3231.0 | 8 |
| 3232.0 | 9 |
| 3233.0 | 8 |
| 3234.0 | 9 |
| 3235.0 | 8 |
| 3236.0 | 9 |
| 3237.0 | 10 |
| 3238.0 | 9 |
| 3239.0 | 8 |
| 3240.0 | 9 |
| 3241.0 | 10 |
| 3242.0 | 11 |
| 3243.0 | 10 |
| 3244.0 | 9 |
| 3245.0 | 10 |
| 3246.0 | 11 |
| 3247.0 | 12 |
| 3248.0 | 11 |
| 3249.0 | 10 |
| 3250.0 | 9 |
| 3251.0 | 8 |
| 3252.0 | 9 |
| 3253.0 | 8 |
| 3254.0 | 9 |
| 3255.0 | 10 |
| 3256.0 | 11 |
| 3257.0 | 10 |
| 3258.0 | 11 |
| 3259.0 | 12 |
| 3260.0 | 13 |
| 3261.0 | 12 |
| 3262.0 | 13 |
| 3263.0 | 14 |
| 3264.0 | 15 |
| 3265.0 | 14 |
| 3266.0 | 13 |
| 3267.0 | 12 |
| 3268.0 | 13 |
| 3269.0 | 12 |
| 3270.0 | 13 |
| 3271.0 | 12 |
| 3272.0 | 11 |
| 3273.0 | 12 |
| 3274.0 | 13 |
| 3275.0 | 14 |
| 3276.0 | 13 |
| 3277.0 | 14 |
| 3278.0 | 13 |
| 3279.0 | 12 |
| 3280.0 | 11 |
| 3281.0 | 12 |
| 3282.0 | 13 |
| 3283.0 | 14 |
| 3284.0 | 15 |
| 3285.0 | 16 |
| 3286.0 | 15 |
| 3287.0 | 16 |
| 3288.0 | 15 |
| 3289.0 | 14 |
| 3290.0 | 15 |
| 3291.0 | 16 |
| 3292.0 | 17 |
| 3293.0 | 16 |
| 3294.0 | 15 |
| 3295.0 | 14 |
| 3296.0 | 13 |
| 3297.0 | 14 |
| 3298.0 | 15 |
| 3299.0 | 16 |
| 3300.0 | 17 |
| 3301.0 | 16 |
| 3302.0 | 15 |
| 3303.0 | 16 |
| 3304.0 | 15 |
| 3305.0 | 14 |
| 3306.0 | 13 |
| 3307.0 | 12 |
| 3308.0 | 11 |
| 3309.0 | 10 |
| 3310.0 | 9 |
| 3311.0 | 10 |
| 3312.0 | 9 |
| 3313.0 | 10 |
| 3314.0 | 9 |
| 3315.0 | 10 |
| 3316.0 | 9 |
| 3317.0 | 10 |
| 3318.0 | 9 |
| 3319.0 | 10 |
| 3320.0 | 9 |
| 3321.0 | 10 |
| 3322.0 | 9 |
| 3323.0 | 10 |
| 3324.0 | 9 |
| 3325.0 | 10 |
| 3326.0 | 9 |
| 3327.0 | 10 |
| 3328.0 | 9 |
| 3329.0 | 8 |
| 3330.0 | 9 |
| 3331.0 | 10 |
| 3332.0 | 9 |
| 3333.0 | 8 |
| 3334.0 | 7 |
| 3335.0 | 6 |
| 3336.0 | 7 |
| 3337.0 | 6 |
| 3338.0 | 5 |
| 3339.0 | 6 |
| 3340.0 | 5 |
| 3341.0 | 6 |
| 3342.0 | 5 |
| 3343.0 | 4 |
| 3344.0 | 5 |
| 3345.0 | 6 |
| 3346.0 | 5 |
| 3347.0 | 6 |
| 3348.0 | 7 |
| 3349.0 | 8 |
| 3350.0 | 9 |
| 3351.0 | 10 |
| 3352.0 | 11 |
| 3353.0 | 10 |
| 3354.0 | 9 |
| 3355.0 | 8 |
| 3356.0 | 7 |
| 3357.0 | 8 |
| 3358.0 | 7 |
| 3359.0 | 8 |
| 3360.0 | 9 |
| 3361.0 | 8 |
| 3362.0 | 7 |
| 3363.0 | 8 |
| 3364.0 | 9 |
| 3365.0 | 8 |
| 3366.0 | 7 |
| 3367.0 | 8 |
| 3368.0 | 9 |
| 3369.0 | 10 |
| 3370.0 | 9 |
| 3371.0 | 10 |
| 3372.0 | 11 |
| 3373.0 | 10 |
| 3374.0 | 9 |
| 3375.0 | 10 |
| 3376.0 | 9 |
| 3377.0 | 8 |
| 3378.0 | 9 |
| 3379.0 | 8 |
| 3380.0 | 9 |
| 3381.0 | 8 |
| 3382.0 | 7 |
| 3383.0 | 6 |
| 3384.0 | 5 |
| 3385.0 | 6 |
| 3386.0 | 7 |
| 3387.0 | 8 |
| 3388.0 | 7 |
| 3389.0 | 6 |
| 3390.0 | 7 |
| 3391.0 | 6 |
| 3392.0 | 7 |
| 3393.0 | 8 |
| 3394.0 | 7 |
| 3395.0 | 6 |
| 3396.0 | 5 |
| 3397.0 | 6 |
| 3398.0 | 7 |
| 3399.0 | 8 |
| 3400.0 | 7 |
| 3401.0 | 8 |
| 3402.0 | 7 |
| 3403.0 | 8 |
| 3404.0 | 7 |
| 3405.0 | 8 |
| 3406.0 | 7 |
| 3407.0 | 8 |
| 3408.0 | 7 |
| 3409.0 | 8 |
| 3410.0 | 9 |
| 3411.0 | 8 |
| 3412.0 | 9 |
| 3413.0 | 10 |
| 3414.0 | 9 |
| 3415.0 | 8 |
| 3416.0 | 7 |
| 3417.0 | 8 |
| 3418.0 | 9 |
| 3419.0 | 8 |
| 3420.0 | 7 |
| 3421.0 | 6 |
| 3422.0 | 7 |
| 3423.0 | 6 |
| 3424.0 | 7 |
| 3425.0 | 8 |
| 3426.0 | 9 |
| 3427.0 | 8 |
| 3428.0 | 7 |
| 3429.0 | 6 |
| 3430.0 | 5 |
| 3431.0 | 4 |
| 3432.0 | 5 |
| 3433.0 | 6 |
| 3434.0 | 7 |
| 3435.0 | 8 |
| 3436.0 | 9 |
| 3437.0 | 8 |
| 3438.0 | 9 |
| 3439.0 | 8 |
| 3440.0 | 7 |
| 3441.0 | 8 |
| 3442.0 | 9 |
| 3443.0 | 8 |
| 3444.0 | 7 |
| 3445.0 | 8 |
| 3446.0 | 9 |
| 3447.0 | 10 |
| 3448.0 | 9 |
| 3449.0 | 8 |
| 3450.0 | 7 |
| 3451.0 | 6 |
| 3452.0 | 5 |
| 3453.0 | 4 |
| 3454.0 | 3 |
| 3455.0 | 2 |
| 3456.0 | 1 |
| 3457.0 | 2 |
| 3458.0 | 1 |
| 3459.0 | 2 |
| 3460.0 | 1 |
| 3461.0 | 2 |
| 3462.0 | 1 |
| 3463.0 | 0 |
| 3464.0 | -1 |
| 3465.0 | -2 |
| 3466.0 | -1 |
| 3467.0 | 0 |
| 3468.0 | -1 |
| 3469.0 | -2 |
| 3470.0 | -3 |
| 3471.0 | -2 |
| 3472.0 | -3 |
| 3473.0 | -4 |
| 3474.0 | -3 |
| 3475.0 | -4 |
| 3476.0 | -3 |
| 3477.0 | -2 |
| 3478.0 | -3 |
| 3479.0 | -2 |
| 3480.0 | -1 |
| 3481.0 | 0 |
| 3482.0 | 1 |
| 3483.0 | 0 |
| 3484.0 | 1 |
| 3485.0 | 2 |
| 3486.0 | 1 |
| 3487.0 | 0 |
| 3488.0 | 1 |
| 3489.0 | 0 |
| 3490.0 | 1 |
| 3491.0 | 0 |
| 3492.0 | -1 |
| 3493.0 | 0 |
| 3494.0 | 1 |
| 3495.0 | 2 |
| 3496.0 | 3 |
| 3497.0 | 2 |
| 3498.0 | 3 |
| 3499.0 | 4 |
| 3500.0 | 5 |
| 3501.0 | 6 |
| 3502.0 | 7 |
| 3503.0 | 6 |
| 3504.0 | 5 |
| 3505.0 | 4 |
| 3506.0 | 3 |
| 3507.0 | 2 |
| 3508.0 | 3 |
| 3509.0 | 2 |
| 3510.0 | 3 |
| 3511.0 | 4 |
| 3512.0 | 5 |
| 3513.0 | 6 |
| 3514.0 | 7 |
| 3515.0 | 6 |
| 3516.0 | 5 |
| 3517.0 | 6 |
| 3518.0 | 5 |
| 3519.0 | 4 |
| 3520.0 | 5 |
| 3521.0 | 4 |
| 3522.0 | 3 |
| 3523.0 | 2 |
| 3524.0 | 3 |
| 3525.0 | 4 |
| 3526.0 | 3 |
| 3527.0 | 4 |
| 3528.0 | 3 |
| 3529.0 | 4 |
| 3530.0 | 3 |
| 3531.0 | 4 |
| 3532.0 | 3 |
| 3533.0 | 4 |
| 3534.0 | 3 |
| 3535.0 | 2 |
| 3536.0 | 1 |
| 3537.0 | 0 |
| 3538.0 | 1 |
| 3539.0 | 0 |
| 3540.0 | 1 |
| 3541.0 | 2 |
| 3542.0 | 3 |
| 3543.0 | 4 |
| 3544.0 | 3 |
| 3545.0 | 2 |
| 3546.0 | 1 |
| 3547.0 | 0 |
| 3548.0 | -1 |
| 3549.0 | 0 |
| 3550.0 | -1 |
| 3551.0 | -2 |
| 3552.0 | -3 |
| 3553.0 | -2 |
| 3554.0 | -3 |
| 3555.0 | -4 |
| 3556.0 | -5 |
| 3557.0 | -6 |
| 3558.0 | -7 |
| 3559.0 | -8 |
| 3560.0 | -7 |
| 3561.0 | -6 |
| 3562.0 | -5 |
| 3563.0 | -4 |
| 3564.0 | -5 |
| 3565.0 | -4 |
| 3566.0 | -3 |
| 3567.0 | -2 |
| 3568.0 | -1 |
| 3569.0 | -2 |
| 3570.0 | -1 |
| 3571.0 | 0 |
| 3572.0 | -1 |
| 3573.0 | -2 |
| 3574.0 | -1 |
| 3575.0 | -2 |
| 3576.0 | -1 |
| 3577.0 | -2 |
| 3578.0 | -1 |
| 3579.0 | -2 |
| 3580.0 | -1 |
| 3581.0 | 0 |
| 3582.0 | 1 |
| 3583.0 | 0 |
| 3584.0 | 1 |
| 3585.0 | 2 |
| 3586.0 | 3 |
| 3587.0 | 4 |
| 3588.0 | 5 |
| 3589.0 | 6 |
| 3590.0 | 7 |
| 3591.0 | 6 |
| 3592.0 | 7 |
| 3593.0 | 8 |
| 3594.0 | 7 |
| 3595.0 | 6 |
| 3596.0 | 5 |
| 3597.0 | 4 |
| 3598.0 | 3 |
| 3599.0 | 2 |
| 3600.0 | 1 |
| 3601.0 | 0 |
| 3602.0 | 1 |
| 3603.0 | 2 |
| 3604.0 | 1 |
| 3605.0 | 0 |
| 3606.0 | 1 |
| 3607.0 | 0 |
| 3608.0 | 1 |
| 3609.0 | 2 |
| 3610.0 | 3 |
| 3611.0 | 4 |
| 3612.0 | 5 |
| 3613.0 | 4 |
| 3614.0 | 5 |
| 3615.0 | 4 |
| 3616.0 | 3 |
| 3617.0 | 4 |
| 3618.0 | 3 |
| 3619.0 | 4 |
| 3620.0 | 3 |
| 3621.0 | 2 |
| 3622.0 | 1 |
| 3623.0 | 0 |
| 3624.0 | 1 |
| 3625.0 | 0 |
| 3626.0 | -1 |
| 3627.0 | -2 |
| 3628.0 | -1 |
| 3629.0 | -2 |
| 3630.0 | -1 |
| 3631.0 | 0 |
| 3632.0 | -1 |
| 3633.0 | -2 |
| 3634.0 | -1 |
| 3635.0 | -2 |
| 3636.0 | -1 |
| 3637.0 | 0 |
| 3638.0 | -1 |
| 3639.0 | -2 |
| 3640.0 | -1 |
| 3641.0 | 0 |
| 3642.0 | 1 |
| 3643.0 | 0 |
| 3644.0 | 1 |
| 3645.0 | 0 |
| 3646.0 | 1 |
| 3647.0 | 0 |
| 3648.0 | 1 |
| 3649.0 | 2 |
| 3650.0 | 1 |
| 3651.0 | 0 |
| 3652.0 | -1 |
| 3653.0 | 0 |
| 3654.0 | -1 |
| 3655.0 | -2 |
| 3656.0 | -1 |
| 3657.0 | -2 |
| 3658.0 | -1 |
| 3659.0 | -2 |
| 3660.0 | -1 |
| 3661.0 | -2 |
| 3662.0 | -3 |
| 3663.0 | -4 |
| 3664.0 | -3 |
| 3665.0 | -4 |
| 3666.0 | -5 |
| 3667.0 | -4 |
| 3668.0 | -3 |
| 3669.0 | -2 |
| 3670.0 | -1 |
| 3671.0 | 0 |
| 3672.0 | 1 |
| 3673.0 | 2 |
| 3674.0 | 3 |
| 3675.0 | 4 |
| 3676.0 | 3 |
| 3677.0 | 2 |
| 3678.0 | 1 |
| 3679.0 | 2 |
| 3680.0 | 3 |
| 3681.0 | 4 |
| 3682.0 | 3 |
| 3683.0 | 4 |
| 3684.0 | 5 |
| 3685.0 | 4 |
| 3686.0 | 5 |
| 3687.0 | 4 |
| 3688.0 | 5 |
| 3689.0 | 6 |
| 3690.0 | 5 |
| 3691.0 | 6 |
| 3692.0 | 7 |
| 3693.0 | 8 |
| 3694.0 | 9 |
| 3695.0 | 8 |
| 3696.0 | 7 |
| 3697.0 | 8 |
| 3698.0 | 9 |
| 3699.0 | 8 |
| 3700.0 | 7 |
| 3701.0 | 8 |
| 3702.0 | 7 |
| 3703.0 | 8 |
| 3704.0 | 9 |
| 3705.0 | 8 |
| 3706.0 | 7 |
| 3707.0 | 8 |
| 3708.0 | 7 |
| 3709.0 | 8 |
| 3710.0 | 7 |
| 3711.0 | 8 |
| 3712.0 | 7 |
| 3713.0 | 8 |
| 3714.0 | 9 |
| 3715.0 | 10 |
| 3716.0 | 11 |
| 3717.0 | 12 |
| 3718.0 | 11 |
| 3719.0 | 10 |
| 3720.0 | 9 |
| 3721.0 | 10 |
| 3722.0 | 11 |
| 3723.0 | 10 |
| 3724.0 | 9 |
| 3725.0 | 10 |
| 3726.0 | 11 |
| 3727.0 | 12 |
| 3728.0 | 13 |
| 3729.0 | 12 |
| 3730.0 | 13 |
| 3731.0 | 14 |
| 3732.0 | 13 |
| 3733.0 | 14 |
| 3734.0 | 15 |
| 3735.0 | 14 |
| 3736.0 | 15 |
| 3737.0 | 14 |
| 3738.0 | 13 |
| 3739.0 | 14 |
| 3740.0 | 15 |
| 3741.0 | 14 |
| 3742.0 | 15 |
| 3743.0 | 14 |
| 3744.0 | 13 |
| 3745.0 | 14 |
| 3746.0 | 13 |
| 3747.0 | 12 |
| 3748.0 | 11 |
| 3749.0 | 10 |
| 3750.0 | 11 |
| 3751.0 | 12 |
| 3752.0 | 11 |
| 3753.0 | 12 |
| 3754.0 | 13 |
| 3755.0 | 14 |
| 3756.0 | 15 |
| 3757.0 | 16 |
| 3758.0 | 17 |
| 3759.0 | 18 |
| 3760.0 | 19 |
| 3761.0 | 18 |
| 3762.0 | 17 |
| 3763.0 | 16 |
| 3764.0 | 17 |
| 3765.0 | 18 |
| 3766.0 | 19 |
| 3767.0 | 20 |
| 3768.0 | 21 |
| 3769.0 | 22 |
| 3770.0 | 21 |
| 3771.0 | 22 |
| 3772.0 | 21 |
| 3773.0 | 22 |
| 3774.0 | 23 |
| 3775.0 | 22 |
| 3776.0 | 23 |
| 3777.0 | 24 |
| 3778.0 | 23 |
| 3779.0 | 22 |
| 3780.0 | 23 |
| 3781.0 | 24 |
| 3782.0 | 25 |
| 3783.0 | 26 |
| 3784.0 | 25 |
| 3785.0 | 24 |
| 3786.0 | 23 |
| 3787.0 | 24 |
| 3788.0 | 23 |
| 3789.0 | 22 |
| 3790.0 | 23 |
| 3791.0 | 24 |
| 3792.0 | 25 |
| 3793.0 | 26 |
| 3794.0 | 25 |
| 3795.0 | 26 |
| 3796.0 | 25 |
| 3797.0 | 26 |
| 3798.0 | 27 |
| 3799.0 | 26 |
| 3800.0 | 25 |
| 3801.0 | 26 |
| 3802.0 | 25 |
| 3803.0 | 24 |
| 3804.0 | 23 |
| 3805.0 | 24 |
| 3806.0 | 23 |
| 3807.0 | 22 |
| 3808.0 | 23 |
| 3809.0 | 24 |
| 3810.0 | 25 |
| 3811.0 | 24 |
| 3812.0 | 25 |
| 3813.0 | 26 |
| 3814.0 | 27 |
| 3815.0 | 28 |
| 3816.0 | 29 |
| 3817.0 | 28 |
| 3818.0 | 27 |
| 3819.0 | 26 |
| 3820.0 | 27 |
| 3821.0 | 28 |
| 3822.0 | 27 |
| 3823.0 | 28 |
| 3824.0 | 27 |
| 3825.0 | 26 |
| 3826.0 | 27 |
| 3827.0 | 26 |
| 3828.0 | 27 |
| 3829.0 | 26 |
| 3830.0 | 25 |
| 3831.0 | 26 |
| 3832.0 | 25 |
| 3833.0 | 26 |
| 3834.0 | 27 |
| 3835.0 | 28 |
| 3836.0 | 27 |
| 3837.0 | 26 |
| 3838.0 | 27 |
| 3839.0 | 28 |
| 3840.0 | 29 |
| 3841.0 | 28 |
| 3842.0 | 27 |
| 3843.0 | 28 |
| 3844.0 | 29 |
| 3845.0 | 30 |
| 3846.0 | 29 |
| 3847.0 | 28 |
| 3848.0 | 27 |
| 3849.0 | 28 |
| 3850.0 | 29 |
| 3851.0 | 30 |
| 3852.0 | 29 |
| 3853.0 | 30 |
| 3854.0 | 31 |
| 3855.0 | 32 |
| 3856.0 | 33 |
| 3857.0 | 32 |
| 3858.0 | 31 |
| 3859.0 | 30 |
| 3860.0 | 29 |
| 3861.0 | 28 |
| 3862.0 | 29 |
| 3863.0 | 28 |
| 3864.0 | 27 |
| 3865.0 | 28 |
| 3866.0 | 29 |
| 3867.0 | 30 |
| 3868.0 | 31 |
| 3869.0 | 30 |
| 3870.0 | 29 |
| 3871.0 | 28 |
| 3872.0 | 27 |
| 3873.0 | 26 |
| 3874.0 | 27 |
| 3875.0 | 28 |
| 3876.0 | 29 |
| 3877.0 | 30 |
| 3878.0 | 31 |
| 3879.0 | 30 |
| 3880.0 | 29 |
| 3881.0 | 30 |
| 3882.0 | 31 |
| 3883.0 | 32 |
| 3884.0 | 33 |
| 3885.0 | 34 |
| 3886.0 | 33 |
| 3887.0 | 34 |
| 3888.0 | 35 |
| 3889.0 | 34 |
| 3890.0 | 35 |
| 3891.0 | 34 |
| 3892.0 | 35 |
| 3893.0 | 36 |
| 3894.0 | 35 |
| 3895.0 | 36 |
| 3896.0 | 35 |
| 3897.0 | 34 |
| 3898.0 | 35 |
| 3899.0 | 34 |
| 3900.0 | 33 |
| 3901.0 | 32 |
| 3902.0 | 31 |
| 3903.0 | 30 |
| 3904.0 | 29 |
| 3905.0 | 28 |
| 3906.0 | 29 |
| 3907.0 | 28 |
| 3908.0 | 29 |
| 3909.0 | 30 |
| 3910.0 | 31 |
| 3911.0 | 30 |
| 3912.0 | 29 |
| 3913.0 | 30 |
| 3914.0 | 31 |
| 3915.0 | 30 |
| 3916.0 | 31 |
| 3917.0 | 30 |
| 3918.0 | 31 |
| 3919.0 | 32 |
| 3920.0 | 33 |
| 3921.0 | 32 |
| 3922.0 | 33 |
| 3923.0 | 34 |
| 3924.0 | 33 |
| 3925.0 | 32 |
| 3926.0 | 33 |
| 3927.0 | 32 |
| 3928.0 | 33 |
| 3929.0 | 32 |
| 3930.0 | 31 |
| 3931.0 | 30 |
| 3932.0 | 31 |
| 3933.0 | 30 |
| 3934.0 | 29 |
| 3935.0 | 28 |
| 3936.0 | 29 |
| 3937.0 | 30 |
| 3938.0 | 31 |
| 3939.0 | 32 |
| 3940.0 | 31 |
| 3941.0 | 30 |
| 3942.0 | 31 |
| 3943.0 | 32 |
| 3944.0 | 31 |
| 3945.0 | 32 |
| 3946.0 | 33 |
| 3947.0 | 34 |
| 3948.0 | 35 |
| 3949.0 | 34 |
| 3950.0 | 35 |
| 3951.0 | 34 |
| 3952.0 | 35 |
| 3953.0 | 36 |
| 3954.0 | 35 |
| 3955.0 | 36 |
| 3956.0 | 37 |
| 3957.0 | 36 |
| 3958.0 | 37 |
| 3959.0 | 36 |
| 3960.0 | 37 |
| 3961.0 | 36 |
| 3962.0 | 37 |
| 3963.0 | 38 |
| 3964.0 | 37 |
| 3965.0 | 38 |
| 3966.0 | 39 |
| 3967.0 | 40 |
| 3968.0 | 41 |
| 3969.0 | 40 |
| 3970.0 | 41 |
| 3971.0 | 40 |
| 3972.0 | 39 |
| 3973.0 | 40 |
| 3974.0 | 41 |
| 3975.0 | 40 |
| 3976.0 | 39 |
| 3977.0 | 40 |
| 3978.0 | 41 |
| 3979.0 | 40 |
| 3980.0 | 39 |
| 3981.0 | 38 |
| 3982.0 | 39 |
| 3983.0 | 38 |
| 3984.0 | 39 |
| 3985.0 | 40 |
| 3986.0 | 39 |
| 3987.0 | 38 |
| 3988.0 | 39 |
| 3989.0 | 38 |
| 3990.0 | 37 |
| 3991.0 | 38 |
| 3992.0 | 37 |
| 3993.0 | 38 |
| 3994.0 | 39 |
| 3995.0 | 40 |
| 3996.0 | 41 |
| 3997.0 | 40 |
| 3998.0 | 39 |
| 3999.0 | 40 |
| 4000.0 | 41 |
| 4001.0 | 40 |
| 4002.0 | 41 |
| 4003.0 | 40 |
| 4004.0 | 39 |
| 4005.0 | 38 |
| 4006.0 | 39 |
| 4007.0 | 38 |
| 4008.0 | 39 |
| 4009.0 | 40 |
| 4010.0 | 41 |
| 4011.0 | 42 |
| 4012.0 | 41 |
| 4013.0 | 40 |
| 4014.0 | 39 |
| 4015.0 | 38 |
| 4016.0 | 37 |
| 4017.0 | 38 |
| 4018.0 | 37 |
| 4019.0 | 38 |
| 4020.0 | 37 |
| 4021.0 | 36 |
| 4022.0 | 37 |
| 4023.0 | 38 |
| 4024.0 | 39 |
| 4025.0 | 38 |
| 4026.0 | 37 |
| 4027.0 | 38 |
| 4028.0 | 37 |
| 4029.0 | 38 |
| 4030.0 | 39 |
| 4031.0 | 38 |
| 4032.0 | 37 |
| 4033.0 | 38 |
| 4034.0 | 37 |
| 4035.0 | 36 |
| 4036.0 | 35 |
| 4037.0 | 36 |
| 4038.0 | 35 |
| 4039.0 | 36 |
| 4040.0 | 37 |
| 4041.0 | 36 |
| 4042.0 | 35 |
| 4043.0 | 36 |
| 4044.0 | 35 |
| 4045.0 | 34 |
| 4046.0 | 35 |
| 4047.0 | 36 |
| 4048.0 | 35 |
| 4049.0 | 36 |
| 4050.0 | 37 |
| 4051.0 | 36 |
| 4052.0 | 37 |
| 4053.0 | 36 |
| 4054.0 | 35 |
| 4055.0 | 36 |
| 4056.0 | 37 |
| 4057.0 | 38 |
| 4058.0 | 39 |
| 4059.0 | 40 |
| 4060.0 | 41 |
| 4061.0 | 42 |
| 4062.0 | 41 |
| 4063.0 | 40 |
| 4064.0 | 41 |
| 4065.0 | 42 |
| 4066.0 | 41 |
| 4067.0 | 40 |
| 4068.0 | 41 |
| 4069.0 | 40 |
| 4070.0 | 41 |
| 4071.0 | 42 |
| 4072.0 | 41 |
| 4073.0 | 42 |
| 4074.0 | 43 |
| 4075.0 | 44 |
| 4076.0 | 45 |
| 4077.0 | 46 |
| 4078.0 | 45 |
| 4079.0 | 46 |
| 4080.0 | 45 |
| 4081.0 | 44 |
| 4082.0 | 43 |
| 4083.0 | 42 |
| 4084.0 | 41 |
| 4085.0 | 42 |
| 4086.0 | 41 |
| 4087.0 | 42 |
| 4088.0 | 41 |
| 4089.0 | 40 |
| 4090.0 | 41 |
| 4091.0 | 42 |
| 4092.0 | 43 |
| 4093.0 | 42 |
| 4094.0 | 43 |
| 4095.0 | 42 |
| 4096.0 | 43 |
| 4097.0 | 42 |
| 4098.0 | 41 |
| 4099.0 | 42 |
| 4100.0 | 41 |
| 4101.0 | 40 |
| 4102.0 | 41 |
| 4103.0 | 42 |
| 4104.0 | 43 |
| 4105.0 | 42 |
| 4106.0 | 41 |
| 4107.0 | 40 |
| 4108.0 | 39 |
| 4109.0 | 38 |
| 4110.0 | 37 |
| 4111.0 | 36 |
| 4112.0 | 37 |
| 4113.0 | 38 |
| 4114.0 | 39 |
| 4115.0 | 40 |
| 4116.0 | 41 |
| 4117.0 | 40 |
| 4118.0 | 41 |
| 4119.0 | 42 |
| 4120.0 | 41 |
| 4121.0 | 42 |
| 4122.0 | 41 |
| 4123.0 | 40 |
| 4124.0 | 39 |
| 4125.0 | 38 |
| 4126.0 | 37 |
| 4127.0 | 38 |
| 4128.0 | 37 |
| 4129.0 | 38 |
| 4130.0 | 39 |
| 4131.0 | 40 |
| 4132.0 | 41 |
| 4133.0 | 40 |
| 4134.0 | 41 |
| 4135.0 | 40 |
| 4136.0 | 39 |
| 4137.0 | 38 |
| 4138.0 | 37 |
| 4139.0 | 36 |
| 4140.0 | 35 |
| 4141.0 | 34 |
| 4142.0 | 35 |
| 4143.0 | 34 |
| 4144.0 | 35 |
| 4145.0 | 36 |
| 4146.0 | 35 |
| 4147.0 | 36 |
| 4148.0 | 37 |
| 4149.0 | 38 |
| 4150.0 | 37 |
| 4151.0 | 36 |
| 4152.0 | 35 |
| 4153.0 | 34 |
| 4154.0 | 35 |
| 4155.0 | 34 |
| 4156.0 | 35 |
| 4157.0 | 34 |
| 4158.0 | 33 |
| 4159.0 | 34 |
| 4160.0 | 35 |
| 4161.0 | 34 |
| 4162.0 | 33 |
| 4163.0 | 32 |
| 4164.0 | 31 |
| 4165.0 | 32 |
| 4166.0 | 33 |
| 4167.0 | 32 |
| 4168.0 | 33 |
| 4169.0 | 34 |
| 4170.0 | 35 |
| 4171.0 | 36 |
| 4172.0 | 37 |
| 4173.0 | 38 |
| 4174.0 | 37 |
| 4175.0 | 36 |
| 4176.0 | 37 |
| 4177.0 | 38 |
| 4178.0 | 37 |
| 4179.0 | 38 |
| 4180.0 | 39 |
| 4181.0 | 40 |
| 4182.0 | 39 |
| 4183.0 | 38 |
| 4184.0 | 39 |
| 4185.0 | 40 |
| 4186.0 | 39 |
| 4187.0 | 38 |
| 4188.0 | 39 |
| 4189.0 | 38 |
| 4190.0 | 39 |
| 4191.0 | 40 |
| 4192.0 | 41 |
| 4193.0 | 40 |
| 4194.0 | 39 |
| 4195.0 | 40 |
| 4196.0 | 41 |
| 4197.0 | 40 |
| 4198.0 | 41 |
| 4199.0 | 42 |
| 4200.0 | 43 |
| 4201.0 | 42 |
| 4202.0 | 43 |
| 4203.0 | 42 |
| 4204.0 | 41 |
| 4205.0 | 40 |
| 4206.0 | 41 |
| 4207.0 | 40 |
| 4208.0 | 41 |
| 4209.0 | 40 |
| 4210.0 | 39 |
| 4211.0 | 40 |
| 4212.0 | 39 |
| 4213.0 | 40 |
| 4214.0 | 41 |
| 4215.0 | 40 |
| 4216.0 | 41 |
| 4217.0 | 42 |
| 4218.0 | 43 |
| 4219.0 | 44 |
| 4220.0 | 45 |
| 4221.0 | 46 |
| 4222.0 | 47 |
| 4223.0 | 48 |
| 4224.0 | 49 |
| 4225.0 | 48 |
| 4226.0 | 47 |
| 4227.0 | 46 |
| 4228.0 | 47 |
| 4229.0 | 46 |
| 4230.0 | 47 |
| 4231.0 | 48 |
| 4232.0 | 47 |
| 4233.0 | 46 |
| 4234.0 | 45 |
| 4235.0 | 46 |
| 4236.0 | 47 |
| 4237.0 | 48 |
| 4238.0 | 49 |
| 4239.0 | 48 |
| 4240.0 | 47 |
| 4241.0 | 46 |
| 4242.0 | 47 |
| 4243.0 | 48 |
| 4244.0 | 47 |
| 4245.0 | 46 |
| 4246.0 | 47 |
| 4247.0 | 48 |
| 4248.0 | 49 |
| 4249.0 | 50 |
| 4250.0 | 49 |
| 4251.0 | 50 |
| 4252.0 | 49 |
| 4253.0 | 48 |
| 4254.0 | 47 |
| 4255.0 | 46 |
| 4256.0 | 47 |
| 4257.0 | 46 |
| 4258.0 | 45 |
| 4259.0 | 44 |
| 4260.0 | 45 |
| 4261.0 | 46 |
| 4262.0 | 47 |
| 4263.0 | 46 |
| 4264.0 | 47 |
| 4265.0 | 46 |
| 4266.0 | 45 |
| 4267.0 | 46 |
| 4268.0 | 45 |
| 4269.0 | 46 |
| 4270.0 | 45 |
| 4271.0 | 46 |
| 4272.0 | 47 |
| 4273.0 | 48 |
| 4274.0 | 49 |
| 4275.0 | 48 |
| 4276.0 | 49 |
| 4277.0 | 48 |
| 4278.0 | 49 |
| 4279.0 | 50 |
| 4280.0 | 51 |
| 4281.0 | 50 |
| 4282.0 | 51 |
| 4283.0 | 52 |
| 4284.0 | 51 |
| 4285.0 | 52 |
| 4286.0 | 51 |
| 4287.0 | 52 |
| 4288.0 | 53 |
| 4289.0 | 54 |
| 4290.0 | 53 |
| 4291.0 | 54 |
| 4292.0 | 55 |
| 4293.0 | 54 |
| 4294.0 | 55 |
| 4295.0 | 56 |
| 4296.0 | 55 |
| 4297.0 | 56 |
| 4298.0 | 57 |
| 4299.0 | 56 |
| 4300.0 | 55 |
| 4301.0 | 54 |
| 4302.0 | 53 |
| 4303.0 | 54 |
| 4304.0 | 53 |
| 4305.0 | 54 |
| 4306.0 | 53 |
| 4307.0 | 54 |
| 4308.0 | 53 |
| 4309.0 | 52 |
| 4310.0 | 51 |
| 4311.0 | 50 |
| 4312.0 | 49 |
| 4313.0 | 48 |
| 4314.0 | 49 |
| 4315.0 | 48 |
| 4316.0 | 49 |
| 4317.0 | 50 |
| 4318.0 | 51 |
| 4319.0 | 52 |
| 4320.0 | 51 |
| 4321.0 | 50 |
| 4322.0 | 51 |
| 4323.0 | 52 |
| 4324.0 | 51 |
| 4325.0 | 52 |
| 4326.0 | 53 |
| 4327.0 | 52 |
| 4328.0 | 53 |
| 4329.0 | 52 |
| 4330.0 | 53 |
| 4331.0 | 52 |
| 4332.0 | 51 |
| 4333.0 | 50 |
| 4334.0 | 49 |
| 4335.0 | 48 |
| 4336.0 | 49 |
| 4337.0 | 50 |
| 4338.0 | 51 |
| 4339.0 | 50 |
| 4340.0 | 49 |
| 4341.0 | 50 |
| 4342.0 | 49 |
| 4343.0 | 50 |
| 4344.0 | 51 |
| 4345.0 | 50 |
| 4346.0 | 51 |
| 4347.0 | 52 |
| 4348.0 | 51 |
| 4349.0 | 50 |
| 4350.0 | 49 |
| 4351.0 | 50 |
| 4352.0 | 49 |
| 4353.0 | 48 |
| 4354.0 | 47 |
| 4355.0 | 46 |
| 4356.0 | 47 |
| 4357.0 | 46 |
| 4358.0 | 47 |
| 4359.0 | 48 |
| 4360.0 | 47 |
| 4361.0 | 48 |
| 4362.0 | 49 |
| 4363.0 | 48 |
| 4364.0 | 47 |
| 4365.0 | 48 |
| 4366.0 | 49 |
| 4367.0 | 48 |
| 4368.0 | 49 |
| 4369.0 | 48 |
| 4370.0 | 47 |
| 4371.0 | 48 |
| 4372.0 | 49 |
| 4373.0 | 50 |
| 4374.0 | 49 |
| 4375.0 | 48 |
| 4376.0 | 49 |
| 4377.0 | 48 |
| 4378.0 | 47 |
| 4379.0 | 48 |
| 4380.0 | 49 |
| 4381.0 | 50 |
| 4382.0 | 49 |
| 4383.0 | 50 |
| 4384.0 | 51 |
| 4385.0 | 50 |
| 4386.0 | 51 |
| 4387.0 | 50 |
| 4388.0 | 49 |
| 4389.0 | 50 |
| 4390.0 | 51 |
| 4391.0 | 52 |
| 4392.0 | 51 |
| 4393.0 | 50 |
| 4394.0 | 51 |
| 4395.0 | 52 |
| 4396.0 | 51 |
| 4397.0 | 50 |
| 4398.0 | 49 |
| 4399.0 | 48 |
| 4400.0 | 47 |
| 4401.0 | 48 |
| 4402.0 | 47 |
| 4403.0 | 46 |
| 4404.0 | 47 |
| 4405.0 | 48 |
| 4406.0 | 47 |
| 4407.0 | 48 |
| 4408.0 | 47 |
| 4409.0 | 48 |
| 4410.0 | 47 |
| 4411.0 | 46 |
| 4412.0 | 47 |
| 4413.0 | 46 |
| 4414.0 | 47 |
| 4415.0 | 48 |
| 4416.0 | 49 |
| 4417.0 | 50 |
| 4418.0 | 49 |
| 4419.0 | 50 |
| 4420.0 | 51 |
| 4421.0 | 50 |
| 4422.0 | 51 |
| 4423.0 | 52 |
| 4424.0 | 51 |
| 4425.0 | 52 |
| 4426.0 | 51 |
| 4427.0 | 52 |
| 4428.0 | 53 |
| 4429.0 | 54 |
| 4430.0 | 55 |
| 4431.0 | 54 |
| 4432.0 | 53 |
| 4433.0 | 52 |
| 4434.0 | 51 |
| 4435.0 | 50 |
| 4436.0 | 49 |
| 4437.0 | 50 |
| 4438.0 | 49 |
| 4439.0 | 50 |
| 4440.0 | 51 |
| 4441.0 | 52 |
| 4442.0 | 53 |
| 4443.0 | 54 |
| 4444.0 | 53 |
| 4445.0 | 54 |
| 4446.0 | 53 |
| 4447.0 | 54 |
| 4448.0 | 53 |
| 4449.0 | 54 |
| 4450.0 | 55 |
| 4451.0 | 54 |
| 4452.0 | 55 |
| 4453.0 | 54 |
| 4454.0 | 55 |
| 4455.0 | 54 |
| 4456.0 | 55 |
| 4457.0 | 54 |
| 4458.0 | 53 |
| 4459.0 | 52 |
| 4460.0 | 51 |
| 4461.0 | 50 |
| 4462.0 | 51 |
| 4463.0 | 52 |
| 4464.0 | 51 |
| 4465.0 | 52 |
| 4466.0 | 51 |
| 4467.0 | 52 |
| 4468.0 | 51 |
| 4469.0 | 50 |
| 4470.0 | 49 |
| 4471.0 | 48 |
| 4472.0 | 49 |
| 4473.0 | 48 |
| 4474.0 | 49 |
| 4475.0 | 50 |
| 4476.0 | 49 |
| 4477.0 | 48 |
| 4478.0 | 47 |
| 4479.0 | 46 |
| 4480.0 | 47 |
| 4481.0 | 46 |
| 4482.0 | 47 |
| 4483.0 | 48 |
| 4484.0 | 47 |
| 4485.0 | 48 |
| 4486.0 | 49 |
| 4487.0 | 50 |
| 4488.0 | 49 |
| 4489.0 | 48 |
| 4490.0 | 49 |
| 4491.0 | 50 |
| 4492.0 | 51 |
| 4493.0 | 50 |
| 4494.0 | 51 |
| 4495.0 | 52 |
| 4496.0 | 51 |
| 4497.0 | 50 |
| 4498.0 | 49 |
| 4499.0 | 48 |
| 4500.0 | 49 |
| 4501.0 | 48 |
| 4502.0 | 47 |
| 4503.0 | 46 |
| 4504.0 | 45 |
| 4505.0 | 46 |
| 4506.0 | 45 |
| 4507.0 | 44 |
| 4508.0 | 43 |
| 4509.0 | 42 |
| 4510.0 | 41 |
| 4511.0 | 42 |
| 4512.0 | 43 |
| 4513.0 | 42 |
| 4514.0 | 43 |
| 4515.0 | 44 |
| 4516.0 | 43 |
| 4517.0 | 44 |
| 4518.0 | 45 |
| 4519.0 | 44 |
| 4520.0 | 43 |
| 4521.0 | 42 |
| 4522.0 | 41 |
| 4523.0 | 40 |
| 4524.0 | 41 |
| 4525.0 | 42 |
| 4526.0 | 41 |
| 4527.0 | 40 |
| 4528.0 | 41 |
| 4529.0 | 40 |
| 4530.0 | 41 |
| 4531.0 | 42 |
| 4532.0 | 41 |
| 4533.0 | 40 |
| 4534.0 | 39 |
| 4535.0 | 40 |
| 4536.0 | 39 |
| 4537.0 | 40 |
| 4538.0 | 39 |
| 4539.0 | 40 |
| 4540.0 | 41 |
| 4541.0 | 42 |
| 4542.0 | 41 |
| 4543.0 | 40 |
| 4544.0 | 39 |
| 4545.0 | 40 |
| 4546.0 | 41 |
| 4547.0 | 40 |
| 4548.0 | 41 |
| 4549.0 | 40 |
| 4550.0 | 39 |
| 4551.0 | 40 |
| 4552.0 | 39 |
| 4553.0 | 40 |
| 4554.0 | 41 |
| 4555.0 | 40 |
| 4556.0 | 41 |
| 4557.0 | 40 |
| 4558.0 | 41 |
| 4559.0 | 42 |
| 4560.0 | 41 |
| 4561.0 | 42 |
| 4562.0 | 43 |
| 4563.0 | 42 |
| 4564.0 | 43 |
| 4565.0 | 44 |
| 4566.0 | 45 |
| 4567.0 | 46 |
| 4568.0 | 47 |
| 4569.0 | 46 |
| 4570.0 | 45 |
| 4571.0 | 44 |
| 4572.0 | 45 |
| 4573.0 | 46 |
| 4574.0 | 47 |
| 4575.0 | 46 |
| 4576.0 | 45 |
| 4577.0 | 46 |
| 4578.0 | 47 |
| 4579.0 | 48 |
| 4580.0 | 47 |
| 4581.0 | 48 |
| 4582.0 | 49 |
| 4583.0 | 50 |
| 4584.0 | 51 |
| 4585.0 | 50 |
| 4586.0 | 51 |
| 4587.0 | 50 |
| 4588.0 | 49 |
| 4589.0 | 48 |
| 4590.0 | 49 |
| 4591.0 | 48 |
| 4592.0 | 47 |
| 4593.0 | 48 |
| 4594.0 | 47 |
| 4595.0 | 46 |
| 4596.0 | 45 |
| 4597.0 | 46 |
| 4598.0 | 47 |
| 4599.0 | 48 |
| 4600.0 | 47 |
| 4601.0 | 48 |
| 4602.0 | 47 |
| 4603.0 | 48 |
| 4604.0 | 49 |
| 4605.0 | 48 |
| 4606.0 | 49 |
| 4607.0 | 50 |
| 4608.0 | 51 |
| 4609.0 | 52 |
| 4610.0 | 53 |
| 4611.0 | 54 |
| 4612.0 | 53 |
| 4613.0 | 54 |
| 4614.0 | 55 |
| 4615.0 | 56 |
| 4616.0 | 55 |
| 4617.0 | 54 |
| 4618.0 | 53 |
| 4619.0 | 52 |
| 4620.0 | 51 |
| 4621.0 | 52 |
| 4622.0 | 51 |
| 4623.0 | 52 |
| 4624.0 | 53 |
| 4625.0 | 54 |
| 4626.0 | 53 |
| 4627.0 | 52 |
| 4628.0 | 53 |
| 4629.0 | 54 |
| 4630.0 | 53 |
| 4631.0 | 54 |
| 4632.0 | 55 |
| 4633.0 | 56 |
| 4634.0 | 57 |
| 4635.0 | 58 |
| 4636.0 | 57 |
| 4637.0 | 56 |
| 4638.0 | 57 |
| 4639.0 | 56 |
| 4640.0 | 57 |
| 4641.0 | 58 |
| 4642.0 | 59 |
| 4643.0 | 60 |
| 4644.0 | 61 |
| 4645.0 | 62 |
| 4646.0 | 61 |
| 4647.0 | 62 |
| 4648.0 | 63 |
| 4649.0 | 62 |
| 4650.0 | 61 |
| 4651.0 | 60 |
| 4652.0 | 61 |
| 4653.0 | 62 |
| 4654.0 | 63 |
| 4655.0 | 62 |
| 4656.0 | 61 |
| 4657.0 | 62 |
| 4658.0 | 63 |
| 4659.0 | 62 |
| 4660.0 | 61 |
| 4661.0 | 62 |
| 4662.0 | 61 |
| 4663.0 | 62 |
| 4664.0 | 63 |
| 4665.0 | 62 |
| 4666.0 | 63 |
| 4667.0 | 62 |
| 4668.0 | 63 |
| 4669.0 | 62 |
| 4670.0 | 63 |
| 4671.0 | 62 |
| 4672.0 | 63 |
| 4673.0 | 64 |
| 4674.0 | 65 |
| 4675.0 | 66 |
| 4676.0 | 67 |
| 4677.0 | 66 |
| 4678.0 | 67 |
| 4679.0 | 66 |
| 4680.0 | 65 |
| 4681.0 | 64 |
| 4682.0 | 63 |
| 4683.0 | 64 |
| 4684.0 | 65 |
| 4685.0 | 66 |
| 4686.0 | 65 |
| 4687.0 | 66 |
| 4688.0 | 67 |
| 4689.0 | 68 |
| 4690.0 | 69 |
| 4691.0 | 70 |
| 4692.0 | 69 |
| 4693.0 | 70 |
| 4694.0 | 71 |
| 4695.0 | 72 |
| 4696.0 | 73 |
| 4697.0 | 74 |
| 4698.0 | 75 |
| 4699.0 | 76 |
| 4700.0 | 75 |
| 4701.0 | 76 |
| 4702.0 | 75 |
| 4703.0 | 76 |
| 4704.0 | 77 |
| 4705.0 | 78 |
| 4706.0 | 79 |
| 4707.0 | 78 |
| 4708.0 | 79 |
| 4709.0 | 78 |
| 4710.0 | 79 |
| 4711.0 | 80 |
| 4712.0 | 81 |
| 4713.0 | 82 |
| 4714.0 | 83 |
| 4715.0 | 84 |
| 4716.0 | 83 |
| 4717.0 | 84 |
| 4718.0 | 83 |
| 4719.0 | 82 |
| 4720.0 | 81 |
| 4721.0 | 82 |
| 4722.0 | 81 |
| 4723.0 | 80 |
| 4724.0 | 81 |
| 4725.0 | 82 |
| 4726.0 | 83 |
| 4727.0 | 84 |
| 4728.0 | 85 |
| 4729.0 | 86 |
| 4730.0 | 85 |
| 4731.0 | 84 |
| 4732.0 | 85 |
| 4733.0 | 84 |
| 4734.0 | 83 |
| 4735.0 | 82 |
| 4736.0 | 81 |
| 4737.0 | 82 |
| 4738.0 | 83 |
| 4739.0 | 82 |
| 4740.0 | 83 |
| 4741.0 | 82 |
| 4742.0 | 83 |
| 4743.0 | 84 |
| 4744.0 | 83 |
| 4745.0 | 84 |
| 4746.0 | 85 |
| 4747.0 | 86 |
| 4748.0 | 85 |
| 4749.0 | 84 |
| 4750.0 | 85 |
| 4751.0 | 84 |
| 4752.0 | 85 |
| 4753.0 | 86 |
| 4754.0 | 87 |
| 4755.0 | 88 |
| 4756.0 | 87 |
| 4757.0 | 88 |
| 4758.0 | 87 |
| 4759.0 | 86 |
| 4760.0 | 87 |
| 4761.0 | 88 |
| 4762.0 | 87 |
| 4763.0 | 86 |
| 4764.0 | 87 |
| 4765.0 | 86 |
| 4766.0 | 87 |
| 4767.0 | 88 |
| 4768.0 | 87 |
| 4769.0 | 88 |
| 4770.0 | 89 |
| 4771.0 | 88 |
| 4772.0 | 87 |
| 4773.0 | 86 |
| 4774.0 | 85 |
| 4775.0 | 86 |
| 4776.0 | 85 |
| 4777.0 | 86 |
| 4778.0 | 87 |
| 4779.0 | 86 |
| 4780.0 | 85 |
| 4781.0 | 86 |
| 4782.0 | 85 |
| 4783.0 | 86 |
| 4784.0 | 87 |
| 4785.0 | 88 |
| 4786.0 | 89 |
| 4787.0 | 90 |
| 4788.0 | 91 |
| 4789.0 | 90 |
| 4790.0 | 89 |
| 4791.0 | 90 |
| 4792.0 | 91 |
| 4793.0 | 90 |
| 4794.0 | 91 |
| 4795.0 | 92 |
| 4796.0 | 93 |
| 4797.0 | 92 |
| 4798.0 | 91 |
| 4799.0 | 92 |
| 4800.0 | 93 |
| 4801.0 | 92 |
| 4802.0 | 93 |
| 4803.0 | 94 |
| 4804.0 | 93 |
| 4805.0 | 94 |
| 4806.0 | 93 |
| 4807.0 | 94 |
| 4808.0 | 95 |
| 4809.0 | 94 |
| 4810.0 | 95 |
| 4811.0 | 96 |
| 4812.0 | 97 |
| 4813.0 | 98 |
| 4814.0 | 97 |
| 4815.0 | 96 |
| 4816.0 | 97 |
| 4817.0 | 96 |
| 4818.0 | 95 |
| 4819.0 | 96 |
| 4820.0 | 95 |
| 4821.0 | 96 |
| 4822.0 | 97 |
| 4823.0 | 98 |
| 4824.0 | 99 |
| 4825.0 | 100 |
| 4826.0 | 101 |
| 4827.0 | 100 |
| 4828.0 | 101 |
| 4829.0 | 102 |
| 4830.0 | 103 |
| 4831.0 | 102 |
| 4832.0 | 101 |
| 4833.0 | 100 |
| 4834.0 | 101 |
| 4835.0 | 100 |
| 4836.0 | 101 |
| 4837.0 | 100 |
| 4838.0 | 99 |
| 4839.0 | 98 |
| 4840.0 | 99 |
| 4841.0 | 98 |
| 4842.0 | 99 |
| 4843.0 | 98 |
| 4844.0 | 97 |
| 4845.0 | 96 |
| 4846.0 | 97 |
| 4847.0 | 96 |
| 4848.0 | 97 |
| 4849.0 | 98 |
| 4850.0 | 99 |
| 4851.0 | 100 |
| 4852.0 | 99 |
| 4853.0 | 100 |
| 4854.0 | 99 |
| 4855.0 | 100 |
| 4856.0 | 99 |
| 4857.0 | 98 |
| 4858.0 | 97 |
| 4859.0 | 98 |
| 4860.0 | 97 |
| 4861.0 | 98 |
| 4862.0 | 97 |
| 4863.0 | 96 |
| 4864.0 | 95 |
| 4865.0 | 94 |
| 4866.0 | 93 |
| 4867.0 | 92 |
| 4868.0 | 91 |
| 4869.0 | 90 |
| 4870.0 | 91 |
| 4871.0 | 92 |
| 4872.0 | 91 |
| 4873.0 | 90 |
| 4874.0 | 89 |
| 4875.0 | 90 |
| 4876.0 | 89 |
| 4877.0 | 90 |
| 4878.0 | 89 |
| 4879.0 | 90 |
| 4880.0 | 89 |
| 4881.0 | 88 |
| 4882.0 | 89 |
| 4883.0 | 88 |
| 4884.0 | 87 |
| 4885.0 | 86 |
| 4886.0 | 85 |
| 4887.0 | 84 |
| 4888.0 | 83 |
| 4889.0 | 84 |
| 4890.0 | 83 |
| 4891.0 | 82 |
| 4892.0 | 81 |
| 4893.0 | 82 |
| 4894.0 | 81 |
| 4895.0 | 80 |
| 4896.0 | 79 |
| 4897.0 | 78 |
| 4898.0 | 77 |
| 4899.0 | 76 |
| 4900.0 | 77 |
| 4901.0 | 78 |
| 4902.0 | 79 |
| 4903.0 | 78 |
| 4904.0 | 79 |
| 4905.0 | 80 |
| 4906.0 | 79 |
| 4907.0 | 78 |
| 4908.0 | 79 |
| 4909.0 | 80 |
| 4910.0 | 79 |
| 4911.0 | 80 |
| 4912.0 | 79 |
| 4913.0 | 78 |
| 4914.0 | 77 |
| 4915.0 | 76 |
| 4916.0 | 75 |
| 4917.0 | 74 |
| 4918.0 | 75 |
| 4919.0 | 76 |
| 4920.0 | 75 |
| 4921.0 | 76 |
| 4922.0 | 77 |
| 4923.0 | 78 |
| 4924.0 | 77 |
| 4925.0 | 78 |
| 4926.0 | 77 |
| 4927.0 | 76 |
| 4928.0 | 77 |
| 4929.0 | 78 |
| 4930.0 | 77 |
| 4931.0 | 76 |
| 4932.0 | 75 |
| 4933.0 | 74 |
| 4934.0 | 75 |
| 4935.0 | 74 |
| 4936.0 | 73 |
| 4937.0 | 72 |
| 4938.0 | 71 |
| 4939.0 | 72 |
| 4940.0 | 71 |
| 4941.0 | 72 |
| 4942.0 | 73 |
| 4943.0 | 72 |
| 4944.0 | 71 |
| 4945.0 | 72 |
| 4946.0 | 73 |
| 4947.0 | 72 |
| 4948.0 | 73 |
| 4949.0 | 72 |
| 4950.0 | 71 |
| 4951.0 | 70 |
| 4952.0 | 71 |
| 4953.0 | 72 |
| 4954.0 | 71 |
| 4955.0 | 70 |
| 4956.0 | 71 |
| 4957.0 | 70 |
| 4958.0 | 71 |
| 4959.0 | 70 |
| 4960.0 | 71 |
| 4961.0 | 70 |
| 4962.0 | 71 |
| 4963.0 | 72 |
| 4964.0 | 71 |
| 4965.0 | 70 |
| 4966.0 | 69 |
| 4967.0 | 70 |
| 4968.0 | 69 |
| 4969.0 | 70 |
| 4970.0 | 69 |
| 4971.0 | 70 |
| 4972.0 | 69 |
| 4973.0 | 68 |
| 4974.0 | 67 |
| 4975.0 | 66 |
| 4976.0 | 65 |
| 4977.0 | 66 |
| 4978.0 | 65 |
| 4979.0 | 64 |
| 4980.0 | 63 |
| 4981.0 | 62 |
| 4982.0 | 63 |
| 4983.0 | 62 |
| 4984.0 | 61 |
| 4985.0 | 60 |
| 4986.0 | 59 |
| 4987.0 | 58 |
| 4988.0 | 57 |
| 4989.0 | 56 |
| 4990.0 | 57 |
| 4991.0 | 56 |
| 4992.0 | 57 |
| 4993.0 | 56 |
| 4994.0 | 55 |
| 4995.0 | 54 |
| 4996.0 | 55 |
| 4997.0 | 54 |
| 4998.0 | 55 |
| 4999.0 | 56 |
| 5000.0 | 55 |
| 5001.0 | 54 |
| 5002.0 | 55 |
| 5003.0 | 54 |
| 5004.0 | 55 |
| 5005.0 | 54 |
| 5006.0 | 55 |
| 5007.0 | 56 |
| 5008.0 | 55 |
| 5009.0 | 54 |
| 5010.0 | 55 |
| 5011.0 | 54 |
| 5012.0 | 55 |
| 5013.0 | 56 |
| 5014.0 | 55 |
| 5015.0 | 54 |
| 5016.0 | 55 |
| 5017.0 | 56 |
| 5018.0 | 55 |
| 5019.0 | 56 |
| 5020.0 | 55 |
| 5021.0 | 56 |
| 5022.0 | 55 |
| 5023.0 | 56 |
| 5024.0 | 57 |
| 5025.0 | 58 |
| 5026.0 | 57 |
| 5027.0 | 58 |
| 5028.0 | 57 |
| 5029.0 | 58 |
| 5030.0 | 59 |
| 5031.0 | 60 |
| 5032.0 | 61 |
| 5033.0 | 62 |
| 5034.0 | 63 |
| 5035.0 | 64 |
| 5036.0 | 63 |
| 5037.0 | 64 |
| 5038.0 | 65 |
| 5039.0 | 66 |
| 5040.0 | 67 |
| 5041.0 | 66 |
| 5042.0 | 65 |
| 5043.0 | 64 |
| 5044.0 | 65 |
| 5045.0 | 66 |
| 5046.0 | 67 |
| 5047.0 | 66 |
| 5048.0 | 67 |
| 5049.0 | 66 |
| 5050.0 | 65 |
| 5051.0 | 66 |
| 5052.0 | 67 |
| 5053.0 | 66 |
| 5054.0 | 65 |
| 5055.0 | 66 |
| 5056.0 | 67 |
| 5057.0 | 66 |
| 5058.0 | 67 |
| 5059.0 | 66 |
| 5060.0 | 65 |
| 5061.0 | 66 |
| 5062.0 | 65 |
| 5063.0 | 66 |
| 5064.0 | 65 |
| 5065.0 | 66 |
| 5066.0 | 65 |
| 5067.0 | 64 |
| 5068.0 | 63 |
| 5069.0 | 62 |
| 5070.0 | 63 |
| 5071.0 | 64 |
| 5072.0 | 65 |
| 5073.0 | 66 |
| 5074.0 | 65 |
| 5075.0 | 66 |
| 5076.0 | 67 |
| 5077.0 | 68 |
| 5078.0 | 67 |
| 5079.0 | 66 |
| 5080.0 | 67 |
| 5081.0 | 66 |
| 5082.0 | 65 |
| 5083.0 | 66 |
| 5084.0 | 67 |
| 5085.0 | 66 |
| 5086.0 | 67 |
| 5087.0 | 66 |
| 5088.0 | 67 |
| 5089.0 | 66 |
| 5090.0 | 67 |
| 5091.0 | 66 |
| 5092.0 | 65 |
| 5093.0 | 64 |
| 5094.0 | 65 |
| 5095.0 | 66 |
| 5096.0 | 67 |
| 5097.0 | 68 |
| 5098.0 | 69 |
| 5099.0 | 68 |
| 5100.0 | 69 |
| 5101.0 | 68 |
| 5102.0 | 69 |
| 5103.0 | 70 |
| 5104.0 | 71 |
| 5105.0 | 72 |
| 5106.0 | 71 |
| 5107.0 | 72 |
| 5108.0 | 73 |
| 5109.0 | 72 |
| 5110.0 | 71 |
| 5111.0 | 70 |
| 5112.0 | 69 |
| 5113.0 | 68 |
| 5114.0 | 69 |
| 5115.0 | 70 |
| 5116.0 | 69 |
| 5117.0 | 70 |
| 5118.0 | 69 |
| 5119.0 | 70 |
| 5120.0 | 69 |
| 5121.0 | 70 |
| 5122.0 | 71 |
| 5123.0 | 70 |
| 5124.0 | 71 |
| 5125.0 | 72 |
| 5126.0 | 71 |
| 5127.0 | 72 |
| 5128.0 | 73 |
| 5129.0 | 72 |
| 5130.0 | 73 |
| 5131.0 | 72 |
| 5132.0 | 71 |
| 5133.0 | 72 |
| 5134.0 | 71 |
| 5135.0 | 72 |
| 5136.0 | 71 |
| 5137.0 | 70 |
| 5138.0 | 69 |
| 5139.0 | 70 |
| 5140.0 | 71 |
| 5141.0 | 70 |
| 5142.0 | 71 |
| 5143.0 | 70 |
| 5144.0 | 69 |
| 5145.0 | 70 |
| 5146.0 | 69 |
| 5147.0 | 68 |
| 5148.0 | 67 |
| 5149.0 | 68 |
| 5150.0 | 67 |
| 5151.0 | 68 |
| 5152.0 | 69 |
| 5153.0 | 70 |
| 5154.0 | 71 |
| 5155.0 | 70 |
| 5156.0 | 69 |
| 5157.0 | 70 |
| 5158.0 | 69 |
| 5159.0 | 68 |
| 5160.0 | 67 |
| 5161.0 | 68 |
| 5162.0 | 67 |
| 5163.0 | 68 |
| 5164.0 | 67 |
| 5165.0 | 66 |
| 5166.0 | 67 |
| 5167.0 | 68 |
| 5168.0 | 67 |
| 5169.0 | 66 |
| 5170.0 | 65 |
| 5171.0 | 64 |
| 5172.0 | 63 |
| 5173.0 | 62 |
| 5174.0 | 63 |
| 5175.0 | 64 |
| 5176.0 | 65 |
| 5177.0 | 64 |
| 5178.0 | 63 |
| 5179.0 | 64 |
| 5180.0 | 65 |
| 5181.0 | 66 |
| 5182.0 | 65 |
| 5183.0 | 66 |
| 5184.0 | 65 |
| 5185.0 | 64 |
| 5186.0 | 63 |
| 5187.0 | 62 |
| 5188.0 | 61 |
| 5189.0 | 60 |
| 5190.0 | 59 |
| 5191.0 | 58 |
| 5192.0 | 57 |
| 5193.0 | 56 |
| 5194.0 | 55 |
| 5195.0 | 56 |
| 5196.0 | 57 |
| 5197.0 | 58 |
| 5198.0 | 57 |
| 5199.0 | 58 |
| 5200.0 | 57 |
| 5201.0 | 56 |
| 5202.0 | 57 |
| 5203.0 | 58 |
| 5204.0 | 57 |
| 5205.0 | 56 |
| 5206.0 | 57 |
| 5207.0 | 58 |
| 5208.0 | 57 |
| 5209.0 | 58 |
| 5210.0 | 57 |
| 5211.0 | 56 |
| 5212.0 | 57 |
| 5213.0 | 56 |
| 5214.0 | 57 |
| 5215.0 | 56 |
| 5216.0 | 55 |
| 5217.0 | 56 |
| 5218.0 | 55 |
| 5219.0 | 56 |
| 5220.0 | 57 |
| 5221.0 | 56 |
| 5222.0 | 55 |
| 5223.0 | 54 |
| 5224.0 | 53 |
| 5225.0 | 52 |
| 5226.0 | 53 |
| 5227.0 | 52 |
| 5228.0 | 51 |
| 5229.0 | 52 |
| 5230.0 | 53 |
| 5231.0 | 54 |
| 5232.0 | 55 |
| 5233.0 | 54 |
| 5234.0 | 53 |
| 5235.0 | 52 |
| 5236.0 | 53 |
| 5237.0 | 52 |
| 5238.0 | 53 |
| 5239.0 | 52 |
| 5240.0 | 53 |
| 5241.0 | 54 |
| 5242.0 | 55 |
| 5243.0 | 56 |
| 5244.0 | 55 |
| 5245.0 | 54 |
| 5246.0 | 53 |
| 5247.0 | 54 |
| 5248.0 | 55 |
| 5249.0 | 56 |
| 5250.0 | 57 |
| 5251.0 | 56 |
| 5252.0 | 55 |
| 5253.0 | 54 |
| 5254.0 | 53 |
| 5255.0 | 52 |
| 5256.0 | 53 |
| 5257.0 | 54 |
| 5258.0 | 55 |
| 5259.0 | 54 |
| 5260.0 | 53 |
| 5261.0 | 52 |
| 5262.0 | 51 |
| 5263.0 | 52 |
| 5264.0 | 53 |
| 5265.0 | 54 |
| 5266.0 | 53 |
| 5267.0 | 52 |
| 5268.0 | 53 |
| 5269.0 | 54 |
| 5270.0 | 53 |
| 5271.0 | 52 |
| 5272.0 | 51 |
| 5273.0 | 50 |
| 5274.0 | 51 |
| 5275.0 | 52 |
| 5276.0 | 51 |
| 5277.0 | 52 |
| 5278.0 | 53 |
| 5279.0 | 54 |
| 5280.0 | 55 |
| 5281.0 | 56 |
| 5282.0 | 57 |
| 5283.0 | 56 |
| 5284.0 | 57 |
| 5285.0 | 56 |
| 5286.0 | 57 |
| 5287.0 | 56 |
| 5288.0 | 57 |
| 5289.0 | 58 |
| 5290.0 | 59 |
| 5291.0 | 60 |
| 5292.0 | 61 |
| 5293.0 | 62 |
| 5294.0 | 63 |
| 5295.0 | 62 |
| 5296.0 | 61 |
| 5297.0 | 60 |
| 5298.0 | 61 |
| 5299.0 | 62 |
| 5300.0 | 63 |
| 5301.0 | 62 |
| 5302.0 | 63 |
| 5303.0 | 62 |
| 5304.0 | 61 |
| 5305.0 | 60 |
| 5306.0 | 59 |
| 5307.0 | 58 |
| 5308.0 | 57 |
| 5309.0 | 58 |
| 5310.0 | 59 |
| 5311.0 | 58 |
| 5312.0 | 59 |
| 5313.0 | 58 |
| 5314.0 | 57 |
| 5315.0 | 58 |
| 5316.0 | 59 |
| 5317.0 | 60 |
| 5318.0 | 59 |
| 5319.0 | 58 |
| 5320.0 | 59 |
| 5321.0 | 58 |
| 5322.0 | 57 |
| 5323.0 | 56 |
| 5324.0 | 57 |
| 5325.0 | 56 |
| 5326.0 | 55 |
| 5327.0 | 56 |
| 5328.0 | 55 |
| 5329.0 | 54 |
| 5330.0 | 53 |
| 5331.0 | 52 |
| 5332.0 | 51 |
| 5333.0 | 52 |
| 5334.0 | 53 |
| 5335.0 | 52 |
| 5336.0 | 53 |
| 5337.0 | 54 |
| 5338.0 | 53 |
| 5339.0 | 54 |
| 5340.0 | 55 |
| 5341.0 | 54 |
| 5342.0 | 53 |
| 5343.0 | 52 |
| 5344.0 | 53 |
| 5345.0 | 54 |
| 5346.0 | 55 |
| 5347.0 | 54 |
| 5348.0 | 55 |
| 5349.0 | 56 |
| 5350.0 | 55 |
| 5351.0 | 56 |
| 5352.0 | 55 |
| 5353.0 | 54 |
| 5354.0 | 53 |
| 5355.0 | 52 |
| 5356.0 | 51 |
| 5357.0 | 52 |
| 5358.0 | 53 |
| 5359.0 | 54 |
| 5360.0 | 55 |
| 5361.0 | 54 |
| 5362.0 | 53 |
| 5363.0 | 52 |
| 5364.0 | 51 |
| 5365.0 | 52 |
| 5366.0 | 53 |
| 5367.0 | 52 |
| 5368.0 | 51 |
| 5369.0 | 52 |
| 5370.0 | 51 |
| 5371.0 | 52 |
| 5372.0 | 51 |
| 5373.0 | 52 |
| 5374.0 | 51 |
| 5375.0 | 50 |
| 5376.0 | 51 |
| 5377.0 | 50 |
| 5378.0 | 49 |
| 5379.0 | 50 |
| 5380.0 | 51 |
| 5381.0 | 52 |
| 5382.0 | 53 |
| 5383.0 | 54 |
| 5384.0 | 55 |
| 5385.0 | 54 |
| 5386.0 | 53 |
| 5387.0 | 52 |
| 5388.0 | 53 |
| 5389.0 | 54 |
| 5390.0 | 55 |
| 5391.0 | 56 |
| 5392.0 | 55 |
| 5393.0 | 54 |
| 5394.0 | 53 |
| 5395.0 | 52 |
| 5396.0 | 51 |
| 5397.0 | 52 |
| 5398.0 | 53 |
| 5399.0 | 54 |
| 5400.0 | 55 |
| 5401.0 | 54 |
| 5402.0 | 53 |
| 5403.0 | 54 |
| 5404.0 | 53 |
| 5405.0 | 54 |
| 5406.0 | 53 |
| 5407.0 | 52 |
| 5408.0 | 51 |
| 5409.0 | 50 |
| 5410.0 | 49 |
| 5411.0 | 48 |
| 5412.0 | 49 |
| 5413.0 | 48 |
| 5414.0 | 47 |
| 5415.0 | 46 |
| 5416.0 | 45 |
| 5417.0 | 44 |
| 5418.0 | 43 |
| 5419.0 | 44 |
| 5420.0 | 43 |
| 5421.0 | 44 |
| 5422.0 | 45 |
| 5423.0 | 44 |
| 5424.0 | 45 |
| 5425.0 | 44 |
| 5426.0 | 45 |
| 5427.0 | 46 |
| 5428.0 | 47 |
| 5429.0 | 46 |
| 5430.0 | 47 |
| 5431.0 | 48 |
| 5432.0 | 49 |
| 5433.0 | 48 |
| 5434.0 | 49 |
| 5435.0 | 48 |
| 5436.0 | 47 |
| 5437.0 | 48 |
| 5438.0 | 49 |
| 5439.0 | 50 |
| 5440.0 | 51 |
| 5441.0 | 52 |
| 5442.0 | 51 |
| 5443.0 | 50 |
| 5444.0 | 51 |
| 5445.0 | 52 |
| 5446.0 | 53 |
| 5447.0 | 52 |
| 5448.0 | 53 |
| 5449.0 | 52 |
| 5450.0 | 53 |
| 5451.0 | 54 |
| 5452.0 | 53 |
| 5453.0 | 52 |
| 5454.0 | 53 |
| 5455.0 | 52 |
| 5456.0 | 51 |
| 5457.0 | 50 |
| 5458.0 | 49 |
| 5459.0 | 50 |
| 5460.0 | 51 |
| 5461.0 | 50 |
| 5462.0 | 49 |
| 5463.0 | 50 |
| 5464.0 | 51 |
| 5465.0 | 50 |
| 5466.0 | 51 |
| 5467.0 | 50 |
| 5468.0 | 49 |
| 5469.0 | 48 |
| 5470.0 | 49 |
| 5471.0 | 48 |
| 5472.0 | 47 |
| 5473.0 | 46 |
| 5474.0 | 45 |
| 5475.0 | 44 |
| 5476.0 | 45 |
| 5477.0 | 46 |
| 5478.0 | 47 |
| 5479.0 | 46 |
| 5480.0 | 45 |
| 5481.0 | 46 |
| 5482.0 | 45 |
| 5483.0 | 46 |
| 5484.0 | 47 |
| 5485.0 | 48 |
| 5486.0 | 47 |
| 5487.0 | 48 |
| 5488.0 | 49 |
| 5489.0 | 50 |
| 5490.0 | 49 |
| 5491.0 | 50 |
| 5492.0 | 49 |
| 5493.0 | 50 |
| 5494.0 | 49 |
| 5495.0 | 48 |
| 5496.0 | 49 |
| 5497.0 | 50 |
| 5498.0 | 49 |
| 5499.0 | 50 |
| 5500.0 | 51 |
| 5501.0 | 52 |
| 5502.0 | 51 |
| 5503.0 | 50 |
| 5504.0 | 51 |
| 5505.0 | 52 |
| 5506.0 | 51 |
| 5507.0 | 52 |
| 5508.0 | 51 |
| 5509.0 | 52 |
| 5510.0 | 51 |
| 5511.0 | 50 |
| 5512.0 | 49 |
| 5513.0 | 48 |
| 5514.0 | 47 |
| 5515.0 | 46 |
| 5516.0 | 47 |
| 5517.0 | 48 |
| 5518.0 | 47 |
| 5519.0 | 46 |
| 5520.0 | 47 |
| 5521.0 | 46 |
| 5522.0 | 45 |
| 5523.0 | 46 |
| 5524.0 | 47 |
| 5525.0 | 46 |
| 5526.0 | 45 |
| 5527.0 | 44 |
| 5528.0 | 43 |
| 5529.0 | 44 |
| 5530.0 | 45 |
| 5531.0 | 44 |
| 5532.0 | 43 |
| 5533.0 | 42 |
| 5534.0 | 43 |
| 5535.0 | 44 |
| 5536.0 | 43 |
| 5537.0 | 42 |
| 5538.0 | 43 |
| 5539.0 | 42 |
| 5540.0 | 41 |
| 5541.0 | 42 |
| 5542.0 | 41 |
| 5543.0 | 40 |
| 5544.0 | 41 |
| 5545.0 | 42 |
| 5546.0 | 41 |
| 5547.0 | 42 |
| 5548.0 | 41 |
| 5549.0 | 42 |
| 5550.0 | 43 |
| 5551.0 | 44 |
| 5552.0 | 43 |
| 5553.0 | 44 |
| 5554.0 | 45 |
| 5555.0 | 46 |
| 5556.0 | 45 |
| 5557.0 | 44 |
| 5558.0 | 45 |
| 5559.0 | 46 |
| 5560.0 | 45 |
| 5561.0 | 46 |
| 5562.0 | 45 |
| 5563.0 | 44 |
| 5564.0 | 43 |
| 5565.0 | 42 |
| 5566.0 | 43 |
| 5567.0 | 44 |
| 5568.0 | 43 |
| 5569.0 | 42 |
| 5570.0 | 41 |
| 5571.0 | 40 |
| 5572.0 | 41 |
| 5573.0 | 40 |
| 5574.0 | 39 |
| 5575.0 | 40 |
| 5576.0 | 41 |
| 5577.0 | 42 |
| 5578.0 | 41 |
| 5579.0 | 42 |
| 5580.0 | 41 |
| 5581.0 | 40 |
| 5582.0 | 41 |
| 5583.0 | 40 |
| 5584.0 | 41 |
| 5585.0 | 42 |
| 5586.0 | 41 |
| 5587.0 | 42 |
| 5588.0 | 43 |
| 5589.0 | 42 |
| 5590.0 | 41 |
| 5591.0 | 42 |
| 5592.0 | 43 |
| 5593.0 | 44 |
| 5594.0 | 43 |
| 5595.0 | 42 |
| 5596.0 | 43 |
| 5597.0 | 42 |
| 5598.0 | 43 |
| 5599.0 | 42 |
| 5600.0 | 41 |
| 5601.0 | 42 |
| 5602.0 | 43 |
| 5603.0 | 42 |
| 5604.0 | 41 |
| 5605.0 | 40 |
| 5606.0 | 41 |
| 5607.0 | 40 |
| 5608.0 | 41 |
| 5609.0 | 40 |
| 5610.0 | 41 |
| 5611.0 | 42 |
| 5612.0 | 41 |
| 5613.0 | 40 |
| 5614.0 | 41 |
| 5615.0 | 42 |
| 5616.0 | 41 |
| 5617.0 | 42 |
| 5618.0 | 41 |
| 5619.0 | 40 |
| 5620.0 | 39 |
| 5621.0 | 40 |
| 5622.0 | 39 |
| 5623.0 | 40 |
| 5624.0 | 39 |
| 5625.0 | 38 |
| 5626.0 | 37 |
| 5627.0 | 38 |
| 5628.0 | 39 |
| 5629.0 | 38 |
| 5630.0 | 39 |
| 5631.0 | 40 |
| 5632.0 | 41 |
| 5633.0 | 40 |
| 5634.0 | 41 |
| 5635.0 | 40 |
| 5636.0 | 39 |
| 5637.0 | 38 |
| 5638.0 | 37 |
| 5639.0 | 38 |
| 5640.0 | 37 |
| 5641.0 | 36 |
| 5642.0 | 35 |
| 5643.0 | 34 |
| 5644.0 | 33 |
| 5645.0 | 34 |
| 5646.0 | 35 |
| 5647.0 | 36 |
| 5648.0 | 37 |
| 5649.0 | 38 |
| 5650.0 | 37 |
| 5651.0 | 38 |
| 5652.0 | 37 |
| 5653.0 | 36 |
| 5654.0 | 35 |
| 5655.0 | 34 |
| 5656.0 | 35 |
| 5657.0 | 36 |
| 5658.0 | 37 |
| 5659.0 | 36 |
| 5660.0 | 37 |
| 5661.0 | 36 |
| 5662.0 | 37 |
| 5663.0 | 36 |
| 5664.0 | 35 |
| 5665.0 | 34 |
| 5666.0 | 33 |
| 5667.0 | 34 |
| 5668.0 | 35 |
| 5669.0 | 36 |
| 5670.0 | 35 |
| 5671.0 | 36 |
| 5672.0 | 35 |
| 5673.0 | 36 |
| 5674.0 | 35 |
| 5675.0 | 36 |
| 5676.0 | 35 |
| 5677.0 | 34 |
| 5678.0 | 33 |
| 5679.0 | 34 |
| 5680.0 | 33 |
| 5681.0 | 32 |
| 5682.0 | 33 |
| 5683.0 | 32 |
| 5684.0 | 31 |
| 5685.0 | 32 |
| 5686.0 | 31 |
| 5687.0 | 30 |
| 5688.0 | 29 |
| 5689.0 | 28 |
| 5690.0 | 29 |
| 5691.0 | 30 |
| 5692.0 | 31 |
| 5693.0 | 30 |
| 5694.0 | 29 |
| 5695.0 | 28 |
| 5696.0 | 27 |
| 5697.0 | 28 |
| 5698.0 | 27 |
| 5699.0 | 28 |
| 5700.0 | 27 |
| 5701.0 | 28 |
| 5702.0 | 29 |
| 5703.0 | 28 |
| 5704.0 | 27 |
| 5705.0 | 28 |
| 5706.0 | 27 |
| 5707.0 | 26 |
| 5708.0 | 25 |
| 5709.0 | 24 |
| 5710.0 | 23 |
| 5711.0 | 22 |
| 5712.0 | 21 |
| 5713.0 | 20 |
| 5714.0 | 21 |
| 5715.0 | 22 |
| 5716.0 | 23 |
| 5717.0 | 22 |
| 5718.0 | 21 |
| 5719.0 | 20 |
| 5720.0 | 21 |
| 5721.0 | 20 |
| 5722.0 | 19 |
| 5723.0 | 18 |
| 5724.0 | 19 |
| 5725.0 | 20 |
| 5726.0 | 19 |
| 5727.0 | 20 |
| 5728.0 | 21 |
| 5729.0 | 22 |
| 5730.0 | 23 |
| 5731.0 | 22 |
| 5732.0 | 21 |
| 5733.0 | 22 |
| 5734.0 | 21 |
| 5735.0 | 20 |
| 5736.0 | 21 |
| 5737.0 | 20 |
| 5738.0 | 19 |
| 5739.0 | 20 |
| 5740.0 | 21 |
| 5741.0 | 20 |
| 5742.0 | 19 |
| 5743.0 | 18 |
| 5744.0 | 17 |
| 5745.0 | 16 |
| 5746.0 | 17 |
| 5747.0 | 18 |
| 5748.0 | 17 |
| 5749.0 | 16 |
| 5750.0 | 15 |
| 5751.0 | 14 |
| 5752.0 | 13 |
| 5753.0 | 14 |
| 5754.0 | 15 |
| 5755.0 | 14 |
| 5756.0 | 15 |
| 5757.0 | 14 |
| 5758.0 | 15 |
| 5759.0 | 16 |
| 5760.0 | 15 |
| 5761.0 | 14 |
| 5762.0 | 15 |
| 5763.0 | 16 |
| 5764.0 | 15 |
| 5765.0 | 16 |
| 5766.0 | 15 |
| 5767.0 | 16 |
| 5768.0 | 15 |
| 5769.0 | 14 |
| 5770.0 | 15 |
| 5771.0 | 16 |
| 5772.0 | 17 |
| 5773.0 | 18 |
| 5774.0 | 17 |
| 5775.0 | 16 |
| 5776.0 | 15 |
| 5777.0 | 16 |
| 5778.0 | 15 |
| 5779.0 | 16 |
| 5780.0 | 15 |
| 5781.0 | 14 |
| 5782.0 | 13 |
| 5783.0 | 12 |
| 5784.0 | 13 |
| 5785.0 | 14 |
| 5786.0 | 15 |
| 5787.0 | 14 |
| 5788.0 | 13 |
| 5789.0 | 12 |
| 5790.0 | 11 |
| 5791.0 | 12 |
| 5792.0 | 11 |
| 5793.0 | 10 |
| 5794.0 | 9 |
| 5795.0 | 10 |
| 5796.0 | 11 |
| 5797.0 | 12 |
| 5798.0 | 13 |
| 5799.0 | 12 |
| 5800.0 | 11 |
| 5801.0 | 12 |
| 5802.0 | 13 |
| 5803.0 | 12 |
| 5804.0 | 13 |
| 5805.0 | 12 |
| 5806.0 | 13 |
| 5807.0 | 12 |
| 5808.0 | 11 |
| 5809.0 | 12 |
| 5810.0 | 11 |
| 5811.0 | 12 |
| 5812.0 | 11 |
| 5813.0 | 10 |
| 5814.0 | 9 |
| 5815.0 | 8 |
| 5816.0 | 7 |
| 5817.0 | 8 |
| 5818.0 | 7 |
| 5819.0 | 6 |
| 5820.0 | 5 |
| 5821.0 | 4 |
| 5822.0 | 5 |
| 5823.0 | 4 |
| 5824.0 | 5 |
| 5825.0 | 4 |
| 5826.0 | 3 |
| 5827.0 | 4 |
| 5828.0 | 5 |
| 5829.0 | 6 |
| 5830.0 | 7 |
| 5831.0 | 6 |
| 5832.0 | 5 |
| 5833.0 | 4 |
| 5834.0 | 3 |
| 5835.0 | 4 |
| 5836.0 | 5 |
| 5837.0 | 6 |
| 5838.0 | 5 |
| 5839.0 | 6 |
| 5840.0 | 7 |
| 5841.0 | 8 |
| 5842.0 | 9 |
| 5843.0 | 8 |
| 5844.0 | 9 |
| 5845.0 | 8 |
| 5846.0 | 7 |
| 5847.0 | 8 |
| 5848.0 | 9 |
| 5849.0 | 8 |
| 5850.0 | 7 |
| 5851.0 | 6 |
| 5852.0 | 5 |
| 5853.0 | 6 |
| 5854.0 | 7 |
| 5855.0 | 6 |
| 5856.0 | 7 |
| 5857.0 | 8 |
| 5858.0 | 7 |
| 5859.0 | 8 |
| 5860.0 | 9 |
| 5861.0 | 8 |
| 5862.0 | 9 |
| 5863.0 | 10 |
| 5864.0 | 9 |
| 5865.0 | 10 |
| 5866.0 | 11 |
| 5867.0 | 12 |
| 5868.0 | 11 |
| 5869.0 | 12 |
| 5870.0 | 13 |
| 5871.0 | 12 |
| 5872.0 | 11 |
| 5873.0 | 12 |
| 5874.0 | 13 |
| 5875.0 | 12 |
| 5876.0 | 11 |
| 5877.0 | 10 |
| 5878.0 | 9 |
| 5879.0 | 8 |
| 5880.0 | 7 |
| 5881.0 | 8 |
| 5882.0 | 9 |
| 5883.0 | 10 |
| 5884.0 | 11 |
| 5885.0 | 10 |
| 5886.0 | 9 |
| 5887.0 | 10 |
| 5888.0 | 11 |
| 5889.0 | 12 |
| 5890.0 | 11 |
| 5891.0 | 12 |
| 5892.0 | 13 |
| 5893.0 | 14 |
| 5894.0 | 15 |
| 5895.0 | 14 |
| 5896.0 | 15 |
| 5897.0 | 16 |
| 5898.0 | 17 |
| 5899.0 | 18 |
| 5900.0 | 17 |
| 5901.0 | 16 |
| 5902.0 | 17 |
| 5903.0 | 18 |
| 5904.0 | 17 |
| 5905.0 | 18 |
| 5906.0 | 17 |
| 5907.0 | 18 |
| 5908.0 | 17 |
| 5909.0 | 18 |
| 5910.0 | 19 |
| 5911.0 | 20 |
| 5912.0 | 19 |
| 5913.0 | 20 |
| 5914.0 | 21 |
| 5915.0 | 22 |
| 5916.0 | 23 |
| 5917.0 | 22 |
| 5918.0 | 23 |
| 5919.0 | 24 |
| 5920.0 | 25 |
| 5921.0 | 26 |
| 5922.0 | 27 |
| 5923.0 | 26 |
| 5924.0 | 25 |
| 5925.0 | 24 |
| 5926.0 | 23 |
| 5927.0 | 22 |
| 5928.0 | 21 |
| 5929.0 | 22 |
| 5930.0 | 23 |
| 5931.0 | 24 |
| 5932.0 | 23 |
| 5933.0 | 24 |
| 5934.0 | 25 |
| 5935.0 | 26 |
| 5936.0 | 27 |
| 5937.0 | 26 |
| 5938.0 | 25 |
| 5939.0 | 26 |
| 5940.0 | 27 |
| 5941.0 | 26 |
| 5942.0 | 27 |
| 5943.0 | 28 |
| 5944.0 | 29 |
| 5945.0 | 30 |
| 5946.0 | 31 |
| 5947.0 | 32 |
| 5948.0 | 33 |
| 5949.0 | 32 |
| 5950.0 | 31 |
| 5951.0 | 32 |
| 5952.0 | 33 |
| 5953.0 | 34 |
| 5954.0 | 33 |
| 5955.0 | 34 |
| 5956.0 | 35 |
| 5957.0 | 34 |
| 5958.0 | 33 |
| 5959.0 | 34 |
| 5960.0 | 33 |
| 5961.0 | 32 |
| 5962.0 | 33 |
| 5963.0 | 32 |
| 5964.0 | 31 |
| 5965.0 | 30 |
| 5966.0 | 29 |
| 5967.0 | 30 |
| 5968.0 | 31 |
| 5969.0 | 32 |
| 5970.0 | 31 |
| 5971.0 | 32 |
| 5972.0 | 33 |
| 5973.0 | 34 |
| 5974.0 | 33 |
| 5975.0 | 34 |
| 5976.0 | 35 |
| 5977.0 | 36 |
| 5978.0 | 35 |
| 5979.0 | 34 |
| 5980.0 | 33 |
| 5981.0 | 34 |
| 5982.0 | 33 |
| 5983.0 | 34 |
| 5984.0 | 33 |
| 5985.0 | 34 |
| 5986.0 | 35 |
| 5987.0 | 34 |
| 5988.0 | 33 |
| 5989.0 | 34 |
| 5990.0 | 35 |
| 5991.0 | 34 |
| 5992.0 | 35 |
| 5993.0 | 34 |
| 5994.0 | 33 |
| 5995.0 | 32 |
| 5996.0 | 33 |
| 5997.0 | 32 |
| 5998.0 | 33 |
| 5999.0 | 34 |
| 6000.0 | 33 |
| 6001.0 | 32 |
| 6002.0 | 31 |
| 6003.0 | 32 |
| 6004.0 | 33 |
| 6005.0 | 34 |
| 6006.0 | 33 |
| 6007.0 | 32 |
| 6008.0 | 31 |
| 6009.0 | 30 |
| 6010.0 | 29 |
| 6011.0 | 28 |
| 6012.0 | 29 |
| 6013.0 | 30 |
| 6014.0 | 29 |
| 6015.0 | 30 |
| 6016.0 | 29 |
| 6017.0 | 30 |
| 6018.0 | 29 |
| 6019.0 | 28 |
| 6020.0 | 27 |
| 6021.0 | 28 |
| 6022.0 | 27 |
| 6023.0 | 26 |
| 6024.0 | 25 |
| 6025.0 | 26 |
| 6026.0 | 27 |
| 6027.0 | 26 |
| 6028.0 | 27 |
| 6029.0 | 26 |
| 6030.0 | 27 |
| 6031.0 | 28 |
| 6032.0 | 27 |
| 6033.0 | 26 |
| 6034.0 | 25 |
| 6035.0 | 26 |
| 6036.0 | 25 |
| 6037.0 | 24 |
| 6038.0 | 23 |
| 6039.0 | 22 |
| 6040.0 | 23 |
| 6041.0 | 24 |
| 6042.0 | 25 |
| 6043.0 | 26 |
| 6044.0 | 25 |
| 6045.0 | 26 |
| 6046.0 | 27 |
| 6047.0 | 28 |
| 6048.0 | 29 |
| 6049.0 | 28 |
| 6050.0 | 29 |
| 6051.0 | 30 |
| 6052.0 | 31 |
| 6053.0 | 30 |
| 6054.0 | 31 |
| 6055.0 | 30 |
| 6056.0 | 31 |
| 6057.0 | 32 |
| 6058.0 | 31 |
| 6059.0 | 30 |
| 6060.0 | 31 |
| 6061.0 | 30 |
| 6062.0 | 31 |
| 6063.0 | 32 |
| 6064.0 | 33 |
| 6065.0 | 32 |
| 6066.0 | 33 |
| 6067.0 | 32 |
| 6068.0 | 33 |
| 6069.0 | 32 |
| 6070.0 | 31 |
| 6071.0 | 30 |
| 6072.0 | 29 |
| 6073.0 | 28 |
| 6074.0 | 29 |
| 6075.0 | 30 |
| 6076.0 | 31 |
| 6077.0 | 30 |
| 6078.0 | 31 |
| 6079.0 | 30 |
| 6080.0 | 31 |
| 6081.0 | 30 |
| 6082.0 | 29 |
| 6083.0 | 28 |
| 6084.0 | 29 |
| 6085.0 | 30 |
| 6086.0 | 29 |
| 6087.0 | 28 |
| 6088.0 | 27 |
| 6089.0 | 28 |
| 6090.0 | 27 |
| 6091.0 | 26 |
| 6092.0 | 25 |
| 6093.0 | 24 |
| 6094.0 | 23 |
| 6095.0 | 24 |
| 6096.0 | 25 |
| 6097.0 | 24 |
| 6098.0 | 25 |
| 6099.0 | 24 |
| 6100.0 | 23 |
| 6101.0 | 24 |
| 6102.0 | 23 |
| 6103.0 | 22 |
| 6104.0 | 23 |
| 6105.0 | 22 |
| 6106.0 | 21 |
| 6107.0 | 20 |
| 6108.0 | 19 |
| 6109.0 | 18 |
| 6110.0 | 17 |
| 6111.0 | 16 |
| 6112.0 | 17 |
| 6113.0 | 16 |
| 6114.0 | 17 |
| 6115.0 | 18 |
| 6116.0 | 17 |
| 6117.0 | 18 |
| 6118.0 | 17 |
| 6119.0 | 18 |
| 6120.0 | 19 |
| 6121.0 | 18 |
| 6122.0 | 19 |
| 6123.0 | 18 |
| 6124.0 | 17 |
| 6125.0 | 16 |
| 6126.0 | 17 |
| 6127.0 | 16 |
| 6128.0 | 17 |
| 6129.0 | 18 |
| 6130.0 | 17 |
| 6131.0 | 18 |
| 6132.0 | 17 |
| 6133.0 | 18 |
| 6134.0 | 17 |
| 6135.0 | 18 |
| 6136.0 | 17 |
| 6137.0 | 18 |
| 6138.0 | 19 |
| 6139.0 | 20 |
| 6140.0 | 19 |
| 6141.0 | 18 |
| 6142.0 | 19 |
| 6143.0 | 18 |
| 6144.0 | 17 |
| 6145.0 | 16 |
| 6146.0 | 15 |
| 6147.0 | 16 |
| 6148.0 | 15 |
| 6149.0 | 16 |
| 6150.0 | 15 |
| 6151.0 | 14 |
| 6152.0 | 15 |
| 6153.0 | 14 |
| 6154.0 | 13 |
| 6155.0 | 12 |
| 6156.0 | 13 |
| 6157.0 | 14 |
| 6158.0 | 15 |
| 6159.0 | 16 |
| 6160.0 | 15 |
| 6161.0 | 14 |
| 6162.0 | 15 |
| 6163.0 | 14 |
| 6164.0 | 13 |
| 6165.0 | 14 |
| 6166.0 | 15 |
| 6167.0 | 16 |
| 6168.0 | 15 |
| 6169.0 | 16 |
| 6170.0 | 15 |
| 6171.0 | 16 |
| 6172.0 | 15 |
| 6173.0 | 14 |
| 6174.0 | 15 |
| 6175.0 | 16 |
| 6176.0 | 15 |
| 6177.0 | 16 |
| 6178.0 | 15 |
| 6179.0 | 16 |
| 6180.0 | 15 |
| 6181.0 | 16 |
| 6182.0 | 17 |
| 6183.0 | 16 |
| 6184.0 | 15 |
| 6185.0 | 14 |
| 6186.0 | 13 |
| 6187.0 | 12 |
| 6188.0 | 11 |
| 6189.0 | 12 |
| 6190.0 | 11 |
| 6191.0 | 10 |
| 6192.0 | 11 |
| 6193.0 | 10 |
| 6194.0 | 11 |
| 6195.0 | 10 |
| 6196.0 | 9 |
| 6197.0 | 8 |
| 6198.0 | 7 |
| 6199.0 | 8 |
| 6200.0 | 7 |
| 6201.0 | 6 |
| 6202.0 | 5 |
| 6203.0 | 4 |
| 6204.0 | 5 |
| 6205.0 | 4 |
| 6206.0 | 3 |
| 6207.0 | 4 |
| 6208.0 | 3 |
| 6209.0 | 4 |
| 6210.0 | 5 |
| 6211.0 | 6 |
| 6212.0 | 7 |
| 6213.0 | 6 |
| 6214.0 | 5 |
| 6215.0 | 4 |
| 6216.0 | 5 |
| 6217.0 | 4 |
| 6218.0 | 3 |
| 6219.0 | 2 |
| 6220.0 | 1 |
| 6221.0 | 2 |
| 6222.0 | 1 |
| 6223.0 | 2 |
| 6224.0 | 3 |
| 6225.0 | 4 |
| 6226.0 | 3 |
| 6227.0 | 2 |
| 6228.0 | 3 |
| 6229.0 | 4 |
| 6230.0 | 3 |
| 6231.0 | 4 |
| 6232.0 | 3 |
| 6233.0 | 4 |
| 6234.0 | 3 |
| 6235.0 | 4 |
| 6236.0 | 5 |
| 6237.0 | 6 |
| 6238.0 | 7 |
| 6239.0 | 6 |
| 6240.0 | 5 |
| 6241.0 | 6 |
| 6242.0 | 5 |
| 6243.0 | 4 |
| 6244.0 | 5 |
| 6245.0 | 6 |
| 6246.0 | 5 |
| 6247.0 | 6 |
| 6248.0 | 7 |
| 6249.0 | 8 |
| 6250.0 | 9 |
| 6251.0 | 8 |
| 6252.0 | 9 |
| 6253.0 | 10 |
| 6254.0 | 9 |
| 6255.0 | 8 |
| 6256.0 | 9 |
| 6257.0 | 8 |
| 6258.0 | 9 |
| 6259.0 | 8 |
| 6260.0 | 7 |
| 6261.0 | 8 |
| 6262.0 | 7 |
| 6263.0 | 8 |
| 6264.0 | 9 |
| 6265.0 | 10 |
| 6266.0 | 11 |
| 6267.0 | 10 |
| 6268.0 | 9 |
| 6269.0 | 8 |
| 6270.0 | 7 |
| 6271.0 | 8 |
| 6272.0 | 7 |
| 6273.0 | 8 |
| 6274.0 | 9 |
| 6275.0 | 8 |
| 6276.0 | 7 |
| 6277.0 | 6 |
| 6278.0 | 5 |
| 6279.0 | 6 |
| 6280.0 | 5 |
| 6281.0 | 6 |
| 6282.0 | 7 |
| 6283.0 | 8 |
| 6284.0 | 7 |
| 6285.0 | 8 |
| 6286.0 | 9 |
| 6287.0 | 10 |
| 6288.0 | 11 |
| 6289.0 | 10 |
| 6290.0 | 11 |
| 6291.0 | 10 |
| 6292.0 | 9 |
| 6293.0 | 10 |
| 6294.0 | 9 |
| 6295.0 | 10 |
| 6296.0 | 11 |
| 6297.0 | 12 |
| 6298.0 | 13 |
| 6299.0 | 14 |
| 6300.0 | 15 |
| 6301.0 | 14 |
| 6302.0 | 13 |
| 6303.0 | 12 |
| 6304.0 | 13 |
| 6305.0 | 12 |
| 6306.0 | 11 |
| 6307.0 | 10 |
| 6308.0 | 9 |
| 6309.0 | 8 |
| 6310.0 | 9 |
| 6311.0 | 8 |
| 6312.0 | 9 |
| 6313.0 | 8 |
| 6314.0 | 7 |
| 6315.0 | 6 |
| 6316.0 | 5 |
| 6317.0 | 6 |
| 6318.0 | 5 |
| 6319.0 | 4 |
| 6320.0 | 3 |
| 6321.0 | 2 |
| 6322.0 | 1 |
| 6323.0 | 2 |
| 6324.0 | 3 |
| 6325.0 | 2 |
| 6326.0 | 1 |
| 6327.0 | 0 |
| 6328.0 | -1 |
| 6329.0 | 0 |
| 6330.0 | -1 |
| 6331.0 | 0 |
| 6332.0 | 1 |
| 6333.0 | 0 |
| 6334.0 | 1 |
| 6335.0 | 0 |
| 6336.0 | 1 |
| 6337.0 | 2 |
| 6338.0 | 1 |
| 6339.0 | 0 |
| 6340.0 | -1 |
| 6341.0 | -2 |
| 6342.0 | -3 |
| 6343.0 | -2 |
| 6344.0 | -1 |
| 6345.0 | 0 |
| 6346.0 | -1 |
| 6347.0 | 0 |
| 6348.0 | -1 |
| 6349.0 | 0 |
| 6350.0 | 1 |
| 6351.0 | 2 |
| 6352.0 | 1 |
| 6353.0 | 2 |
| 6354.0 | 3 |
| 6355.0 | 4 |
| 6356.0 | 3 |
| 6357.0 | 2 |
| 6358.0 | 1 |
| 6359.0 | 0 |
| 6360.0 | 1 |
| 6361.0 | 2 |
| 6362.0 | 3 |
| 6363.0 | 2 |
| 6364.0 | 3 |
| 6365.0 | 4 |
| 6366.0 | 3 |
| 6367.0 | 2 |
| 6368.0 | 1 |
| 6369.0 | 2 |
| 6370.0 | 1 |
| 6371.0 | 2 |
| 6372.0 | 3 |
| 6373.0 | 4 |
| 6374.0 | 3 |
| 6375.0 | 2 |
| 6376.0 | 1 |
| 6377.0 | 0 |
| 6378.0 | 1 |
| 6379.0 | 0 |
| 6380.0 | -1 |
| 6381.0 | 0 |
| 6382.0 | 1 |
| 6383.0 | 0 |
| 6384.0 | -1 |
| 6385.0 | -2 |
| 6386.0 | -3 |
| 6387.0 | -4 |
| 6388.0 | -3 |
| 6389.0 | -2 |
| 6390.0 | -1 |
| 6391.0 | -2 |
| 6392.0 | -1 |
| 6393.0 | -2 |
| 6394.0 | -3 |
| 6395.0 | -2 |
| 6396.0 | -3 |
| 6397.0 | -2 |
| 6398.0 | -1 |
| 6399.0 | 0 |
| 6400.0 | -1 |
| 6401.0 | -2 |
| 6402.0 | -3 |
| 6403.0 | -2 |
| 6404.0 | -1 |
| 6405.0 | -2 |
| 6406.0 | -1 |
| 6407.0 | 0 |
| 6408.0 | 1 |
| 6409.0 | 2 |
| 6410.0 | 1 |
| 6411.0 | 2 |
| 6412.0 | 3 |
| 6413.0 | 2 |
| 6414.0 | 3 |
| 6415.0 | 4 |
| 6416.0 | 5 |
| 6417.0 | 6 |
| 6418.0 | 7 |
| 6419.0 | 8 |
| 6420.0 | 7 |
| 6421.0 | 6 |
| 6422.0 | 7 |
| 6423.0 | 8 |
| 6424.0 | 9 |
| 6425.0 | 8 |
| 6426.0 | 7 |
| 6427.0 | 8 |
| 6428.0 | 9 |
| 6429.0 | 8 |
| 6430.0 | 9 |
| 6431.0 | 10 |
| 6432.0 | 11 |
| 6433.0 | 12 |
| 6434.0 | 13 |
| 6435.0 | 12 |
| 6436.0 | 13 |
| 6437.0 | 14 |
| 6438.0 | 15 |
| 6439.0 | 16 |
| 6440.0 | 15 |
| 6441.0 | 14 |
| 6442.0 | 13 |
| 6443.0 | 12 |
| 6444.0 | 11 |
| 6445.0 | 12 |
| 6446.0 | 11 |
| 6447.0 | 10 |
| 6448.0 | 11 |
| 6449.0 | 12 |
| 6450.0 | 13 |
| 6451.0 | 12 |
| 6452.0 | 13 |
| 6453.0 | 14 |
| 6454.0 | 15 |
| 6455.0 | 14 |
| 6456.0 | 13 |
| 6457.0 | 14 |
| 6458.0 | 15 |
| 6459.0 | 16 |
| 6460.0 | 17 |
| 6461.0 | 18 |
| 6462.0 | 17 |
| 6463.0 | 18 |
| 6464.0 | 17 |
| 6465.0 | 16 |
| 6466.0 | 17 |
| 6467.0 | 18 |
| 6468.0 | 17 |
| 6469.0 | 16 |
| 6470.0 | 15 |
| 6471.0 | 14 |
| 6472.0 | 13 |
| 6473.0 | 12 |
| 6474.0 | 13 |
| 6475.0 | 12 |
| 6476.0 | 11 |
| 6477.0 | 10 |
| 6478.0 | 11 |
| 6479.0 | 12 |
| 6480.0 | 11 |
| 6481.0 | 12 |
| 6482.0 | 13 |
| 6483.0 | 14 |
| 6484.0 | 15 |
| 6485.0 | 14 |
| 6486.0 | 13 |
| 6487.0 | 14 |
| 6488.0 | 15 |
| 6489.0 | 16 |
| 6490.0 | 17 |
| 6491.0 | 16 |
| 6492.0 | 17 |
| 6493.0 | 18 |
| 6494.0 | 19 |
| 6495.0 | 18 |
| 6496.0 | 19 |
| 6497.0 | 18 |
| 6498.0 | 17 |
| 6499.0 | 16 |
| 6500.0 | 17 |
| 6501.0 | 16 |
| 6502.0 | 15 |
| 6503.0 | 14 |
| 6504.0 | 15 |
| 6505.0 | 14 |
| 6506.0 | 13 |
| 6507.0 | 14 |
| 6508.0 | 15 |
| 6509.0 | 14 |
| 6510.0 | 15 |
| 6511.0 | 16 |
| 6512.0 | 17 |
| 6513.0 | 18 |
| 6514.0 | 19 |
| 6515.0 | 20 |
| 6516.0 | 19 |
| 6517.0 | 20 |
| 6518.0 | 19 |
| 6519.0 | 18 |
| 6520.0 | 17 |
| 6521.0 | 16 |
| 6522.0 | 17 |
| 6523.0 | 16 |
| 6524.0 | 17 |
| 6525.0 | 18 |
| 6526.0 | 19 |
| 6527.0 | 20 |
| 6528.0 | 21 |
| 6529.0 | 22 |
| 6530.0 | 23 |
| 6531.0 | 22 |
| 6532.0 | 21 |
| 6533.0 | 22 |
| 6534.0 | 21 |
| 6535.0 | 22 |
| 6536.0 | 23 |
| 6537.0 | 24 |
| 6538.0 | 23 |
| 6539.0 | 22 |
| 6540.0 | 21 |
| 6541.0 | 20 |
| 6542.0 | 19 |
| 6543.0 | 18 |
| 6544.0 | 19 |
| 6545.0 | 18 |
| 6546.0 | 19 |
| 6547.0 | 18 |
| 6548.0 | 17 |
| 6549.0 | 18 |
| 6550.0 | 19 |
| 6551.0 | 20 |
| 6552.0 | 19 |
| 6553.0 | 20 |
| 6554.0 | 19 |
| 6555.0 | 18 |
| 6556.0 | 19 |
| 6557.0 | 20 |
| 6558.0 | 19 |
| 6559.0 | 18 |
| 6560.0 | 17 |
| 6561.0 | 18 |
| 6562.0 | 17 |
| 6563.0 | 18 |
| 6564.0 | 19 |
| 6565.0 | 20 |
| 6566.0 | 19 |
| 6567.0 | 20 |
| 6568.0 | 19 |
| 6569.0 | 18 |
| 6570.0 | 19 |
| 6571.0 | 20 |
| 6572.0 | 21 |
| 6573.0 | 20 |
| 6574.0 | 21 |
| 6575.0 | 20 |
| 6576.0 | 21 |
| 6577.0 | 20 |
| 6578.0 | 19 |
| 6579.0 | 20 |
| 6580.0 | 19 |
| 6581.0 | 20 |
| 6582.0 | 19 |
| 6583.0 | 20 |
| 6584.0 | 21 |
| 6585.0 | 20 |
| 6586.0 | 21 |
| 6587.0 | 22 |
| 6588.0 | 23 |
| 6589.0 | 24 |
| 6590.0 | 25 |
| 6591.0 | 24 |
| 6592.0 | 23 |
| 6593.0 | 24 |
| 6594.0 | 25 |
| 6595.0 | 24 |
| 6596.0 | 23 |
| 6597.0 | 24 |
| 6598.0 | 23 |
| 6599.0 | 24 |
| 6600.0 | 25 |
| 6601.0 | 26 |
| 6602.0 | 25 |
| 6603.0 | 26 |
| 6604.0 | 25 |
| 6605.0 | 26 |
| 6606.0 | 25 |
| 6607.0 | 24 |
| 6608.0 | 25 |
| 6609.0 | 24 |
| 6610.0 | 25 |
| 6611.0 | 24 |
| 6612.0 | 25 |
| 6613.0 | 24 |
| 6614.0 | 25 |
| 6615.0 | 24 |
| 6616.0 | 23 |
| 6617.0 | 22 |
| 6618.0 | 23 |
| 6619.0 | 24 |
| 6620.0 | 25 |
| 6621.0 | 24 |
| 6622.0 | 25 |
| 6623.0 | 26 |
| 6624.0 | 25 |
| 6625.0 | 24 |
| 6626.0 | 25 |
| 6627.0 | 26 |
| 6628.0 | 27 |
| 6629.0 | 26 |
| 6630.0 | 25 |
| 6631.0 | 26 |
| 6632.0 | 25 |
| 6633.0 | 26 |
| 6634.0 | 27 |
| 6635.0 | 28 |
| 6636.0 | 27 |
| 6637.0 | 28 |
| 6638.0 | 29 |
| 6639.0 | 30 |
| 6640.0 | 29 |
| 6641.0 | 28 |
| 6642.0 | 27 |
| 6643.0 | 28 |
| 6644.0 | 29 |
| 6645.0 | 28 |
| 6646.0 | 27 |
| 6647.0 | 28 |
| 6648.0 | 27 |
| 6649.0 | 26 |
| 6650.0 | 25 |
| 6651.0 | 26 |
| 6652.0 | 27 |
| 6653.0 | 28 |
| 6654.0 | 29 |
| 6655.0 | 30 |
| 6656.0 | 31 |
| 6657.0 | 30 |
| 6658.0 | 29 |
| 6659.0 | 28 |
| 6660.0 | 27 |
| 6661.0 | 26 |
| 6662.0 | 27 |
| 6663.0 | 26 |
| 6664.0 | 25 |
| 6665.0 | 24 |
| 6666.0 | 25 |
| 6667.0 | 24 |
| 6668.0 | 25 |
| 6669.0 | 26 |
| 6670.0 | 25 |
| 6671.0 | 26 |
| 6672.0 | 25 |
| 6673.0 | 24 |
| 6674.0 | 25 |
| 6675.0 | 26 |
| 6676.0 | 25 |
| 6677.0 | 26 |
| 6678.0 | 25 |
| 6679.0 | 26 |
| 6680.0 | 27 |
| 6681.0 | 28 |
| 6682.0 | 27 |
| 6683.0 | 28 |
| 6684.0 | 29 |
| 6685.0 | 30 |
| 6686.0 | 29 |
| 6687.0 | 30 |
| 6688.0 | 31 |
| 6689.0 | 30 |
| 6690.0 | 29 |
| 6691.0 | 28 |
| 6692.0 | 27 |
| 6693.0 | 28 |
| 6694.0 | 29 |
| 6695.0 | 30 |
| 6696.0 | 29 |
| 6697.0 | 28 |
| 6698.0 | 29 |
| 6699.0 | 28 |
| 6700.0 | 29 |
| 6701.0 | 30 |
| 6702.0 | 29 |
| 6703.0 | 30 |
| 6704.0 | 31 |
| 6705.0 | 32 |
| 6706.0 | 33 |
| 6707.0 | 32 |
| 6708.0 | 33 |
| 6709.0 | 32 |
| 6710.0 | 31 |
| 6711.0 | 30 |
| 6712.0 | 31 |
| 6713.0 | 32 |
| 6714.0 | 31 |
| 6715.0 | 30 |
| 6716.0 | 31 |
| 6717.0 | 30 |
| 6718.0 | 29 |
| 6719.0 | 28 |
| 6720.0 | 27 |
| 6721.0 | 28 |
| 6722.0 | 29 |
| 6723.0 | 28 |
| 6724.0 | 27 |
| 6725.0 | 26 |
| 6726.0 | 25 |
| 6727.0 | 26 |
| 6728.0 | 25 |
| 6729.0 | 24 |
| 6730.0 | 25 |
| 6731.0 | 26 |
| 6732.0 | 27 |
| 6733.0 | 26 |
| 6734.0 | 25 |
| 6735.0 | 24 |
| 6736.0 | 25 |
| 6737.0 | 24 |
| 6738.0 | 25 |
| 6739.0 | 24 |
| 6740.0 | 23 |
| 6741.0 | 22 |
| 6742.0 | 21 |
| 6743.0 | 20 |
| 6744.0 | 21 |
| 6745.0 | 20 |
| 6746.0 | 19 |
| 6747.0 | 18 |
| 6748.0 | 17 |
| 6749.0 | 16 |
| 6750.0 | 17 |
| 6751.0 | 18 |
| 6752.0 | 17 |
| 6753.0 | 16 |
| 6754.0 | 15 |
| 6755.0 | 14 |
| 6756.0 | 13 |
| 6757.0 | 14 |
| 6758.0 | 13 |
| 6759.0 | 12 |
| 6760.0 | 11 |
| 6761.0 | 10 |
| 6762.0 | 9 |
| 6763.0 | 8 |
| 6764.0 | 7 |
| 6765.0 | 6 |
| 6766.0 | 5 |
| 6767.0 | 4 |
| 6768.0 | 3 |
| 6769.0 | 4 |
| 6770.0 | 5 |
| 6771.0 | 4 |
| 6772.0 | 3 |
| 6773.0 | 4 |
| 6774.0 | 5 |
| 6775.0 | 4 |
| 6776.0 | 5 |
| 6777.0 | 4 |
| 6778.0 | 5 |
| 6779.0 | 6 |
| 6780.0 | 5 |
| 6781.0 | 4 |
| 6782.0 | 5 |
| 6783.0 | 6 |
| 6784.0 | 5 |
| 6785.0 | 6 |
| 6786.0 | 7 |
| 6787.0 | 6 |
| 6788.0 | 5 |
| 6789.0 | 4 |
| 6790.0 | 5 |
| 6791.0 | 6 |
| 6792.0 | 5 |
| 6793.0 | 4 |
| 6794.0 | 5 |
| 6795.0 | 4 |
| 6796.0 | 5 |
| 6797.0 | 4 |
| 6798.0 | 5 |
| 6799.0 | 4 |
| 6800.0 | 5 |
| 6801.0 | 6 |
| 6802.0 | 5 |
| 6803.0 | 6 |
| 6804.0 | 5 |
| 6805.0 | 6 |
| 6806.0 | 7 |
| 6807.0 | 8 |
| 6808.0 | 7 |
| 6809.0 | 8 |
| 6810.0 | 9 |
| 6811.0 | 8 |
| 6812.0 | 7 |
| 6813.0 | 8 |
| 6814.0 | 7 |
| 6815.0 | 8 |
| 6816.0 | 7 |
| 6817.0 | 6 |
| 6818.0 | 7 |
| 6819.0 | 6 |
| 6820.0 | 7 |
| 6821.0 | 6 |
| 6822.0 | 7 |
| 6823.0 | 6 |
| 6824.0 | 7 |
| 6825.0 | 6 |
| 6826.0 | 7 |
| 6827.0 | 8 |
| 6828.0 | 9 |
| 6829.0 | 10 |
| 6830.0 | 9 |
| 6831.0 | 8 |
| 6832.0 | 7 |
| 6833.0 | 8 |
| 6834.0 | 7 |
| 6835.0 | 8 |
| 6836.0 | 9 |
| 6837.0 | 8 |
| 6838.0 | 7 |
| 6839.0 | 8 |
| 6840.0 | 9 |
| 6841.0 | 8 |
| 6842.0 | 7 |
| 6843.0 | 8 |
| 6844.0 | 7 |
| 6845.0 | 8 |
| 6846.0 | 9 |
| 6847.0 | 8 |
| 6848.0 | 7 |
| 6849.0 | 6 |
| 6850.0 | 7 |
| 6851.0 | 8 |
| 6852.0 | 7 |
| 6853.0 | 6 |
| 6854.0 | 5 |
| 6855.0 | 6 |
| 6856.0 | 7 |
| 6857.0 | 8 |
| 6858.0 | 7 |
| 6859.0 | 6 |
| 6860.0 | 7 |
| 6861.0 | 6 |
| 6862.0 | 5 |
| 6863.0 | 4 |
| 6864.0 | 5 |
| 6865.0 | 4 |
| 6866.0 | 5 |
| 6867.0 | 6 |
| 6868.0 | 7 |
| 6869.0 | 8 |
| 6870.0 | 9 |
| 6871.0 | 8 |
| 6872.0 | 7 |
| 6873.0 | 8 |
| 6874.0 | 7 |
| 6875.0 | 8 |
| 6876.0 | 9 |
| 6877.0 | 10 |
| 6878.0 | 11 |
| 6879.0 | 10 |
| 6880.0 | 9 |
| 6881.0 | 8 |
| 6882.0 | 7 |
| 6883.0 | 6 |
| 6884.0 | 7 |
| 6885.0 | 6 |
| 6886.0 | 5 |
| 6887.0 | 6 |
| 6888.0 | 7 |
| 6889.0 | 8 |
| 6890.0 | 7 |
| 6891.0 | 6 |
| 6892.0 | 7 |
| 6893.0 | 8 |
| 6894.0 | 7 |
| 6895.0 | 6 |
| 6896.0 | 5 |
| 6897.0 | 4 |
| 6898.0 | 5 |
| 6899.0 | 4 |
| 6900.0 | 5 |
| 6901.0 | 6 |
| 6902.0 | 7 |
| 6903.0 | 8 |
| 6904.0 | 7 |
| 6905.0 | 8 |
| 6906.0 | 7 |
| 6907.0 | 8 |
| 6908.0 | 7 |
| 6909.0 | 6 |
| 6910.0 | 5 |
| 6911.0 | 4 |
| 6912.0 | 3 |
| 6913.0 | 4 |
| 6914.0 | 5 |
| 6915.0 | 4 |
| 6916.0 | 3 |
| 6917.0 | 4 |
| 6918.0 | 5 |
| 6919.0 | 6 |
| 6920.0 | 5 |
| 6921.0 | 4 |
| 6922.0 | 5 |
| 6923.0 | 4 |
| 6924.0 | 3 |
| 6925.0 | 4 |
| 6926.0 | 3 |
| 6927.0 | 4 |
| 6928.0 | 5 |
| 6929.0 | 6 |
| 6930.0 | 5 |
| 6931.0 | 4 |
| 6932.0 | 5 |
| 6933.0 | 6 |
| 6934.0 | 7 |
| 6935.0 | 8 |
| 6936.0 | 7 |
| 6937.0 | 8 |
| 6938.0 | 7 |
| 6939.0 | 8 |
| 6940.0 | 9 |
| 6941.0 | 10 |
| 6942.0 | 11 |
| 6943.0 | 10 |
| 6944.0 | 11 |
| 6945.0 | 10 |
| 6946.0 | 11 |
| 6947.0 | 12 |
| 6948.0 | 11 |
| 6949.0 | 10 |
| 6950.0 | 9 |
| 6951.0 | 8 |
| 6952.0 | 9 |
| 6953.0 | 8 |
| 6954.0 | 7 |
| 6955.0 | 6 |
| 6956.0 | 5 |
| 6957.0 | 4 |
| 6958.0 | 3 |
| 6959.0 | 4 |
| 6960.0 | 5 |
| 6961.0 | 6 |
| 6962.0 | 5 |
| 6963.0 | 4 |
| 6964.0 | 3 |
| 6965.0 | 2 |
| 6966.0 | 3 |
| 6967.0 | 4 |
| 6968.0 | 3 |
| 6969.0 | 2 |
| 6970.0 | 3 |
| 6971.0 | 4 |
| 6972.0 | 5 |
| 6973.0 | 6 |
| 6974.0 | 5 |
| 6975.0 | 6 |
| 6976.0 | 5 |
| 6977.0 | 4 |
| 6978.0 | 5 |
| 6979.0 | 6 |
| 6980.0 | 7 |
| 6981.0 | 8 |
| 6982.0 | 7 |
| 6983.0 | 8 |
| 6984.0 | 9 |
| 6985.0 | 8 |
| 6986.0 | 9 |
| 6987.0 | 10 |
| 6988.0 | 11 |
| 6989.0 | 12 |
| 6990.0 | 11 |
| 6991.0 | 10 |
| 6992.0 | 11 |
| 6993.0 | 10 |
| 6994.0 | 9 |
| 6995.0 | 8 |
| 6996.0 | 7 |
| 6997.0 | 6 |
| 6998.0 | 7 |
| 6999.0 | 6 |
| 7000.0 | 5 |
| 7001.0 | 4 |
| 7002.0 | 5 |
| 7003.0 | 4 |
| 7004.0 | 5 |
| 7005.0 | 6 |
| 7006.0 | 5 |
| 7007.0 | 6 |
| 7008.0 | 7 |
| 7009.0 | 8 |
| 7010.0 | 9 |
| 7011.0 | 10 |
| 7012.0 | 9 |
| 7013.0 | 8 |
| 7014.0 | 7 |
| 7015.0 | 6 |
| 7016.0 | 7 |
| 7017.0 | 8 |
| 7018.0 | 7 |
| 7019.0 | 8 |
| 7020.0 | 7 |
| 7021.0 | 6 |
| 7022.0 | 7 |
| 7023.0 | 6 |
| 7024.0 | 5 |
| 7025.0 | 4 |
| 7026.0 | 3 |
| 7027.0 | 4 |
| 7028.0 | 5 |
| 7029.0 | 6 |
| 7030.0 | 5 |
| 7031.0 | 6 |
| 7032.0 | 7 |
| 7033.0 | 8 |
| 7034.0 | 7 |
| 7035.0 | 8 |
| 7036.0 | 9 |
| 7037.0 | 8 |
| 7038.0 | 7 |
| 7039.0 | 8 |
| 7040.0 | 9 |
| 7041.0 | 8 |
| 7042.0 | 7 |
| 7043.0 | 6 |
| 7044.0 | 5 |
| 7045.0 | 6 |
| 7046.0 | 5 |
| 7047.0 | 6 |
| 7048.0 | 7 |
| 7049.0 | 8 |
| 7050.0 | 7 |
| 7051.0 | 6 |
| 7052.0 | 7 |
| 7053.0 | 6 |
| 7054.0 | 7 |
| 7055.0 | 8 |
| 7056.0 | 7 |
| 7057.0 | 6 |
| 7058.0 | 7 |
| 7059.0 | 6 |
| 7060.0 | 5 |
| 7061.0 | 6 |
| 7062.0 | 5 |
| 7063.0 | 6 |
| 7064.0 | 7 |
| 7065.0 | 8 |
| 7066.0 | 9 |
| 7067.0 | 8 |
| 7068.0 | 9 |
| 7069.0 | 8 |
| 7070.0 | 9 |
| 7071.0 | 8 |
| 7072.0 | 7 |
| 7073.0 | 8 |
| 7074.0 | 7 |
| 7075.0 | 8 |
| 7076.0 | 7 |
| 7077.0 | 8 |
| 7078.0 | 9 |
| 7079.0 | 8 |
| 7080.0 | 7 |
| 7081.0 | 8 |
| 7082.0 | 7 |
| 7083.0 | 6 |
| 7084.0 | 5 |
| 7085.0 | 4 |
| 7086.0 | 3 |
| 7087.0 | 2 |
| 7088.0 | 3 |
| 7089.0 | 2 |
| 7090.0 | 1 |
| 7091.0 | 0 |
| 7092.0 | -1 |
| 7093.0 | 0 |
| 7094.0 | -1 |
| 7095.0 | -2 |
| 7096.0 | -3 |
| 7097.0 | -4 |
| 7098.0 | -5 |
| 7099.0 | -6 |
| 7100.0 | -7 |
| 7101.0 | -6 |
| 7102.0 | -5 |
| 7103.0 | -6 |
| 7104.0 | -5 |
| 7105.0 | -6 |
| 7106.0 | -7 |
| 7107.0 | -8 |
| 7108.0 | -9 |
| 7109.0 | -10 |
| 7110.0 | -9 |
| 7111.0 | -8 |
| 7112.0 | -7 |
| 7113.0 | -8 |
| 7114.0 | -9 |
| 7115.0 | -10 |
| 7116.0 | -11 |
| 7117.0 | -10 |
| 7118.0 | -11 |
| 7119.0 | -10 |
| 7120.0 | -9 |
| 7121.0 | -10 |
| 7122.0 | -9 |
| 7123.0 | -10 |
| 7124.0 | -11 |
| 7125.0 | -12 |
| 7126.0 | -11 |
| 7127.0 | -10 |
| 7128.0 | -11 |
| 7129.0 | -10 |
| 7130.0 | -9 |
| 7131.0 | -10 |
| 7132.0 | -9 |
| 7133.0 | -8 |
| 7134.0 | -9 |
| 7135.0 | -10 |
| 7136.0 | -9 |
| 7137.0 | -8 |
| 7138.0 | -9 |
| 7139.0 | -8 |
| 7140.0 | -9 |
| 7141.0 | -10 |
| 7142.0 | -11 |
| 7143.0 | -12 |
| 7144.0 | -13 |
| 7145.0 | -14 |
| 7146.0 | -15 |
| 7147.0 | -14 |
| 7148.0 | -15 |
| 7149.0 | -16 |
| 7150.0 | -17 |
| 7151.0 | -16 |
| 7152.0 | -15 |
| 7153.0 | -14 |
| 7154.0 | -13 |
| 7155.0 | -14 |
| 7156.0 | -13 |
| 7157.0 | -14 |
| 7158.0 | -15 |
| 7159.0 | -16 |
| 7160.0 | -17 |
| 7161.0 | -16 |
| 7162.0 | -15 |
| 7163.0 | -16 |
| 7164.0 | -15 |
| 7165.0 | -14 |
| 7166.0 | -15 |
| 7167.0 | -14 |
| 7168.0 | -15 |
| 7169.0 | -14 |
| 7170.0 | -13 |
| 7171.0 | -12 |
| 7172.0 | -13 |
| 7173.0 | -14 |
| 7174.0 | -15 |
| 7175.0 | -16 |
| 7176.0 | -17 |
| 7177.0 | -18 |
| 7178.0 | -19 |
| 7179.0 | -20 |
| 7180.0 | -21 |
| 7181.0 | -22 |
| 7182.0 | -21 |
| 7183.0 | -22 |
| 7184.0 | -23 |
| 7185.0 | -22 |
| 7186.0 | -21 |
| 7187.0 | -22 |
| 7188.0 | -23 |
| 7189.0 | -24 |
| 7190.0 | -23 |
| 7191.0 | -24 |
| 7192.0 | -23 |
| 7193.0 | -22 |
| 7194.0 | -23 |
| 7195.0 | -24 |
| 7196.0 | -25 |
| 7197.0 | -26 |
| 7198.0 | -25 |
| 7199.0 | -26 |
| 7200.0 | -25 |
| 7201.0 | -26 |
| 7202.0 | -27 |
| 7203.0 | -28 |
| 7204.0 | -27 |
| 7205.0 | -28 |
| 7206.0 | -27 |
| 7207.0 | -26 |
| 7208.0 | -25 |
| 7209.0 | -26 |
| 7210.0 | -27 |
| 7211.0 | -26 |
| 7212.0 | -25 |
| 7213.0 | -26 |
| 7214.0 | -25 |
| 7215.0 | -24 |
| 7216.0 | -23 |
| 7217.0 | -24 |
| 7218.0 | -23 |
| 7219.0 | -24 |
| 7220.0 | -25 |
| 7221.0 | -24 |
| 7222.0 | -25 |
| 7223.0 | -24 |
| 7224.0 | -23 |
| 7225.0 | -22 |
| 7226.0 | -23 |
| 7227.0 | -22 |
| 7228.0 | -23 |
| 7229.0 | -24 |
| 7230.0 | -25 |
| 7231.0 | -24 |
| 7232.0 | -23 |
| 7233.0 | -24 |
| 7234.0 | -25 |
| 7235.0 | -26 |
| 7236.0 | -27 |
| 7237.0 | -28 |
| 7238.0 | -27 |
| 7239.0 | -28 |
| 7240.0 | -27 |
| 7241.0 | -28 |
| 7242.0 | -27 |
| 7243.0 | -26 |
| 7244.0 | -25 |
| 7245.0 | -26 |
| 7246.0 | -27 |
| 7247.0 | -28 |
| 7248.0 | -29 |
| 7249.0 | -28 |
| 7250.0 | -29 |
| 7251.0 | -30 |
| 7252.0 | -29 |
| 7253.0 | -28 |
| 7254.0 | -29 |
| 7255.0 | -30 |
| 7256.0 | -29 |
| 7257.0 | -28 |
| 7258.0 | -27 |
| 7259.0 | -28 |
| 7260.0 | -29 |
| 7261.0 | -28 |
| 7262.0 | -27 |
| 7263.0 | -28 |
| 7264.0 | -29 |
| 7265.0 | -30 |
| 7266.0 | -31 |
| 7267.0 | -32 |
| 7268.0 | -31 |
| 7269.0 | -30 |
| 7270.0 | -31 |
| 7271.0 | -30 |
| 7272.0 | -29 |
| 7273.0 | -30 |
| 7274.0 | -31 |
| 7275.0 | -32 |
| 7276.0 | -33 |
| 7277.0 | -32 |
| 7278.0 | -31 |
| 7279.0 | -30 |
| 7280.0 | -29 |
| 7281.0 | -28 |
| 7282.0 | -27 |
| 7283.0 | -26 |
| 7284.0 | -27 |
| 7285.0 | -28 |
| 7286.0 | -27 |
| 7287.0 | -28 |
| 7288.0 | -29 |
| 7289.0 | -30 |
| 7290.0 | -29 |
| 7291.0 | -30 |
| 7292.0 | -31 |
| 7293.0 | -32 |
| 7294.0 | -33 |
| 7295.0 | -32 |
| 7296.0 | -31 |
| 7297.0 | -30 |
| 7298.0 | -31 |
| 7299.0 | -30 |
| 7300.0 | -29 |
| 7301.0 | -28 |
| 7302.0 | -29 |
| 7303.0 | -28 |
| 7304.0 | -27 |
| 7305.0 | -28 |
| 7306.0 | -29 |
| 7307.0 | -28 |
| 7308.0 | -27 |
| 7309.0 | -28 |
| 7310.0 | -29 |
| 7311.0 | -28 |
| 7312.0 | -29 |
| 7313.0 | -30 |
| 7314.0 | -31 |
| 7315.0 | -32 |
| 7316.0 | -31 |
| 7317.0 | -32 |
| 7318.0 | -33 |
| 7319.0 | -34 |
| 7320.0 | -35 |
| 7321.0 | -34 |
| 7322.0 | -35 |
| 7323.0 | -34 |
| 7324.0 | -33 |
| 7325.0 | -32 |
| 7326.0 | -33 |
| 7327.0 | -32 |
| 7328.0 | -33 |
| 7329.0 | -34 |
| 7330.0 | -33 |
| 7331.0 | -34 |
| 7332.0 | -35 |
| 7333.0 | -34 |
| 7334.0 | -33 |
| 7335.0 | -32 |
| 7336.0 | -33 |
| 7337.0 | -32 |
| 7338.0 | -33 |
| 7339.0 | -32 |
| 7340.0 | -31 |
| 7341.0 | -32 |
| 7342.0 | -33 |
| 7343.0 | -34 |
| 7344.0 | -33 |
| 7345.0 | -34 |
| 7346.0 | -35 |
| 7347.0 | -34 |
| 7348.0 | -35 |
| 7349.0 | -34 |
| 7350.0 | -33 |
| 7351.0 | -32 |
| 7352.0 | -31 |
| 7353.0 | -30 |
| 7354.0 | -31 |
| 7355.0 | -32 |
| 7356.0 | -31 |
| 7357.0 | -30 |
| 7358.0 | -31 |
| 7359.0 | -32 |
| 7360.0 | -31 |
| 7361.0 | -32 |
| 7362.0 | -33 |
| 7363.0 | -32 |
| 7364.0 | -33 |
| 7365.0 | -34 |
| 7366.0 | -33 |
| 7367.0 | -34 |
| 7368.0 | -33 |
| 7369.0 | -32 |
| 7370.0 | -31 |
| 7371.0 | -32 |
| 7372.0 | -31 |
| 7373.0 | -32 |
| 7374.0 | -33 |
| 7375.0 | -34 |
| 7376.0 | -35 |
| 7377.0 | -36 |
| 7378.0 | -35 |
| 7379.0 | -36 |
| 7380.0 | -35 |
| 7381.0 | -34 |
| 7382.0 | -33 |
| 7383.0 | -34 |
| 7384.0 | -33 |
| 7385.0 | -34 |
| 7386.0 | -35 |
| 7387.0 | -36 |
| 7388.0 | -37 |
| 7389.0 | -38 |
| 7390.0 | -39 |
| 7391.0 | -40 |
| 7392.0 | -41 |
| 7393.0 | -42 |
| 7394.0 | -41 |
| 7395.0 | -40 |
| 7396.0 | -41 |
| 7397.0 | -40 |
| 7398.0 | -39 |
| 7399.0 | -38 |
| 7400.0 | -37 |
| 7401.0 | -36 |
| 7402.0 | -37 |
| 7403.0 | -38 |
| 7404.0 | -39 |
| 7405.0 | -40 |
| 7406.0 | -41 |
| 7407.0 | -40 |
| 7408.0 | -39 |
| 7409.0 | -40 |
| 7410.0 | -41 |
| 7411.0 | -42 |
| 7412.0 | -41 |
| 7413.0 | -40 |
| 7414.0 | -39 |
| 7415.0 | -38 |
| 7416.0 | -37 |
| 7417.0 | -38 |
| 7418.0 | -37 |
| 7419.0 | -36 |
| 7420.0 | -35 |
| 7421.0 | -34 |
| 7422.0 | -35 |
| 7423.0 | -36 |
| 7424.0 | -35 |
| 7425.0 | -34 |
| 7426.0 | -33 |
| 7427.0 | -32 |
| 7428.0 | -31 |
| 7429.0 | -30 |
| 7430.0 | -29 |
| 7431.0 | -28 |
| 7432.0 | -29 |
| 7433.0 | -30 |
| 7434.0 | -31 |
| 7435.0 | -32 |
| 7436.0 | -31 |
| 7437.0 | -30 |
| 7438.0 | -29 |
| 7439.0 | -30 |
| 7440.0 | -31 |
| 7441.0 | -30 |
| 7442.0 | -31 |
| 7443.0 | -32 |
| 7444.0 | -33 |
| 7445.0 | -34 |
| 7446.0 | -33 |
| 7447.0 | -32 |
| 7448.0 | -33 |
| 7449.0 | -34 |
| 7450.0 | -35 |
| 7451.0 | -34 |
| 7452.0 | -33 |
| 7453.0 | -32 |
| 7454.0 | -31 |
| 7455.0 | -30 |
| 7456.0 | -31 |
| 7457.0 | -32 |
| 7458.0 | -33 |
| 7459.0 | -34 |
| 7460.0 | -33 |
| 7461.0 | -34 |
| 7462.0 | -35 |
| 7463.0 | -36 |
| 7464.0 | -37 |
| 7465.0 | -38 |
| 7466.0 | -37 |
| 7467.0 | -36 |
| 7468.0 | -35 |
| 7469.0 | -34 |
| 7470.0 | -35 |
| 7471.0 | -34 |
| 7472.0 | -35 |
| 7473.0 | -36 |
| 7474.0 | -37 |
| 7475.0 | -38 |
| 7476.0 | -39 |
| 7477.0 | -38 |
| 7478.0 | -37 |
| 7479.0 | -36 |
| 7480.0 | -37 |
| 7481.0 | -36 |
| 7482.0 | -35 |
| 7483.0 | -34 |
| 7484.0 | -35 |
| 7485.0 | -36 |
| 7486.0 | -35 |
| 7487.0 | -34 |
| 7488.0 | -33 |
| 7489.0 | -32 |
| 7490.0 | -31 |
| 7491.0 | -30 |
| 7492.0 | -29 |
| 7493.0 | -30 |
| 7494.0 | -29 |
| 7495.0 | -30 |
| 7496.0 | -31 |
| 7497.0 | -30 |
| 7498.0 | -29 |
| 7499.0 | -30 |
| 7500.0 | -29 |
| 7501.0 | -28 |
| 7502.0 | -27 |
| 7503.0 | -28 |
| 7504.0 | -29 |
| 7505.0 | -30 |
| 7506.0 | -29 |
| 7507.0 | -30 |
| 7508.0 | -31 |
| 7509.0 | -32 |
| 7510.0 | -31 |
| 7511.0 | -32 |
| 7512.0 | -31 |
| 7513.0 | -32 |
| 7514.0 | -33 |
| 7515.0 | -34 |
| 7516.0 | -35 |
| 7517.0 | -34 |
| 7518.0 | -35 |
| 7519.0 | -34 |
| 7520.0 | -33 |
| 7521.0 | -32 |
| 7522.0 | -31 |
| 7523.0 | -32 |
| 7524.0 | -31 |
| 7525.0 | -30 |
| 7526.0 | -31 |
| 7527.0 | -32 |
| 7528.0 | -33 |
| 7529.0 | -34 |
| 7530.0 | -35 |
| 7531.0 | -36 |
| 7532.0 | -35 |
| 7533.0 | -36 |
| 7534.0 | -37 |
| 7535.0 | -38 |
| 7536.0 | -39 |
| 7537.0 | -40 |
| 7538.0 | -41 |
| 7539.0 | -40 |
| 7540.0 | -41 |
| 7541.0 | -40 |
| 7542.0 | -41 |
| 7543.0 | -42 |
| 7544.0 | -43 |
| 7545.0 | -42 |
| 7546.0 | -41 |
| 7547.0 | -40 |
| 7548.0 | -41 |
| 7549.0 | -42 |
| 7550.0 | -43 |
| 7551.0 | -44 |
| 7552.0 | -43 |
| 7553.0 | -42 |
| 7554.0 | -43 |
| 7555.0 | -42 |
| 7556.0 | -43 |
| 7557.0 | -44 |
| 7558.0 | -45 |
| 7559.0 | -44 |
| 7560.0 | -45 |
| 7561.0 | -44 |
| 7562.0 | -43 |
| 7563.0 | -42 |
| 7564.0 | -43 |
| 7565.0 | -42 |
| 7566.0 | -41 |
| 7567.0 | -40 |
| 7568.0 | -41 |
| 7569.0 | -42 |
| 7570.0 | -43 |
| 7571.0 | -44 |
| 7572.0 | -45 |
| 7573.0 | -44 |
| 7574.0 | -43 |
| 7575.0 | -42 |
| 7576.0 | -41 |
| 7577.0 | -42 |
| 7578.0 | -43 |
| 7579.0 | -44 |
| 7580.0 | -45 |
| 7581.0 | -44 |
| 7582.0 | -45 |
| 7583.0 | -44 |
| 7584.0 | -43 |
| 7585.0 | -42 |
| 7586.0 | -41 |
| 7587.0 | -40 |
| 7588.0 | -39 |
| 7589.0 | -40 |
| 7590.0 | -41 |
| 7591.0 | -42 |
| 7592.0 | -43 |
| 7593.0 | -42 |
| 7594.0 | -43 |
| 7595.0 | -42 |
| 7596.0 | -41 |
| 7597.0 | -42 |
| 7598.0 | -41 |
| 7599.0 | -42 |
| 7600.0 | -43 |
| 7601.0 | -44 |
| 7602.0 | -43 |
| 7603.0 | -44 |
| 7604.0 | -43 |
| 7605.0 | -44 |
| 7606.0 | -45 |
| 7607.0 | -46 |
| 7608.0 | -45 |
| 7609.0 | -44 |
| 7610.0 | -43 |
| 7611.0 | -44 |
| 7612.0 | -43 |
| 7613.0 | -44 |
| 7614.0 | -45 |
| 7615.0 | -46 |
| 7616.0 | -47 |
| 7617.0 | -48 |
| 7618.0 | -47 |
| 7619.0 | -46 |
| 7620.0 | -47 |
| 7621.0 | -46 |
| 7622.0 | -45 |
| 7623.0 | -44 |
| 7624.0 | -45 |
| 7625.0 | -46 |
| 7626.0 | -47 |
| 7627.0 | -48 |
| 7628.0 | -47 |
| 7629.0 | -46 |
| 7630.0 | -47 |
| 7631.0 | -46 |
| 7632.0 | -45 |
| 7633.0 | -44 |
| 7634.0 | -43 |
| 7635.0 | -44 |
| 7636.0 | -43 |
| 7637.0 | -44 |
| 7638.0 | -45 |
| 7639.0 | -44 |
| 7640.0 | -43 |
| 7641.0 | -42 |
| 7642.0 | -41 |
| 7643.0 | -42 |
| 7644.0 | -43 |
| 7645.0 | -44 |
| 7646.0 | -43 |
| 7647.0 | -44 |
| 7648.0 | -45 |
| 7649.0 | -44 |
| 7650.0 | -43 |
| 7651.0 | -42 |
| 7652.0 | -43 |
| 7653.0 | -42 |
| 7654.0 | -41 |
| 7655.0 | -40 |
| 7656.0 | -39 |
| 7657.0 | -38 |
| 7658.0 | -37 |
| 7659.0 | -36 |
| 7660.0 | -37 |
| 7661.0 | -36 |
| 7662.0 | -35 |
| 7663.0 | -34 |
| 7664.0 | -33 |
| 7665.0 | -32 |
| 7666.0 | -33 |
| 7667.0 | -34 |
| 7668.0 | -33 |
| 7669.0 | -34 |
| 7670.0 | -35 |
| 7671.0 | -36 |
| 7672.0 | -35 |
| 7673.0 | -36 |
| 7674.0 | -37 |
| 7675.0 | -36 |
| 7676.0 | -37 |
| 7677.0 | -38 |
| 7678.0 | -39 |
| 7679.0 | -40 |
| 7680.0 | -39 |
| 7681.0 | -40 |
| 7682.0 | -41 |
| 7683.0 | -40 |
| 7684.0 | -39 |
| 7685.0 | -38 |
| 7686.0 | -39 |
| 7687.0 | -38 |
| 7688.0 | -39 |
| 7689.0 | -40 |
| 7690.0 | -41 |
| 7691.0 | -40 |
| 7692.0 | -41 |
| 7693.0 | -42 |
| 7694.0 | -41 |
| 7695.0 | -40 |
| 7696.0 | -39 |
| 7697.0 | -38 |
| 7698.0 | -39 |
| 7699.0 | -40 |
| 7700.0 | -41 |
| 7701.0 | -40 |
| 7702.0 | -41 |
| 7703.0 | -42 |
| 7704.0 | -43 |
| 7705.0 | -44 |
| 7706.0 | -45 |
| 7707.0 | -44 |
| 7708.0 | -45 |
| 7709.0 | -44 |
| 7710.0 | -43 |
| 7711.0 | -44 |
| 7712.0 | -45 |
| 7713.0 | -44 |
| 7714.0 | -45 |
| 7715.0 | -44 |
| 7716.0 | -45 |
| 7717.0 | -46 |
| 7718.0 | -47 |
| 7719.0 | -48 |
| 7720.0 | -49 |
| 7721.0 | -50 |
| 7722.0 | -51 |
| 7723.0 | -52 |
| 7724.0 | -53 |
| 7725.0 | -52 |
| 7726.0 | -51 |
| 7727.0 | -52 |
| 7728.0 | -53 |
| 7729.0 | -52 |
| 7730.0 | -51 |
| 7731.0 | -50 |
| 7732.0 | -51 |
| 7733.0 | -52 |
| 7734.0 | -51 |
| 7735.0 | -52 |
| 7736.0 | -53 |
| 7737.0 | -54 |
| 7738.0 | -55 |
| 7739.0 | -56 |
| 7740.0 | -57 |
| 7741.0 | -58 |
| 7742.0 | -59 |
| 7743.0 | -60 |
| 7744.0 | -61 |
| 7745.0 | -60 |
| 7746.0 | -61 |
| 7747.0 | -60 |
| 7748.0 | -59 |
| 7749.0 | -60 |
| 7750.0 | -61 |
| 7751.0 | -62 |
| 7752.0 | -63 |
| 7753.0 | -62 |
| 7754.0 | -61 |
| 7755.0 | -62 |
| 7756.0 | -63 |
| 7757.0 | -62 |
| 7758.0 | -61 |
| 7759.0 | -60 |
| 7760.0 | -59 |
| 7761.0 | -60 |
| 7762.0 | -61 |
| 7763.0 | -60 |
| 7764.0 | -59 |
| 7765.0 | -58 |
| 7766.0 | -57 |
| 7767.0 | -58 |
| 7768.0 | -57 |
| 7769.0 | -56 |
| 7770.0 | -57 |
| 7771.0 | -58 |
| 7772.0 | -59 |
| 7773.0 | -58 |
| 7774.0 | -57 |
| 7775.0 | -58 |
| 7776.0 | -57 |
| 7777.0 | -58 |
| 7778.0 | -59 |
| 7779.0 | -60 |
| 7780.0 | -61 |
| 7781.0 | -60 |
| 7782.0 | -61 |
| 7783.0 | -60 |
| 7784.0 | -59 |
| 7785.0 | -58 |
| 7786.0 | -57 |
| 7787.0 | -58 |
| 7788.0 | -57 |
| 7789.0 | -58 |
| 7790.0 | -57 |
| 7791.0 | -56 |
| 7792.0 | -55 |
| 7793.0 | -56 |
| 7794.0 | -55 |
| 7795.0 | -56 |
| 7796.0 | -55 |
| 7797.0 | -54 |
| 7798.0 | -55 |
| 7799.0 | -56 |
| 7800.0 | -57 |
| 7801.0 | -58 |
| 7802.0 | -57 |
| 7803.0 | -56 |
| 7804.0 | -55 |
| 7805.0 | -54 |
| 7806.0 | -53 |
| 7807.0 | -52 |
| 7808.0 | -53 |
| 7809.0 | -54 |
| 7810.0 | -55 |
| 7811.0 | -54 |
| 7812.0 | -53 |
| 7813.0 | -54 |
| 7814.0 | -55 |
| 7815.0 | -54 |
| 7816.0 | -55 |
| 7817.0 | -56 |
| 7818.0 | -55 |
| 7819.0 | -54 |
| 7820.0 | -55 |
| 7821.0 | -54 |
| 7822.0 | -55 |
| 7823.0 | -54 |
| 7824.0 | -53 |
| 7825.0 | -52 |
| 7826.0 | -53 |
| 7827.0 | -52 |
| 7828.0 | -53 |
| 7829.0 | -52 |
| 7830.0 | -53 |
| 7831.0 | -54 |
| 7832.0 | -55 |
| 7833.0 | -56 |
| 7834.0 | -55 |
| 7835.0 | -54 |
| 7836.0 | -55 |
| 7837.0 | -56 |
| 7838.0 | -55 |
| 7839.0 | -54 |
| 7840.0 | -55 |
| 7841.0 | -56 |
| 7842.0 | -57 |
| 7843.0 | -58 |
| 7844.0 | -57 |
| 7845.0 | -56 |
| 7846.0 | -57 |
| 7847.0 | -56 |
| 7848.0 | -57 |
| 7849.0 | -58 |
| 7850.0 | -59 |
| 7851.0 | -60 |
| 7852.0 | -59 |
| 7853.0 | -58 |
| 7854.0 | -57 |
| 7855.0 | -58 |
| 7856.0 | -57 |
| 7857.0 | -56 |
| 7858.0 | -55 |
| 7859.0 | -54 |
| 7860.0 | -55 |
| 7861.0 | -56 |
| 7862.0 | -55 |
| 7863.0 | -54 |
| 7864.0 | -53 |
| 7865.0 | -54 |
| 7866.0 | -55 |
| 7867.0 | -54 |
| 7868.0 | -53 |
| 7869.0 | -54 |
| 7870.0 | -55 |
| 7871.0 | -56 |
| 7872.0 | -55 |
| 7873.0 | -56 |
| 7874.0 | -55 |
| 7875.0 | -54 |
| 7876.0 | -53 |
| 7877.0 | -54 |
| 7878.0 | -53 |
| 7879.0 | -54 |
| 7880.0 | -55 |
| 7881.0 | -56 |
| 7882.0 | -57 |
| 7883.0 | -58 |
| 7884.0 | -57 |
| 7885.0 | -58 |
| 7886.0 | -57 |
| 7887.0 | -56 |
| 7888.0 | -55 |
| 7889.0 | -54 |
| 7890.0 | -55 |
| 7891.0 | -56 |
| 7892.0 | -57 |
| 7893.0 | -58 |
| 7894.0 | -59 |
| 7895.0 | -60 |
| 7896.0 | -61 |
| 7897.0 | -62 |
| 7898.0 | -61 |
| 7899.0 | -62 |
| 7900.0 | -63 |
| 7901.0 | -62 |
| 7902.0 | -61 |
| 7903.0 | -60 |
| 7904.0 | -59 |
| 7905.0 | -60 |
| 7906.0 | -61 |
| 7907.0 | -62 |
| 7908.0 | -61 |
| 7909.0 | -60 |
| 7910.0 | -59 |
| 7911.0 | -60 |
| 7912.0 | -61 |
| 7913.0 | -60 |
| 7914.0 | -61 |
| 7915.0 | -62 |
| 7916.0 | -63 |
| 7917.0 | -64 |
| 7918.0 | -63 |
| 7919.0 | -62 |
| 7920.0 | -63 |
| 7921.0 | -64 |
| 7922.0 | -63 |
| 7923.0 | -64 |
| 7924.0 | -63 |
| 7925.0 | -62 |
| 7926.0 | -61 |
| 7927.0 | -60 |
| 7928.0 | -59 |
| 7929.0 | -58 |
| 7930.0 | -59 |
| 7931.0 | -58 |
| 7932.0 | -59 |
| 7933.0 | -58 |
| 7934.0 | -59 |
| 7935.0 | -58 |
| 7936.0 | -57 |
| 7937.0 | -56 |
| 7938.0 | -55 |
| 7939.0 | -56 |
| 7940.0 | -57 |
| 7941.0 | -56 |
| 7942.0 | -55 |
| 7943.0 | -54 |
| 7944.0 | -53 |
| 7945.0 | -52 |
| 7946.0 | -53 |
| 7947.0 | -52 |
| 7948.0 | -53 |
| 7949.0 | -52 |
| 7950.0 | -51 |
| 7951.0 | -50 |
| 7952.0 | -49 |
| 7953.0 | -50 |
| 7954.0 | -49 |
| 7955.0 | -48 |
| 7956.0 | -47 |
| 7957.0 | -46 |
| 7958.0 | -45 |
| 7959.0 | -44 |
| 7960.0 | -43 |
| 7961.0 | -42 |
| 7962.0 | -41 |
| 7963.0 | -42 |
| 7964.0 | -43 |
| 7965.0 | -42 |
| 7966.0 | -41 |
| 7967.0 | -40 |
| 7968.0 | -39 |
| 7969.0 | -38 |
| 7970.0 | -37 |
| 7971.0 | -38 |
| 7972.0 | -39 |
| 7973.0 | -40 |
| 7974.0 | -41 |
| 7975.0 | -40 |
| 7976.0 | -41 |
| 7977.0 | -42 |
| 7978.0 | -43 |
| 7979.0 | -44 |
| 7980.0 | -43 |
| 7981.0 | -42 |
| 7982.0 | -43 |
| 7983.0 | -44 |
| 7984.0 | -43 |
| 7985.0 | -44 |
| 7986.0 | -43 |
| 7987.0 | -42 |
| 7988.0 | -41 |
| 7989.0 | -40 |
| 7990.0 | -41 |
| 7991.0 | -40 |
| 7992.0 | -41 |
| 7993.0 | -42 |
| 7994.0 | -41 |
| 7995.0 | -42 |
| 7996.0 | -43 |
| 7997.0 | -44 |
| 7998.0 | -45 |
| 7999.0 | -44 |
| 8000.0 | -45 |
| 8001.0 | -46 |
| 8002.0 | -47 |
| 8003.0 | -46 |
| 8004.0 | -45 |
| 8005.0 | -44 |
| 8006.0 | -45 |
| 8007.0 | -44 |
| 8008.0 | -45 |
| 8009.0 | -46 |
| 8010.0 | -45 |
| 8011.0 | -44 |
| 8012.0 | -45 |
| 8013.0 | -44 |
| 8014.0 | -45 |
| 8015.0 | -46 |
| 8016.0 | -47 |
| 8017.0 | -48 |
| 8018.0 | -49 |
| 8019.0 | -50 |
| 8020.0 | -49 |
| 8021.0 | -50 |
| 8022.0 | -51 |
| 8023.0 | -52 |
| 8024.0 | -53 |
| 8025.0 | -54 |
| 8026.0 | -53 |
| 8027.0 | -54 |
| 8028.0 | -53 |
| 8029.0 | -52 |
| 8030.0 | -53 |
| 8031.0 | -52 |
| 8032.0 | -53 |
| 8033.0 | -54 |
| 8034.0 | -55 |
| 8035.0 | -56 |
| 8036.0 | -55 |
| 8037.0 | -54 |
| 8038.0 | -55 |
| 8039.0 | -54 |
| 8040.0 | -53 |
| 8041.0 | -54 |
| 8042.0 | -55 |
| 8043.0 | -54 |
| 8044.0 | -53 |
| 8045.0 | -54 |
| 8046.0 | -53 |
| 8047.0 | -54 |
| 8048.0 | -55 |
| 8049.0 | -54 |
| 8050.0 | -55 |
| 8051.0 | -54 |
| 8052.0 | -55 |
| 8053.0 | -56 |
| 8054.0 | -57 |
| 8055.0 | -58 |
| 8056.0 | -57 |
| 8057.0 | -58 |
| 8058.0 | -57 |
| 8059.0 | -56 |
| 8060.0 | -55 |
| 8061.0 | -56 |
| 8062.0 | -57 |
| 8063.0 | -56 |
| 8064.0 | -55 |
| 8065.0 | -54 |
| 8066.0 | -55 |
| 8067.0 | -56 |
| 8068.0 | -55 |
| 8069.0 | -54 |
| 8070.0 | -53 |
| 8071.0 | -52 |
| 8072.0 | -51 |
| 8073.0 | -50 |
| 8074.0 | -49 |
| 8075.0 | -48 |
| 8076.0 | -47 |
| 8077.0 | -46 |
| 8078.0 | -47 |
| 8079.0 | -46 |
| 8080.0 | -47 |
| 8081.0 | -48 |
| 8082.0 | -49 |
| 8083.0 | -48 |
| 8084.0 | -49 |
| 8085.0 | -50 |
| 8086.0 | -51 |
| 8087.0 | -50 |
| 8088.0 | -51 |
| 8089.0 | -50 |
| 8090.0 | -51 |
| 8091.0 | -50 |
| 8092.0 | -51 |
| 8093.0 | -50 |
| 8094.0 | -51 |
| 8095.0 | -50 |
| 8096.0 | -49 |
| 8097.0 | -50 |
| 8098.0 | -51 |
| 8099.0 | -50 |
| 8100.0 | -49 |
| 8101.0 | -48 |
| 8102.0 | -49 |
| 8103.0 | -48 |
| 8104.0 | -49 |
| 8105.0 | -50 |
| 8106.0 | -49 |
| 8107.0 | -50 |
| 8108.0 | -49 |
| 8109.0 | -48 |
| 8110.0 | -49 |
| 8111.0 | -48 |
| 8112.0 | -47 |
| 8113.0 | -48 |
| 8114.0 | -47 |
| 8115.0 | -46 |
| 8116.0 | -47 |
| 8117.0 | -48 |
| 8118.0 | -49 |
| 8119.0 | -48 |
| 8120.0 | -49 |
| 8121.0 | -48 |
| 8122.0 | -47 |
| 8123.0 | -48 |
| 8124.0 | -49 |
| 8125.0 | -48 |
| 8126.0 | -49 |
| 8127.0 | -48 |
| 8128.0 | -47 |
| 8129.0 | -46 |
| 8130.0 | -45 |
| 8131.0 | -46 |
| 8132.0 | -47 |
| 8133.0 | -48 |
| 8134.0 | -49 |
| 8135.0 | -50 |
| 8136.0 | -51 |
| 8137.0 | -52 |
| 8138.0 | -51 |
| 8139.0 | -52 |
| 8140.0 | -53 |
| 8141.0 | -52 |
| 8142.0 | -53 |
| 8143.0 | -54 |
| 8144.0 | -53 |
| 8145.0 | -52 |
| 8146.0 | -53 |
| 8147.0 | -52 |
| 8148.0 | -51 |
| 8149.0 | -52 |
| 8150.0 | -51 |
| 8151.0 | -52 |
| 8152.0 | -53 |
| 8153.0 | -54 |
| 8154.0 | -55 |
| 8155.0 | -54 |
| 8156.0 | -55 |
| 8157.0 | -54 |
| 8158.0 | -55 |
| 8159.0 | -56 |
| 8160.0 | -55 |
| 8161.0 | -54 |
| 8162.0 | -53 |
| 8163.0 | -52 |
| 8164.0 | -51 |
| 8165.0 | -50 |
| 8166.0 | -51 |
| 8167.0 | -52 |
| 8168.0 | -53 |
| 8169.0 | -52 |
| 8170.0 | -51 |
| 8171.0 | -50 |
| 8172.0 | -51 |
| 8173.0 | -50 |
| 8174.0 | -51 |
| 8175.0 | -52 |
| 8176.0 | -51 |
| 8177.0 | -52 |
| 8178.0 | -53 |
| 8179.0 | -54 |
| 8180.0 | -55 |
| 8181.0 | -54 |
| 8182.0 | -55 |
| 8183.0 | -56 |
| 8184.0 | -55 |
| 8185.0 | -54 |
| 8186.0 | -55 |
| 8187.0 | -54 |
| 8188.0 | -53 |
| 8189.0 | -52 |
| 8190.0 | -51 |
| 8191.0 | -52 |
| 8192.0 | -53 |
| 8193.0 | -54 |
| 8194.0 | -53 |
| 8195.0 | -52 |
| 8196.0 | -51 |
| 8197.0 | -52 |
| 8198.0 | -53 |
| 8199.0 | -52 |
| 8200.0 | -51 |
| 8201.0 | -50 |
| 8202.0 | -51 |
| 8203.0 | -52 |
| 8204.0 | -53 |
| 8205.0 | -54 |
| 8206.0 | -55 |
| 8207.0 | -56 |
| 8208.0 | -57 |
| 8209.0 | -56 |
| 8210.0 | -57 |
| 8211.0 | -58 |
| 8212.0 | -59 |
| 8213.0 | -60 |
| 8214.0 | -59 |
| 8215.0 | -58 |
| 8216.0 | -57 |
| 8217.0 | -56 |
| 8218.0 | -55 |
| 8219.0 | -56 |
| 8220.0 | -55 |
| 8221.0 | -56 |
| 8222.0 | -55 |
| 8223.0 | -56 |
| 8224.0 | -57 |
| 8225.0 | -58 |
| 8226.0 | -57 |
| 8227.0 | -56 |
| 8228.0 | -57 |
| 8229.0 | -56 |
| 8230.0 | -55 |
| 8231.0 | -54 |
| 8232.0 | -55 |
| 8233.0 | -56 |
| 8234.0 | -57 |
| 8235.0 | -58 |
| 8236.0 | -59 |
| 8237.0 | -58 |
| 8238.0 | -59 |
| 8239.0 | -58 |
| 8240.0 | -59 |
| 8241.0 | -58 |
| 8242.0 | -59 |
| 8243.0 | -60 |
| 8244.0 | -61 |
| 8245.0 | -60 |
| 8246.0 | -61 |
| 8247.0 | -62 |
| 8248.0 | -63 |
| 8249.0 | -64 |
| 8250.0 | -65 |
| 8251.0 | -66 |
| 8252.0 | -65 |
| 8253.0 | -66 |
| 8254.0 | -67 |
| 8255.0 | -66 |
| 8256.0 | -67 |
| 8257.0 | -66 |
| 8258.0 | -67 |
| 8259.0 | -66 |
| 8260.0 | -65 |
| 8261.0 | -66 |
| 8262.0 | -65 |
| 8263.0 | -64 |
| 8264.0 | -63 |
| 8265.0 | -62 |
| 8266.0 | -61 |
| 8267.0 | -62 |
| 8268.0 | -61 |
| 8269.0 | -60 |
| 8270.0 | -61 |
| 8271.0 | -60 |
| 8272.0 | -59 |
| 8273.0 | -58 |
| 8274.0 | -57 |
| 8275.0 | -58 |
| 8276.0 | -59 |
| 8277.0 | -60 |
| 8278.0 | -59 |
| 8279.0 | -60 |
| 8280.0 | -61 |
| 8281.0 | -62 |
| 8282.0 | -61 |
| 8283.0 | -60 |
| 8284.0 | -61 |
| 8285.0 | -62 |
| 8286.0 | -61 |
| 8287.0 | -62 |
| 8288.0 | -63 |
| 8289.0 | -62 |
| 8290.0 | -63 |
| 8291.0 | -62 |
| 8292.0 | -63 |
| 8293.0 | -64 |
| 8294.0 | -65 |
| 8295.0 | -66 |
| 8296.0 | -67 |
| 8297.0 | -68 |
| 8298.0 | -67 |
| 8299.0 | -68 |
| 8300.0 | -69 |
| 8301.0 | -68 |
| 8302.0 | -67 |
| 8303.0 | -66 |
| 8304.0 | -67 |
| 8305.0 | -66 |
| 8306.0 | -67 |
| 8307.0 | -66 |
| 8308.0 | -65 |
| 8309.0 | -66 |
| 8310.0 | -67 |
| 8311.0 | -66 |
| 8312.0 | -67 |
| 8313.0 | -66 |
| 8314.0 | -67 |
| 8315.0 | -66 |
| 8316.0 | -67 |
| 8317.0 | -66 |
| 8318.0 | -67 |
| 8319.0 | -66 |
| 8320.0 | -67 |
| 8321.0 | -68 |
| 8322.0 | -67 |
| 8323.0 | -68 |
| 8324.0 | -69 |
| 8325.0 | -70 |
| 8326.0 | -71 |
| 8327.0 | -72 |
| 8328.0 | -71 |
| 8329.0 | -72 |
| 8330.0 | -71 |
| 8331.0 | -72 |
| 8332.0 | -71 |
| 8333.0 | -72 |
| 8334.0 | -73 |
| 8335.0 | -74 |
| 8336.0 | -75 |
| 8337.0 | -76 |
| 8338.0 | -77 |
| 8339.0 | -78 |
| 8340.0 | -79 |
| 8341.0 | -78 |
| 8342.0 | -77 |
| 8343.0 | -76 |
| 8344.0 | -75 |
| 8345.0 | -76 |
| 8346.0 | -75 |
| 8347.0 | -74 |
| 8348.0 | -73 |
| 8349.0 | -74 |
| 8350.0 | -75 |
| 8351.0 | -76 |
| 8352.0 | -77 |
| 8353.0 | -78 |
| 8354.0 | -77 |
| 8355.0 | -76 |
| 8356.0 | -75 |
| 8357.0 | -76 |
| 8358.0 | -75 |
| 8359.0 | -76 |
| 8360.0 | -77 |
| 8361.0 | -78 |
| 8362.0 | -79 |
| 8363.0 | -80 |
| 8364.0 | -81 |
| 8365.0 | -80 |
| 8366.0 | -79 |
| 8367.0 | -78 |
| 8368.0 | -77 |
| 8369.0 | -76 |
| 8370.0 | -75 |
| 8371.0 | -76 |
| 8372.0 | -77 |
| 8373.0 | -76 |
| 8374.0 | -77 |
| 8375.0 | -76 |
| 8376.0 | -75 |
| 8377.0 | -76 |
| 8378.0 | -75 |
| 8379.0 | -76 |
| 8380.0 | -77 |
| 8381.0 | -78 |
| 8382.0 | -77 |
| 8383.0 | -78 |
| 8384.0 | -77 |
| 8385.0 | -76 |
| 8386.0 | -75 |
| 8387.0 | -74 |
| 8388.0 | -75 |
| 8389.0 | -76 |
| 8390.0 | -75 |
| 8391.0 | -76 |
| 8392.0 | -75 |
| 8393.0 | -76 |
| 8394.0 | -75 |
| 8395.0 | -76 |
| 8396.0 | -77 |
| 8397.0 | -76 |
| 8398.0 | -75 |
| 8399.0 | -76 |
| 8400.0 | -77 |
| 8401.0 | -76 |
| 8402.0 | -75 |
| 8403.0 | -76 |
| 8404.0 | -75 |
| 8405.0 | -74 |
| 8406.0 | -75 |
| 8407.0 | -76 |
| 8408.0 | -75 |
| 8409.0 | -76 |
| 8410.0 | -75 |
| 8411.0 | -74 |
| 8412.0 | -73 |
| 8413.0 | -72 |
| 8414.0 | -73 |
| 8415.0 | -74 |
| 8416.0 | -75 |
| 8417.0 | -74 |
| 8418.0 | -73 |
| 8419.0 | -72 |
| 8420.0 | -71 |
| 8421.0 | -70 |
| 8422.0 | -69 |
| 8423.0 | -70 |
| 8424.0 | -71 |
| 8425.0 | -70 |
| 8426.0 | -71 |
| 8427.0 | -70 |
| 8428.0 | -71 |
| 8429.0 | -72 |
| 8430.0 | -73 |
| 8431.0 | -72 |
| 8432.0 | -71 |
| 8433.0 | -70 |
| 8434.0 | -69 |
| 8435.0 | -68 |
| 8436.0 | -67 |
| 8437.0 | -68 |
| 8438.0 | -67 |
| 8439.0 | -66 |
| 8440.0 | -65 |
| 8441.0 | -66 |
| 8442.0 | -65 |
| 8443.0 | -66 |
| 8444.0 | -67 |
| 8445.0 | -68 |
| 8446.0 | -67 |
| 8447.0 | -66 |
| 8448.0 | -67 |
| 8449.0 | -66 |
| 8450.0 | -65 |
| 8451.0 | -66 |
| 8452.0 | -65 |
| 8453.0 | -66 |
| 8454.0 | -65 |
| 8455.0 | -66 |
| 8456.0 | -67 |
| 8457.0 | -68 |
| 8458.0 | -69 |
| 8459.0 | -70 |
| 8460.0 | -71 |
| 8461.0 | -70 |
| 8462.0 | -71 |
| 8463.0 | -72 |
| 8464.0 | -73 |
| 8465.0 | -74 |
| 8466.0 | -73 |
| 8467.0 | -74 |
| 8468.0 | -73 |
| 8469.0 | -72 |
| 8470.0 | -71 |
| 8471.0 | -70 |
| 8472.0 | -69 |
| 8473.0 | -68 |
| 8474.0 | -67 |
| 8475.0 | -68 |
| 8476.0 | -69 |
| 8477.0 | -70 |
| 8478.0 | -69 |
| 8479.0 | -70 |
| 8480.0 | -71 |
| 8481.0 | -72 |
| 8482.0 | -73 |
| 8483.0 | -72 |
| 8484.0 | -73 |
| 8485.0 | -72 |
| 8486.0 | -73 |
| 8487.0 | -72 |
| 8488.0 | -71 |
| 8489.0 | -70 |
| 8490.0 | -71 |
| 8491.0 | -72 |
| 8492.0 | -71 |
| 8493.0 | -72 |
| 8494.0 | -71 |
| 8495.0 | -70 |
| 8496.0 | -69 |
| 8497.0 | -70 |
| 8498.0 | -71 |
| 8499.0 | -72 |
| 8500.0 | -73 |
| 8501.0 | -72 |
| 8502.0 | -73 |
| 8503.0 | -74 |
| 8504.0 | -75 |
| 8505.0 | -74 |
| 8506.0 | -75 |
| 8507.0 | -76 |
| 8508.0 | -77 |
| 8509.0 | -76 |
| 8510.0 | -77 |
| 8511.0 | -76 |
| 8512.0 | -77 |
| 8513.0 | -76 |
| 8514.0 | -75 |
| 8515.0 | -74 |
| 8516.0 | -75 |
| 8517.0 | -76 |
| 8518.0 | -75 |
| 8519.0 | -74 |
| 8520.0 | -73 |
| 8521.0 | -72 |
| 8522.0 | -71 |
| 8523.0 | -70 |
| 8524.0 | -71 |
| 8525.0 | -70 |
| 8526.0 | -69 |
| 8527.0 | -70 |
| 8528.0 | -71 |
| 8529.0 | -72 |
| 8530.0 | -71 |
| 8531.0 | -70 |
| 8532.0 | -69 |
| 8533.0 | -70 |
| 8534.0 | -69 |
| 8535.0 | -70 |
| 8536.0 | -69 |
| 8537.0 | -68 |
| 8538.0 | -69 |
| 8539.0 | -68 |
| 8540.0 | -69 |
| 8541.0 | -70 |
| 8542.0 | -69 |
| 8543.0 | -68 |
| 8544.0 | -69 |
| 8545.0 | -70 |
| 8546.0 | -71 |
| 8547.0 | -70 |
| 8548.0 | -69 |
| 8549.0 | -68 |
| 8550.0 | -67 |
| 8551.0 | -66 |
| 8552.0 | -67 |
| 8553.0 | -68 |
| 8554.0 | -67 |
| 8555.0 | -66 |
| 8556.0 | -65 |
| 8557.0 | -64 |
| 8558.0 | -63 |
| 8559.0 | -62 |
| 8560.0 | -63 |
| 8561.0 | -64 |
| 8562.0 | -63 |
| 8563.0 | -64 |
| 8564.0 | -63 |
| 8565.0 | -62 |
| 8566.0 | -61 |
| 8567.0 | -60 |
| 8568.0 | -61 |
| 8569.0 | -62 |
| 8570.0 | -63 |
| 8571.0 | -64 |
| 8572.0 | -65 |
| 8573.0 | -66 |
| 8574.0 | -67 |
| 8575.0 | -66 |
| 8576.0 | -67 |
| 8577.0 | -68 |
| 8578.0 | -67 |
| 8579.0 | -68 |
| 8580.0 | -67 |
| 8581.0 | -66 |
| 8582.0 | -65 |
| 8583.0 | -66 |
| 8584.0 | -65 |
| 8585.0 | -66 |
| 8586.0 | -67 |
| 8587.0 | -68 |
| 8588.0 | -67 |
| 8589.0 | -68 |
| 8590.0 | -67 |
| 8591.0 | -66 |
| 8592.0 | -67 |
| 8593.0 | -66 |
| 8594.0 | -65 |
| 8595.0 | -64 |
| 8596.0 | -65 |
| 8597.0 | -64 |
| 8598.0 | -63 |
| 8599.0 | -64 |
| 8600.0 | -63 |
| 8601.0 | -62 |
| 8602.0 | -63 |
| 8603.0 | -64 |
| 8604.0 | -65 |
| 8605.0 | -66 |
| 8606.0 | -65 |
| 8607.0 | -64 |
| 8608.0 | -65 |
| 8609.0 | -64 |
| 8610.0 | -63 |
| 8611.0 | -62 |
| 8612.0 | -63 |
| 8613.0 | -62 |
| 8614.0 | -63 |
| 8615.0 | -62 |
| 8616.0 | -63 |
| 8617.0 | -64 |
| 8618.0 | -63 |
| 8619.0 | -62 |
| 8620.0 | -63 |
| 8621.0 | -64 |
| 8622.0 | -63 |
| 8623.0 | -64 |
| 8624.0 | -63 |
| 8625.0 | -62 |
| 8626.0 | -61 |
| 8627.0 | -60 |
| 8628.0 | -61 |
| 8629.0 | -62 |
| 8630.0 | -61 |
| 8631.0 | -60 |
| 8632.0 | -59 |
| 8633.0 | -58 |
| 8634.0 | -57 |
| 8635.0 | -58 |
| 8636.0 | -59 |
| 8637.0 | -60 |
| 8638.0 | -59 |
| 8639.0 | -60 |
| 8640.0 | -61 |
| 8641.0 | -62 |
| 8642.0 | -61 |
| 8643.0 | -62 |
| 8644.0 | -63 |
| 8645.0 | -62 |
| 8646.0 | -63 |
| 8647.0 | -62 |
| 8648.0 | -63 |
| 8649.0 | -62 |
| 8650.0 | -63 |
| 8651.0 | -62 |
| 8652.0 | -63 |
| 8653.0 | -62 |
| 8654.0 | -61 |
| 8655.0 | -60 |
| 8656.0 | -61 |
| 8657.0 | -62 |
| 8658.0 | -63 |
| 8659.0 | -64 |
| 8660.0 | -65 |
| 8661.0 | -66 |
| 8662.0 | -67 |
| 8663.0 | -66 |
| 8664.0 | -65 |
| 8665.0 | -66 |
| 8666.0 | -65 |
| 8667.0 | -64 |
| 8668.0 | -65 |
| 8669.0 | -66 |
| 8670.0 | -67 |
| 8671.0 | -68 |
| 8672.0 | -69 |
| 8673.0 | -68 |
| 8674.0 | -67 |
| 8675.0 | -66 |
| 8676.0 | -67 |
| 8677.0 | -66 |
| 8678.0 | -65 |
| 8679.0 | -64 |
| 8680.0 | -63 |
| 8681.0 | -62 |
| 8682.0 | -61 |
| 8683.0 | -62 |
| 8684.0 | -61 |
| 8685.0 | -60 |
| 8686.0 | -61 |
| 8687.0 | -60 |
| 8688.0 | -61 |
| 8689.0 | -60 |
| 8690.0 | -59 |
| 8691.0 | -58 |
| 8692.0 | -57 |
| 8693.0 | -56 |
| 8694.0 | -57 |
| 8695.0 | -56 |
| 8696.0 | -55 |
| 8697.0 | -56 |
| 8698.0 | -57 |
| 8699.0 | -58 |
| 8700.0 | -57 |
| 8701.0 | -58 |
| 8702.0 | -59 |
| 8703.0 | -58 |
| 8704.0 | -59 |
| 8705.0 | -58 |
| 8706.0 | -59 |
| 8707.0 | -58 |
| 8708.0 | -59 |
| 8709.0 | -58 |
| 8710.0 | -59 |
| 8711.0 | -60 |
| 8712.0 | -59 |
| 8713.0 | -60 |
| 8714.0 | -61 |
| 8715.0 | -60 |
| 8716.0 | -61 |
| 8717.0 | -62 |
| 8718.0 | -63 |
| 8719.0 | -62 |
| 8720.0 | -63 |
| 8721.0 | -64 |
| 8722.0 | -63 |
| 8723.0 | -64 |
| 8724.0 | -65 |
| 8725.0 | -64 |
| 8726.0 | -65 |
| 8727.0 | -64 |
| 8728.0 | -65 |
| 8729.0 | -66 |
| 8730.0 | -65 |
| 8731.0 | -64 |
| 8732.0 | -65 |
| 8733.0 | -66 |
| 8734.0 | -65 |
| 8735.0 | -66 |
| 8736.0 | -65 |
| 8737.0 | -66 |
| 8738.0 | -65 |
| 8739.0 | -66 |
| 8740.0 | -65 |
| 8741.0 | -64 |
| 8742.0 | -65 |
| 8743.0 | -66 |
| 8744.0 | -65 |
| 8745.0 | -64 |
| 8746.0 | -63 |
| 8747.0 | -62 |
| 8748.0 | -61 |
| 8749.0 | -62 |
| 8750.0 | -61 |
| 8751.0 | -60 |
| 8752.0 | -61 |
| 8753.0 | -62 |
| 8754.0 | -61 |
| 8755.0 | -60 |
| 8756.0 | -61 |
| 8757.0 | -62 |
| 8758.0 | -63 |
| 8759.0 | -62 |
| 8760.0 | -63 |
| 8761.0 | -64 |
| 8762.0 | -65 |
| 8763.0 | -66 |
| 8764.0 | -65 |
| 8765.0 | -64 |
| 8766.0 | -65 |
| 8767.0 | -64 |
| 8768.0 | -63 |
| 8769.0 | -62 |
| 8770.0 | -63 |
| 8771.0 | -64 |
| 8772.0 | -65 |
| 8773.0 | -64 |
| 8774.0 | -65 |
| 8775.0 | -66 |
| 8776.0 | -65 |
| 8777.0 | -66 |
| 8778.0 | -65 |
| 8779.0 | -64 |
| 8780.0 | -65 |
| 8781.0 | -66 |
| 8782.0 | -65 |
| 8783.0 | -66 |
| 8784.0 | -65 |
| 8785.0 | -66 |
| 8786.0 | -65 |
| 8787.0 | -64 |
| 8788.0 | -65 |
| 8789.0 | -66 |
| 8790.0 | -67 |
| 8791.0 | -68 |
| 8792.0 | -69 |
| 8793.0 | -68 |
| 8794.0 | -69 |
| 8795.0 | -68 |
| 8796.0 | -69 |
| 8797.0 | -68 |
| 8798.0 | -67 |
| 8799.0 | -66 |
| 8800.0 | -65 |
| 8801.0 | -66 |
| 8802.0 | -65 |
| 8803.0 | -66 |
| 8804.0 | -65 |
| 8805.0 | -64 |
| 8806.0 | -63 |
| 8807.0 | -62 |
| 8808.0 | -61 |
| 8809.0 | -62 |
| 8810.0 | -61 |
| 8811.0 | -60 |
| 8812.0 | -59 |
| 8813.0 | -58 |
| 8814.0 | -57 |
| 8815.0 | -56 |
| 8816.0 | -57 |
| 8817.0 | -56 |
| 8818.0 | -55 |
| 8819.0 | -56 |
| 8820.0 | -55 |
| 8821.0 | -54 |
| 8822.0 | -53 |
| 8823.0 | -52 |
| 8824.0 | -53 |
| 8825.0 | -52 |
| 8826.0 | -53 |
| 8827.0 | -54 |
| 8828.0 | -55 |
| 8829.0 | -56 |
| 8830.0 | -57 |
| 8831.0 | -58 |
| 8832.0 | -57 |
| 8833.0 | -56 |
| 8834.0 | -57 |
| 8835.0 | -56 |
| 8836.0 | -57 |
| 8837.0 | -56 |
| 8838.0 | -55 |
| 8839.0 | -56 |
| 8840.0 | -57 |
| 8841.0 | -56 |
| 8842.0 | -57 |
| 8843.0 | -56 |
| 8844.0 | -57 |
| 8845.0 | -58 |
| 8846.0 | -59 |
| 8847.0 | -60 |
| 8848.0 | -59 |
| 8849.0 | -58 |
| 8850.0 | -59 |
| 8851.0 | -60 |
| 8852.0 | -59 |
| 8853.0 | -58 |
| 8854.0 | -59 |
| 8855.0 | -58 |
| 8856.0 | -59 |
| 8857.0 | -58 |
| 8858.0 | -57 |
| 8859.0 | -58 |
| 8860.0 | -57 |
| 8861.0 | -56 |
| 8862.0 | -55 |
| 8863.0 | -56 |
| 8864.0 | -57 |
| 8865.0 | -56 |
| 8866.0 | -55 |
| 8867.0 | -56 |
| 8868.0 | -55 |
| 8869.0 | -56 |
| 8870.0 | -55 |
| 8871.0 | -54 |
| 8872.0 | -55 |
| 8873.0 | -54 |
| 8874.0 | -55 |
| 8875.0 | -56 |
| 8876.0 | -55 |
| 8877.0 | -54 |
| 8878.0 | -53 |
| 8879.0 | -54 |
| 8880.0 | -55 |
| 8881.0 | -56 |
| 8882.0 | -57 |
| 8883.0 | -58 |
| 8884.0 | -57 |
| 8885.0 | -58 |
| 8886.0 | -57 |
| 8887.0 | -56 |
| 8888.0 | -57 |
| 8889.0 | -58 |
| 8890.0 | -57 |
| 8891.0 | -58 |
| 8892.0 | -59 |
| 8893.0 | -58 |
| 8894.0 | -57 |
| 8895.0 | -56 |
| 8896.0 | -57 |
| 8897.0 | -56 |
| 8898.0 | -57 |
| 8899.0 | -56 |
| 8900.0 | -57 |
| 8901.0 | -58 |
| 8902.0 | -57 |
| 8903.0 | -58 |
| 8904.0 | -57 |
| 8905.0 | -56 |
| 8906.0 | -55 |
| 8907.0 | -54 |
| 8908.0 | -53 |
| 8909.0 | -54 |
| 8910.0 | -53 |
| 8911.0 | -52 |
| 8912.0 | -53 |
| 8913.0 | -54 |
| 8914.0 | -53 |
| 8915.0 | -54 |
| 8916.0 | -55 |
| 8917.0 | -54 |
| 8918.0 | -55 |
| 8919.0 | -54 |
| 8920.0 | -55 |
| 8921.0 | -54 |
| 8922.0 | -53 |
| 8923.0 | -52 |
| 8924.0 | -53 |
| 8925.0 | -52 |
| 8926.0 | -51 |
| 8927.0 | -50 |
| 8928.0 | -51 |
| 8929.0 | -52 |
| 8930.0 | -51 |
| 8931.0 | -52 |
| 8932.0 | -51 |
| 8933.0 | -52 |
| 8934.0 | -53 |
| 8935.0 | -54 |
| 8936.0 | -55 |
| 8937.0 | -56 |
| 8938.0 | -55 |
| 8939.0 | -54 |
| 8940.0 | -55 |
| 8941.0 | -54 |
| 8942.0 | -53 |
| 8943.0 | -52 |
| 8944.0 | -51 |
| 8945.0 | -50 |
| 8946.0 | -51 |
| 8947.0 | -50 |
| 8948.0 | -49 |
| 8949.0 | -48 |
| 8950.0 | -47 |
| 8951.0 | -48 |
| 8952.0 | -47 |
| 8953.0 | -48 |
| 8954.0 | -47 |
| 8955.0 | -48 |
| 8956.0 | -47 |
| 8957.0 | -46 |
| 8958.0 | -45 |
| 8959.0 | -46 |
| 8960.0 | -47 |
| 8961.0 | -48 |
| 8962.0 | -47 |
| 8963.0 | -48 |
| 8964.0 | -49 |
| 8965.0 | -48 |
| 8966.0 | -47 |
| 8967.0 | -48 |
| 8968.0 | -49 |
| 8969.0 | -50 |
| 8970.0 | -49 |
| 8971.0 | -48 |
| 8972.0 | -49 |
| 8973.0 | -48 |
| 8974.0 | -49 |
| 8975.0 | -48 |
| 8976.0 | -47 |
| 8977.0 | -46 |
| 8978.0 | -47 |
| 8979.0 | -48 |
| 8980.0 | -47 |
| 8981.0 | -46 |
| 8982.0 | -47 |
| 8983.0 | -48 |
| 8984.0 | -47 |
| 8985.0 | -48 |
| 8986.0 | -47 |
| 8987.0 | -48 |
| 8988.0 | -47 |
| 8989.0 | -48 |
| 8990.0 | -47 |
| 8991.0 | -48 |
| 8992.0 | -47 |
| 8993.0 | -48 |
| 8994.0 | -49 |
| 8995.0 | -50 |
| 8996.0 | -51 |
| 8997.0 | -50 |
| 8998.0 | -51 |
| 8999.0 | -52 |
| 9000.0 | -53 |
| 9001.0 | -52 |
| 9002.0 | -53 |
| 9003.0 | -54 |
| 9004.0 | -55 |
| 9005.0 | -56 |
| 9006.0 | -57 |
| 9007.0 | -56 |
| 9008.0 | -57 |
| 9009.0 | -58 |
| 9010.0 | -57 |
| 9011.0 | -58 |
| 9012.0 | -59 |
| 9013.0 | -58 |
| 9014.0 | -57 |
| 9015.0 | -58 |
| 9016.0 | -57 |
| 9017.0 | -56 |
| 9018.0 | -55 |
| 9019.0 | -54 |
| 9020.0 | -53 |
| 9021.0 | -54 |
| 9022.0 | -55 |
| 9023.0 | -56 |
| 9024.0 | -57 |
| 9025.0 | -58 |
| 9026.0 | -57 |
| 9027.0 | -58 |
| 9028.0 | -57 |
| 9029.0 | -56 |
| 9030.0 | -55 |
| 9031.0 | -54 |
| 9032.0 | -53 |
| 9033.0 | -54 |
| 9034.0 | -55 |
| 9035.0 | -56 |
| 9036.0 | -57 |
| 9037.0 | -58 |
| 9038.0 | -59 |
| 9039.0 | -60 |
| 9040.0 | -61 |
| 9041.0 | -62 |
| 9042.0 | -63 |
| 9043.0 | -64 |
| 9044.0 | -63 |
| 9045.0 | -62 |
| 9046.0 | -61 |
| 9047.0 | -62 |
| 9048.0 | -63 |
| 9049.0 | -62 |
| 9050.0 | -63 |
| 9051.0 | -62 |
| 9052.0 | -61 |
| 9053.0 | -62 |
| 9054.0 | -61 |
| 9055.0 | -60 |
| 9056.0 | -59 |
| 9057.0 | -60 |
| 9058.0 | -59 |
| 9059.0 | -58 |
| 9060.0 | -57 |
| 9061.0 | -58 |
| 9062.0 | -57 |
| 9063.0 | -56 |
| 9064.0 | -55 |
| 9065.0 | -56 |
| 9066.0 | -55 |
| 9067.0 | -56 |
| 9068.0 | -57 |
| 9069.0 | -58 |
| 9070.0 | -57 |
| 9071.0 | -56 |
| 9072.0 | -55 |
| 9073.0 | -56 |
| 9074.0 | -57 |
| 9075.0 | -56 |
| 9076.0 | -55 |
| 9077.0 | -54 |
| 9078.0 | -55 |
| 9079.0 | -56 |
| 9080.0 | -55 |
| 9081.0 | -56 |
| 9082.0 | -55 |
| 9083.0 | -54 |
| 9084.0 | -55 |
| 9085.0 | -54 |
| 9086.0 | -53 |
| 9087.0 | -54 |
| 9088.0 | -53 |
| 9089.0 | -54 |
| 9090.0 | -53 |
| 9091.0 | -52 |
| 9092.0 | -51 |
| 9093.0 | -50 |
| 9094.0 | -51 |
| 9095.0 | -52 |
| 9096.0 | -51 |
| 9097.0 | -50 |
| 9098.0 | -49 |
| 9099.0 | -50 |
| 9100.0 | -49 |
| 9101.0 | -48 |
| 9102.0 | -49 |
| 9103.0 | -50 |
| 9104.0 | -49 |
| 9105.0 | -50 |
| 9106.0 | -49 |
| 9107.0 | -48 |
| 9108.0 | -47 |
| 9109.0 | -46 |
| 9110.0 | -45 |
| 9111.0 | -44 |
| 9112.0 | -45 |
| 9113.0 | -44 |
| 9114.0 | -45 |
| 9115.0 | -46 |
| 9116.0 | -45 |
| 9117.0 | -44 |
| 9118.0 | -43 |
| 9119.0 | -42 |
| 9120.0 | -41 |
| 9121.0 | -42 |
| 9122.0 | -41 |
| 9123.0 | -42 |
| 9124.0 | -43 |
| 9125.0 | -42 |
| 9126.0 | -43 |
| 9127.0 | -44 |
| 9128.0 | -45 |
| 9129.0 | -44 |
| 9130.0 | -45 |
| 9131.0 | -46 |
| 9132.0 | -47 |
| 9133.0 | -48 |
| 9134.0 | -49 |
| 9135.0 | -50 |
| 9136.0 | -51 |
| 9137.0 | -52 |
| 9138.0 | -51 |
| 9139.0 | -50 |
| 9140.0 | -51 |
| 9141.0 | -50 |
| 9142.0 | -49 |
| 9143.0 | -48 |
| 9144.0 | -49 |
| 9145.0 | -50 |
| 9146.0 | -49 |
| 9147.0 | -50 |
| 9148.0 | -49 |
| 9149.0 | -48 |
| 9150.0 | -47 |
| 9151.0 | -46 |
| 9152.0 | -45 |
| 9153.0 | -46 |
| 9154.0 | -47 |
| 9155.0 | -48 |
| 9156.0 | -49 |
| 9157.0 | -48 |
| 9158.0 | -47 |
| 9159.0 | -46 |
| 9160.0 | -45 |
| 9161.0 | -46 |
| 9162.0 | -47 |
| 9163.0 | -46 |
| 9164.0 | -45 |
| 9165.0 | -44 |
| 9166.0 | -45 |
| 9167.0 | -46 |
| 9168.0 | -45 |
| 9169.0 | -46 |
| 9170.0 | -47 |
| 9171.0 | -46 |
| 9172.0 | -47 |
| 9173.0 | -48 |
| 9174.0 | -49 |
| 9175.0 | -50 |
| 9176.0 | -49 |
| 9177.0 | -48 |
| 9178.0 | -49 |
| 9179.0 | -48 |
| 9180.0 | -47 |
| 9181.0 | -48 |
| 9182.0 | -47 |
| 9183.0 | -46 |
| 9184.0 | -45 |
| 9185.0 | -44 |
| 9186.0 | -43 |
| 9187.0 | -42 |
| 9188.0 | -43 |
| 9189.0 | -44 |
| 9190.0 | -45 |
| 9191.0 | -44 |
| 9192.0 | -45 |
| 9193.0 | -44 |
| 9194.0 | -45 |
| 9195.0 | -46 |
| 9196.0 | -47 |
| 9197.0 | -48 |
| 9198.0 | -49 |
| 9199.0 | -48 |
| 9200.0 | -49 |
| 9201.0 | -48 |
| 9202.0 | -47 |
| 9203.0 | -48 |
| 9204.0 | -47 |
| 9205.0 | -48 |
| 9206.0 | -49 |
| 9207.0 | -50 |
| 9208.0 | -49 |
| 9209.0 | -50 |
| 9210.0 | -49 |
| 9211.0 | -50 |
| 9212.0 | -49 |
| 9213.0 | -48 |
| 9214.0 | -49 |
| 9215.0 | -48 |
| 9216.0 | -47 |
| 9217.0 | -48 |
| 9218.0 | -49 |
| 9219.0 | -50 |
| 9220.0 | -51 |
| 9221.0 | -52 |
| 9222.0 | -51 |
| 9223.0 | -52 |
| 9224.0 | -53 |
| 9225.0 | -54 |
| 9226.0 | -53 |
| 9227.0 | -54 |
| 9228.0 | -53 |
| 9229.0 | -52 |
| 9230.0 | -53 |
| 9231.0 | -54 |
| 9232.0 | -55 |
| 9233.0 | -56 |
| 9234.0 | -55 |
| 9235.0 | -56 |
| 9236.0 | -57 |
| 9237.0 | -56 |
| 9238.0 | -57 |
| 9239.0 | -56 |
| 9240.0 | -57 |
| 9241.0 | -58 |
| 9242.0 | -57 |
| 9243.0 | -56 |
| 9244.0 | -57 |
| 9245.0 | -56 |
| 9246.0 | -57 |
| 9247.0 | -58 |
| 9248.0 | -59 |
| 9249.0 | -60 |
| 9250.0 | -61 |
| 9251.0 | -60 |
| 9252.0 | -59 |
| 9253.0 | -58 |
| 9254.0 | -57 |
| 9255.0 | -58 |
| 9256.0 | -59 |
| 9257.0 | -58 |
| 9258.0 | -57 |
| 9259.0 | -56 |
| 9260.0 | -57 |
| 9261.0 | -58 |
| 9262.0 | -57 |
| 9263.0 | -58 |
| 9264.0 | -57 |
| 9265.0 | -58 |
| 9266.0 | -59 |
| 9267.0 | -60 |
| 9268.0 | -61 |
| 9269.0 | -60 |
| 9270.0 | -59 |
| 9271.0 | -58 |
| 9272.0 | -59 |
| 9273.0 | -60 |
| 9274.0 | -59 |
| 9275.0 | -60 |
| 9276.0 | -61 |
| 9277.0 | -60 |
| 9278.0 | -59 |
| 9279.0 | -58 |
| 9280.0 | -59 |
| 9281.0 | -58 |
| 9282.0 | -57 |
| 9283.0 | -56 |
| 9284.0 | -57 |
| 9285.0 | -56 |
| 9286.0 | -55 |
| 9287.0 | -56 |
| 9288.0 | -57 |
| 9289.0 | -58 |
| 9290.0 | -57 |
| 9291.0 | -56 |
| 9292.0 | -57 |
| 9293.0 | -56 |
| 9294.0 | -55 |
| 9295.0 | -54 |
| 9296.0 | -55 |
| 9297.0 | -56 |
| 9298.0 | -55 |
| 9299.0 | -56 |
| 9300.0 | -57 |
| 9301.0 | -58 |
| 9302.0 | -59 |
| 9303.0 | -58 |
| 9304.0 | -57 |
| 9305.0 | -58 |
| 9306.0 | -57 |
| 9307.0 | -58 |
| 9308.0 | -59 |
| 9309.0 | -58 |
| 9310.0 | -57 |
| 9311.0 | -56 |
| 9312.0 | -55 |
| 9313.0 | -54 |
| 9314.0 | -55 |
| 9315.0 | -54 |
| 9316.0 | -53 |
| 9317.0 | -54 |
| 9318.0 | -53 |
| 9319.0 | -54 |
| 9320.0 | -53 |
| 9321.0 | -52 |
| 9322.0 | -53 |
| 9323.0 | -52 |
| 9324.0 | -51 |
| 9325.0 | -52 |
| 9326.0 | -51 |
| 9327.0 | -50 |
| 9328.0 | -49 |
| 9329.0 | -48 |
| 9330.0 | -47 |
| 9331.0 | -48 |
| 9332.0 | -47 |
| 9333.0 | -48 |
| 9334.0 | -47 |
| 9335.0 | -46 |
| 9336.0 | -45 |
| 9337.0 | -46 |
| 9338.0 | -47 |
| 9339.0 | -48 |
| 9340.0 | -49 |
| 9341.0 | -48 |
| 9342.0 | -49 |
| 9343.0 | -50 |
| 9344.0 | -49 |
| 9345.0 | -48 |
| 9346.0 | -49 |
| 9347.0 | -48 |
| 9348.0 | -47 |
| 9349.0 | -48 |
| 9350.0 | -49 |
| 9351.0 | -50 |
| 9352.0 | -49 |
| 9353.0 | -48 |
| 9354.0 | -49 |
| 9355.0 | -50 |
| 9356.0 | -51 |
| 9357.0 | -52 |
| 9358.0 | -53 |
| 9359.0 | -52 |
| 9360.0 | -51 |
| 9361.0 | -52 |
| 9362.0 | -51 |
| 9363.0 | -50 |
| 9364.0 | -51 |
| 9365.0 | -52 |
| 9366.0 | -51 |
| 9367.0 | -50 |
| 9368.0 | -51 |
| 9369.0 | -50 |
| 9370.0 | -49 |
| 9371.0 | -50 |
| 9372.0 | -49 |
| 9373.0 | -50 |
| 9374.0 | -49 |
| 9375.0 | -48 |
| 9376.0 | -49 |
| 9377.0 | -50 |
| 9378.0 | -51 |
| 9379.0 | -52 |
| 9380.0 | -51 |
| 9381.0 | -52 |
| 9382.0 | -51 |
| 9383.0 | -50 |
| 9384.0 | -49 |
| 9385.0 | -48 |
| 9386.0 | -49 |
| 9387.0 | -48 |
| 9388.0 | -49 |
| 9389.0 | -48 |
| 9390.0 | -47 |
| 9391.0 | -46 |
| 9392.0 | -45 |
| 9393.0 | -46 |
| 9394.0 | -45 |
| 9395.0 | -46 |
| 9396.0 | -47 |
| 9397.0 | -46 |
| 9398.0 | -45 |
| 9399.0 | -44 |
| 9400.0 | -43 |
| 9401.0 | -42 |
| 9402.0 | -41 |
| 9403.0 | -42 |
| 9404.0 | -41 |
| 9405.0 | -40 |
| 9406.0 | -39 |
| 9407.0 | -40 |
| 9408.0 | -41 |
| 9409.0 | -40 |
| 9410.0 | -41 |
| 9411.0 | -42 |
| 9412.0 | -41 |
| 9413.0 | -42 |
| 9414.0 | -41 |
| 9415.0 | -40 |
| 9416.0 | -41 |
| 9417.0 | -40 |
| 9418.0 | -41 |
| 9419.0 | -40 |
| 9420.0 | -39 |
| 9421.0 | -38 |
| 9422.0 | -39 |
| 9423.0 | -40 |
| 9424.0 | -41 |
| 9425.0 | -40 |
| 9426.0 | -39 |
| 9427.0 | -40 |
| 9428.0 | -41 |
| 9429.0 | -40 |
| 9430.0 | -39 |
| 9431.0 | -38 |
| 9432.0 | -37 |
| 9433.0 | -38 |
| 9434.0 | -39 |
| 9435.0 | -40 |
| 9436.0 | -41 |
| 9437.0 | -40 |
| 9438.0 | -39 |
| 9439.0 | -40 |
| 9440.0 | -41 |
| 9441.0 | -42 |
| 9442.0 | -41 |
| 9443.0 | -42 |
| 9444.0 | -43 |
| 9445.0 | -44 |
| 9446.0 | -45 |
| 9447.0 | -46 |
| 9448.0 | -45 |
| 9449.0 | -46 |
| 9450.0 | -47 |
| 9451.0 | -46 |
| 9452.0 | -47 |
| 9453.0 | -46 |
| 9454.0 | -47 |
| 9455.0 | -46 |
| 9456.0 | -45 |
| 9457.0 | -46 |
| 9458.0 | -45 |
| 9459.0 | -46 |
| 9460.0 | -45 |
| 9461.0 | -46 |
| 9462.0 | -45 |
| 9463.0 | -44 |
| 9464.0 | -45 |
| 9465.0 | -46 |
| 9466.0 | -45 |
| 9467.0 | -44 |
| 9468.0 | -45 |
| 9469.0 | -46 |
| 9470.0 | -45 |
| 9471.0 | -46 |
| 9472.0 | -47 |
| 9473.0 | -48 |
| 9474.0 | -47 |
| 9475.0 | -48 |
| 9476.0 | -47 |
| 9477.0 | -46 |
| 9478.0 | -47 |
| 9479.0 | -46 |
| 9480.0 | -45 |
| 9481.0 | -46 |
| 9482.0 | -45 |
| 9483.0 | -44 |
| 9484.0 | -43 |
| 9485.0 | -44 |
| 9486.0 | -43 |
| 9487.0 | -44 |
| 9488.0 | -45 |
| 9489.0 | -46 |
| 9490.0 | -47 |
| 9491.0 | -48 |
| 9492.0 | -49 |
| 9493.0 | -50 |
| 9494.0 | -51 |
| 9495.0 | -50 |
| 9496.0 | -49 |
| 9497.0 | -50 |
| 9498.0 | -49 |
| 9499.0 | -48 |
| 9500.0 | -49 |
| 9501.0 | -50 |
| 9502.0 | -49 |
| 9503.0 | -50 |
| 9504.0 | -51 |
| 9505.0 | -50 |
| 9506.0 | -49 |
| 9507.0 | -48 |
| 9508.0 | -47 |
| 9509.0 | -48 |
| 9510.0 | -47 |
| 9511.0 | -48 |
| 9512.0 | -49 |
| 9513.0 | -50 |
| 9514.0 | -49 |
| 9515.0 | -48 |
| 9516.0 | -47 |
| 9517.0 | -48 |
| 9518.0 | -49 |
| 9519.0 | -50 |
| 9520.0 | -51 |
| 9521.0 | -50 |
| 9522.0 | -49 |
| 9523.0 | -50 |
| 9524.0 | -51 |
| 9525.0 | -50 |
| 9526.0 | -49 |
| 9527.0 | -48 |
| 9528.0 | -47 |
| 9529.0 | -46 |
| 9530.0 | -47 |
| 9531.0 | -48 |
| 9532.0 | -47 |
| 9533.0 | -46 |
| 9534.0 | -45 |
| 9535.0 | -46 |
| 9536.0 | -47 |
| 9537.0 | -46 |
| 9538.0 | -45 |
| 9539.0 | -46 |
| 9540.0 | -47 |
| 9541.0 | -46 |
| 9542.0 | -47 |
| 9543.0 | -48 |
| 9544.0 | -47 |
| 9545.0 | -48 |
| 9546.0 | -49 |
| 9547.0 | -50 |
| 9548.0 | -51 |
| 9549.0 | -50 |
| 9550.0 | -49 |
| 9551.0 | -48 |
| 9552.0 | -47 |
| 9553.0 | -46 |
| 9554.0 | -47 |
| 9555.0 | -46 |
| 9556.0 | -45 |
| 9557.0 | -44 |
| 9558.0 | -45 |
| 9559.0 | -46 |
| 9560.0 | -47 |
| 9561.0 | -48 |
| 9562.0 | -47 |
| 9563.0 | -46 |
| 9564.0 | -45 |
| 9565.0 | -44 |
| 9566.0 | -45 |
| 9567.0 | -44 |
| 9568.0 | -45 |
| 9569.0 | -46 |
| 9570.0 | -45 |
| 9571.0 | -46 |
| 9572.0 | -47 |
| 9573.0 | -46 |
| 9574.0 | -47 |
| 9575.0 | -48 |
| 9576.0 | -49 |
| 9577.0 | -50 |
| 9578.0 | -51 |
| 9579.0 | -52 |
| 9580.0 | -53 |
| 9581.0 | -52 |
| 9582.0 | -51 |
| 9583.0 | -52 |
| 9584.0 | -53 |
| 9585.0 | -52 |
| 9586.0 | -51 |
| 9587.0 | -52 |
| 9588.0 | -53 |
| 9589.0 | -54 |
| 9590.0 | -53 |
| 9591.0 | -52 |
| 9592.0 | -53 |
| 9593.0 | -52 |
| 9594.0 | -53 |
| 9595.0 | -52 |
| 9596.0 | -53 |
| 9597.0 | -52 |
| 9598.0 | -51 |
| 9599.0 | -50 |
| 9600.0 | -49 |
| 9601.0 | -50 |
| 9602.0 | -49 |
| 9603.0 | -50 |
| 9604.0 | -49 |
| 9605.0 | -48 |
| 9606.0 | -49 |
| 9607.0 | -48 |
| 9608.0 | -49 |
| 9609.0 | -50 |
| 9610.0 | -51 |
| 9611.0 | -50 |
| 9612.0 | -49 |
| 9613.0 | -50 |
| 9614.0 | -51 |
| 9615.0 | -52 |
| 9616.0 | -51 |
| 9617.0 | -52 |
| 9618.0 | -51 |
| 9619.0 | -50 |
| 9620.0 | -49 |
| 9621.0 | -48 |
| 9622.0 | -49 |
| 9623.0 | -50 |
| 9624.0 | -51 |
| 9625.0 | -50 |
| 9626.0 | -49 |
| 9627.0 | -48 |
| 9628.0 | -47 |
| 9629.0 | -48 |
| 9630.0 | -49 |
| 9631.0 | -48 |
| 9632.0 | -47 |
| 9633.0 | -46 |
| 9634.0 | -47 |
| 9635.0 | -46 |
| 9636.0 | -47 |
| 9637.0 | -46 |
| 9638.0 | -45 |
| 9639.0 | -46 |
| 9640.0 | -47 |
| 9641.0 | -48 |
| 9642.0 | -47 |
| 9643.0 | -48 |
| 9644.0 | -49 |
| 9645.0 | -48 |
| 9646.0 | -49 |
| 9647.0 | -50 |
| 9648.0 | -51 |
| 9649.0 | -50 |
| 9650.0 | -51 |
| 9651.0 | -50 |
| 9652.0 | -49 |
| 9653.0 | -50 |
| 9654.0 | -49 |
| 9655.0 | -50 |
| 9656.0 | -49 |
| 9657.0 | -50 |
| 9658.0 | -51 |
| 9659.0 | -50 |
| 9660.0 | -49 |
| 9661.0 | -48 |
| 9662.0 | -49 |
| 9663.0 | -48 |
| 9664.0 | -47 |
| 9665.0 | -48 |
| 9666.0 | -47 |
| 9667.0 | -48 |
| 9668.0 | -47 |
| 9669.0 | -48 |
| 9670.0 | -47 |
| 9671.0 | -46 |
| 9672.0 | -45 |
| 9673.0 | -44 |
| 9674.0 | -43 |
| 9675.0 | -44 |
| 9676.0 | -45 |
| 9677.0 | -46 |
| 9678.0 | -45 |
| 9679.0 | -44 |
| 9680.0 | -43 |
| 9681.0 | -44 |
| 9682.0 | -45 |
| 9683.0 | -46 |
| 9684.0 | -47 |
| 9685.0 | -46 |
| 9686.0 | -47 |
| 9687.0 | -46 |
| 9688.0 | -45 |
| 9689.0 | -44 |
| 9690.0 | -45 |
| 9691.0 | -46 |
| 9692.0 | -47 |
| 9693.0 | -48 |
| 9694.0 | -47 |
| 9695.0 | -48 |
| 9696.0 | -47 |
| 9697.0 | -46 |
| 9698.0 | -47 |
| 9699.0 | -48 |
| 9700.0 | -47 |
| 9701.0 | -48 |
| 9702.0 | -47 |
| 9703.0 | -48 |
| 9704.0 | -49 |
| 9705.0 | -48 |
| 9706.0 | -49 |
| 9707.0 | -50 |
| 9708.0 | -49 |
| 9709.0 | -50 |
| 9710.0 | -49 |
| 9711.0 | -50 |
| 9712.0 | -51 |
| 9713.0 | -50 |
| 9714.0 | -49 |
| 9715.0 | -48 |
| 9716.0 | -47 |
| 9717.0 | -48 |
| 9718.0 | -47 |
| 9719.0 | -48 |
| 9720.0 | -47 |
| 9721.0 | -46 |
| 9722.0 | -45 |
| 9723.0 | -44 |
| 9724.0 | -43 |
| 9725.0 | -44 |
| 9726.0 | -43 |
| 9727.0 | -44 |
| 9728.0 | -43 |
| 9729.0 | -44 |
| 9730.0 | -45 |
| 9731.0 | -46 |
| 9732.0 | -47 |
| 9733.0 | -46 |
| 9734.0 | -45 |
| 9735.0 | -46 |
| 9736.0 | -47 |
| 9737.0 | -48 |
| 9738.0 | -49 |
| 9739.0 | -50 |
| 9740.0 | -49 |
| 9741.0 | -48 |
| 9742.0 | -49 |
| 9743.0 | -48 |
| 9744.0 | -49 |
| 9745.0 | -48 |
| 9746.0 | -49 |
| 9747.0 | -50 |
| 9748.0 | -51 |
| 9749.0 | -52 |
| 9750.0 | -51 |
| 9751.0 | -52 |
| 9752.0 | -51 |
| 9753.0 | -52 |
| 9754.0 | -53 |
| 9755.0 | -52 |
| 9756.0 | -51 |
| 9757.0 | -52 |
| 9758.0 | -51 |
| 9759.0 | -50 |
| 9760.0 | -51 |
| 9761.0 | -50 |
| 9762.0 | -49 |
| 9763.0 | -50 |
| 9764.0 | -49 |
| 9765.0 | -50 |
| 9766.0 | -51 |
| 9767.0 | -50 |
| 9768.0 | -49 |
| 9769.0 | -50 |
| 9770.0 | -49 |
| 9771.0 | -48 |
| 9772.0 | -47 |
| 9773.0 | -48 |
| 9774.0 | -47 |
| 9775.0 | -46 |
| 9776.0 | -47 |
| 9777.0 | -46 |
| 9778.0 | -45 |
| 9779.0 | -46 |
| 9780.0 | -45 |
| 9781.0 | -44 |
| 9782.0 | -45 |
| 9783.0 | -46 |
| 9784.0 | -47 |
| 9785.0 | -48 |
| 9786.0 | -49 |
| 9787.0 | -48 |
| 9788.0 | -47 |
| 9789.0 | -46 |
| 9790.0 | -45 |
| 9791.0 | -44 |
| 9792.0 | -45 |
| 9793.0 | -44 |
| 9794.0 | -43 |
| 9795.0 | -44 |
| 9796.0 | -43 |
| 9797.0 | -42 |
| 9798.0 | -41 |
| 9799.0 | -40 |
| 9800.0 | -39 |
| 9801.0 | -38 |
| 9802.0 | -37 |
| 9803.0 | -36 |
| 9804.0 | -37 |
| 9805.0 | -38 |
| 9806.0 | -37 |
| 9807.0 | -38 |
| 9808.0 | -37 |
| 9809.0 | -36 |
| 9810.0 | -37 |
| 9811.0 | -36 |
| 9812.0 | -35 |
| 9813.0 | -36 |
| 9814.0 | -37 |
| 9815.0 | -38 |
| 9816.0 | -39 |
| 9817.0 | -38 |
| 9818.0 | -37 |
| 9819.0 | -36 |
| 9820.0 | -35 |
| 9821.0 | -36 |
| 9822.0 | -35 |
| 9823.0 | -36 |
| 9824.0 | -35 |
| 9825.0 | -36 |
| 9826.0 | -37 |
| 9827.0 | -38 |
| 9828.0 | -37 |
| 9829.0 | -36 |
| 9830.0 | -37 |
| 9831.0 | -36 |
| 9832.0 | -37 |
| 9833.0 | -38 |
| 9834.0 | -39 |
| 9835.0 | -38 |
| 9836.0 | -37 |
| 9837.0 | -38 |
| 9838.0 | -39 |
| 9839.0 | -38 |
| 9840.0 | -39 |
| 9841.0 | -40 |
| 9842.0 | -41 |
| 9843.0 | -42 |
| 9844.0 | -41 |
| 9845.0 | -42 |
| 9846.0 | -41 |
| 9847.0 | -40 |
| 9848.0 | -41 |
| 9849.0 | -40 |
| 9850.0 | -41 |
| 9851.0 | -42 |
| 9852.0 | -41 |
| 9853.0 | -40 |
| 9854.0 | -39 |
| 9855.0 | -40 |
| 9856.0 | -39 |
| 9857.0 | -40 |
| 9858.0 | -39 |
| 9859.0 | -38 |
| 9860.0 | -39 |
| 9861.0 | -38 |
| 9862.0 | -37 |
| 9863.0 | -38 |
| 9864.0 | -37 |
| 9865.0 | -36 |
| 9866.0 | -37 |
| 9867.0 | -36 |
| 9868.0 | -35 |
| 9869.0 | -36 |
| 9870.0 | -37 |
| 9871.0 | -38 |
| 9872.0 | -39 |
| 9873.0 | -38 |
| 9874.0 | -39 |
| 9875.0 | -38 |
| 9876.0 | -39 |
| 9877.0 | -38 |
| 9878.0 | -37 |
| 9879.0 | -36 |
| 9880.0 | -37 |
| 9881.0 | -36 |
| 9882.0 | -37 |
| 9883.0 | -38 |
| 9884.0 | -37 |
| 9885.0 | -38 |
| 9886.0 | -37 |
| 9887.0 | -36 |
| 9888.0 | -37 |
| 9889.0 | -36 |
| 9890.0 | -37 |
| 9891.0 | -38 |
| 9892.0 | -37 |
| 9893.0 | -36 |
| 9894.0 | -37 |
| 9895.0 | -38 |
| 9896.0 | -39 |
| 9897.0 | -38 |
| 9898.0 | -39 |
| 9899.0 | -40 |
| 9900.0 | -39 |
| 9901.0 | -38 |
| 9902.0 | -39 |
| 9903.0 | -38 |
| 9904.0 | -39 |
| 9905.0 | -40 |
| 9906.0 | -39 |
| 9907.0 | -38 |
| 9908.0 | -39 |
| 9909.0 | -38 |
| 9910.0 | -37 |
| 9911.0 | -36 |
| 9912.0 | -35 |
| 9913.0 | -36 |
| 9914.0 | -37 |
| 9915.0 | -36 |
| 9916.0 | -35 |
| 9917.0 | -36 |
| 9918.0 | -35 |
| 9919.0 | -34 |
| 9920.0 | -35 |
| 9921.0 | -36 |
| 9922.0 | -35 |
| 9923.0 | -34 |
| 9924.0 | -35 |
| 9925.0 | -36 |
| 9926.0 | -37 |
| 9927.0 | -36 |
| 9928.0 | -37 |
| 9929.0 | -38 |
| 9930.0 | -39 |
| 9931.0 | -38 |
| 9932.0 | -37 |
| 9933.0 | -38 |
| 9934.0 | -37 |
| 9935.0 | -36 |
| 9936.0 | -35 |
| 9937.0 | -34 |
| 9938.0 | -35 |
| 9939.0 | -34 |
| 9940.0 | -33 |
| 9941.0 | -32 |
| 9942.0 | -31 |
| 9943.0 | -30 |
| 9944.0 | -29 |
| 9945.0 | -30 |
| 9946.0 | -31 |
| 9947.0 | -32 |
| 9948.0 | -31 |
| 9949.0 | -32 |
| 9950.0 | -31 |
| 9951.0 | -32 |
| 9952.0 | -31 |
| 9953.0 | -32 |
| 9954.0 | -31 |
| 9955.0 | -30 |
| 9956.0 | -29 |
| 9957.0 | -28 |
| 9958.0 | -29 |
| 9959.0 | -28 |
| 9960.0 | -27 |
| 9961.0 | -26 |
| 9962.0 | -25 |
| 9963.0 | -26 |
| 9964.0 | -27 |
| 9965.0 | -26 |
| 9966.0 | -27 |
| 9967.0 | -26 |
| 9968.0 | -25 |
| 9969.0 | -24 |
| 9970.0 | -25 |
| 9971.0 | -24 |
| 9972.0 | -23 |
| 9973.0 | -24 |
| 9974.0 | -23 |
| 9975.0 | -24 |
| 9976.0 | -23 |
| 9977.0 | -22 |
| 9978.0 | -21 |
| 9979.0 | -20 |
| 9980.0 | -19 |
| 9981.0 | -20 |
| 9982.0 | -21 |
| 9983.0 | -22 |
| 9984.0 | -23 |
| 9985.0 | -22 |
| 9986.0 | -23 |
| 9987.0 | -22 |
| 9988.0 | -21 |
| 9989.0 | -22 |
| 9990.0 | -23 |
| 9991.0 | -24 |
| 9992.0 | -23 |
| 9993.0 | -24 |
| 9994.0 | -23 |
| 9995.0 | -22 |
| 9996.0 | -21 |
| 9997.0 | -22 |
| 9998.0 | -23 |
| 9999.0 | -22 |
| 10000.0 | -21 |